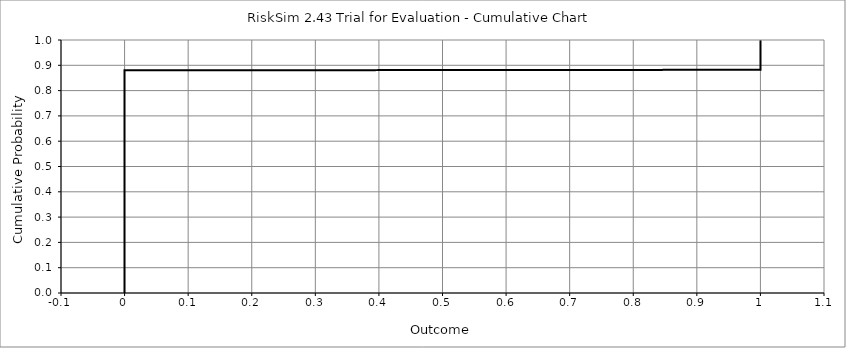
| Category | Series 0 |
|---|---|
| 0.0 | 0 |
| 0.0 | 0 |
| 0.0 | 0 |
| 0.0 | 0 |
| 0.0 | 0 |
| 0.0 | 0.001 |
| 0.0 | 0.001 |
| 0.0 | 0.001 |
| 0.0 | 0.001 |
| 0.0 | 0.001 |
| 0.0 | 0.001 |
| 0.0 | 0.001 |
| 0.0 | 0.001 |
| 0.0 | 0.001 |
| 0.0 | 0.001 |
| 0.0 | 0.002 |
| 0.0 | 0.002 |
| 0.0 | 0.002 |
| 0.0 | 0.002 |
| 0.0 | 0.002 |
| 0.0 | 0.002 |
| 0.0 | 0.002 |
| 0.0 | 0.002 |
| 0.0 | 0.002 |
| 0.0 | 0.002 |
| 0.0 | 0.003 |
| 0.0 | 0.003 |
| 0.0 | 0.003 |
| 0.0 | 0.003 |
| 0.0 | 0.003 |
| 0.0 | 0.003 |
| 0.0 | 0.003 |
| 0.0 | 0.003 |
| 0.0 | 0.003 |
| 0.0 | 0.003 |
| 0.0 | 0.004 |
| 0.0 | 0.004 |
| 0.0 | 0.004 |
| 0.0 | 0.004 |
| 0.0 | 0.004 |
| 0.0 | 0.004 |
| 0.0 | 0.004 |
| 0.0 | 0.004 |
| 0.0 | 0.004 |
| 0.0 | 0.004 |
| 0.0 | 0.005 |
| 0.0 | 0.005 |
| 0.0 | 0.005 |
| 0.0 | 0.005 |
| 0.0 | 0.005 |
| 0.0 | 0.005 |
| 0.0 | 0.005 |
| 0.0 | 0.005 |
| 0.0 | 0.005 |
| 0.0 | 0.005 |
| 0.0 | 0.006 |
| 0.0 | 0.006 |
| 0.0 | 0.006 |
| 0.0 | 0.006 |
| 0.0 | 0.006 |
| 0.0 | 0.006 |
| 0.0 | 0.006 |
| 0.0 | 0.006 |
| 0.0 | 0.006 |
| 0.0 | 0.006 |
| 0.0 | 0.007 |
| 0.0 | 0.007 |
| 0.0 | 0.007 |
| 0.0 | 0.007 |
| 0.0 | 0.007 |
| 0.0 | 0.007 |
| 0.0 | 0.007 |
| 0.0 | 0.007 |
| 0.0 | 0.007 |
| 0.0 | 0.007 |
| 0.0 | 0.008 |
| 0.0 | 0.008 |
| 0.0 | 0.008 |
| 0.0 | 0.008 |
| 0.0 | 0.008 |
| 0.0 | 0.008 |
| 0.0 | 0.008 |
| 0.0 | 0.008 |
| 0.0 | 0.008 |
| 0.0 | 0.008 |
| 0.0 | 0.009 |
| 0.0 | 0.009 |
| 0.0 | 0.009 |
| 0.0 | 0.009 |
| 0.0 | 0.009 |
| 0.0 | 0.009 |
| 0.0 | 0.009 |
| 0.0 | 0.009 |
| 0.0 | 0.009 |
| 0.0 | 0.009 |
| 0.0 | 0.01 |
| 0.0 | 0.01 |
| 0.0 | 0.01 |
| 0.0 | 0.01 |
| 0.0 | 0.01 |
| 0.0 | 0.01 |
| 0.0 | 0.01 |
| 0.0 | 0.01 |
| 0.0 | 0.01 |
| 0.0 | 0.01 |
| 0.0 | 0.011 |
| 0.0 | 0.011 |
| 0.0 | 0.011 |
| 0.0 | 0.011 |
| 0.0 | 0.011 |
| 0.0 | 0.011 |
| 0.0 | 0.011 |
| 0.0 | 0.011 |
| 0.0 | 0.011 |
| 0.0 | 0.011 |
| 0.0 | 0.012 |
| 0.0 | 0.012 |
| 0.0 | 0.012 |
| 0.0 | 0.012 |
| 0.0 | 0.012 |
| 0.0 | 0.012 |
| 0.0 | 0.012 |
| 0.0 | 0.012 |
| 0.0 | 0.012 |
| 0.0 | 0.012 |
| 0.0 | 0.013 |
| 0.0 | 0.013 |
| 0.0 | 0.013 |
| 0.0 | 0.013 |
| 0.0 | 0.013 |
| 0.0 | 0.013 |
| 0.0 | 0.013 |
| 0.0 | 0.013 |
| 0.0 | 0.013 |
| 0.0 | 0.013 |
| 0.0 | 0.014 |
| 0.0 | 0.014 |
| 0.0 | 0.014 |
| 0.0 | 0.014 |
| 0.0 | 0.014 |
| 0.0 | 0.014 |
| 0.0 | 0.014 |
| 0.0 | 0.014 |
| 0.0 | 0.014 |
| 0.0 | 0.014 |
| 0.0 | 0.015 |
| 0.0 | 0.015 |
| 0.0 | 0.015 |
| 0.0 | 0.015 |
| 0.0 | 0.015 |
| 0.0 | 0.015 |
| 0.0 | 0.015 |
| 0.0 | 0.015 |
| 0.0 | 0.015 |
| 0.0 | 0.015 |
| 0.0 | 0.016 |
| 0.0 | 0.016 |
| 0.0 | 0.016 |
| 0.0 | 0.016 |
| 0.0 | 0.016 |
| 0.0 | 0.016 |
| 0.0 | 0.016 |
| 0.0 | 0.016 |
| 0.0 | 0.016 |
| 0.0 | 0.016 |
| 0.0 | 0.017 |
| 0.0 | 0.017 |
| 0.0 | 0.017 |
| 0.0 | 0.017 |
| 0.0 | 0.017 |
| 0.0 | 0.017 |
| 0.0 | 0.017 |
| 0.0 | 0.017 |
| 0.0 | 0.017 |
| 0.0 | 0.017 |
| 0.0 | 0.018 |
| 0.0 | 0.018 |
| 0.0 | 0.018 |
| 0.0 | 0.018 |
| 0.0 | 0.018 |
| 0.0 | 0.018 |
| 0.0 | 0.018 |
| 0.0 | 0.018 |
| 0.0 | 0.018 |
| 0.0 | 0.018 |
| 0.0 | 0.019 |
| 0.0 | 0.019 |
| 0.0 | 0.019 |
| 0.0 | 0.019 |
| 0.0 | 0.019 |
| 0.0 | 0.019 |
| 0.0 | 0.019 |
| 0.0 | 0.019 |
| 0.0 | 0.019 |
| 0.0 | 0.019 |
| 0.0 | 0.02 |
| 0.0 | 0.02 |
| 0.0 | 0.02 |
| 0.0 | 0.02 |
| 0.0 | 0.02 |
| 0.0 | 0.02 |
| 0.0 | 0.02 |
| 0.0 | 0.02 |
| 0.0 | 0.02 |
| 0.0 | 0.02 |
| 0.0 | 0.021 |
| 0.0 | 0.021 |
| 0.0 | 0.021 |
| 0.0 | 0.021 |
| 0.0 | 0.021 |
| 0.0 | 0.021 |
| 0.0 | 0.021 |
| 0.0 | 0.021 |
| 0.0 | 0.021 |
| 0.0 | 0.021 |
| 0.0 | 0.022 |
| 0.0 | 0.022 |
| 0.0 | 0.022 |
| 0.0 | 0.022 |
| 0.0 | 0.022 |
| 0.0 | 0.022 |
| 0.0 | 0.022 |
| 0.0 | 0.022 |
| 0.0 | 0.022 |
| 0.0 | 0.022 |
| 0.0 | 0.023 |
| 0.0 | 0.023 |
| 0.0 | 0.023 |
| 0.0 | 0.023 |
| 0.0 | 0.023 |
| 0.0 | 0.023 |
| 0.0 | 0.023 |
| 0.0 | 0.023 |
| 0.0 | 0.023 |
| 0.0 | 0.023 |
| 0.0 | 0.024 |
| 0.0 | 0.024 |
| 0.0 | 0.024 |
| 0.0 | 0.024 |
| 0.0 | 0.024 |
| 0.0 | 0.024 |
| 0.0 | 0.024 |
| 0.0 | 0.024 |
| 0.0 | 0.024 |
| 0.0 | 0.024 |
| 0.0 | 0.025 |
| 0.0 | 0.025 |
| 0.0 | 0.025 |
| 0.0 | 0.025 |
| 0.0 | 0.025 |
| 0.0 | 0.025 |
| 0.0 | 0.025 |
| 0.0 | 0.025 |
| 0.0 | 0.025 |
| 0.0 | 0.025 |
| 0.0 | 0.026 |
| 0.0 | 0.026 |
| 0.0 | 0.026 |
| 0.0 | 0.026 |
| 0.0 | 0.026 |
| 0.0 | 0.026 |
| 0.0 | 0.026 |
| 0.0 | 0.026 |
| 0.0 | 0.026 |
| 0.0 | 0.026 |
| 0.0 | 0.027 |
| 0.0 | 0.027 |
| 0.0 | 0.027 |
| 0.0 | 0.027 |
| 0.0 | 0.027 |
| 0.0 | 0.027 |
| 0.0 | 0.027 |
| 0.0 | 0.027 |
| 0.0 | 0.027 |
| 0.0 | 0.027 |
| 0.0 | 0.028 |
| 0.0 | 0.028 |
| 0.0 | 0.028 |
| 0.0 | 0.028 |
| 0.0 | 0.028 |
| 0.0 | 0.028 |
| 0.0 | 0.028 |
| 0.0 | 0.028 |
| 0.0 | 0.028 |
| 0.0 | 0.028 |
| 0.0 | 0.029 |
| 0.0 | 0.029 |
| 0.0 | 0.029 |
| 0.0 | 0.029 |
| 0.0 | 0.029 |
| 0.0 | 0.029 |
| 0.0 | 0.029 |
| 0.0 | 0.029 |
| 0.0 | 0.029 |
| 0.0 | 0.029 |
| 0.0 | 0.03 |
| 0.0 | 0.03 |
| 0.0 | 0.03 |
| 0.0 | 0.03 |
| 0.0 | 0.03 |
| 0.0 | 0.03 |
| 0.0 | 0.03 |
| 0.0 | 0.03 |
| 0.0 | 0.03 |
| 0.0 | 0.03 |
| 0.0 | 0.031 |
| 0.0 | 0.031 |
| 0.0 | 0.031 |
| 0.0 | 0.031 |
| 0.0 | 0.031 |
| 0.0 | 0.031 |
| 0.0 | 0.031 |
| 0.0 | 0.031 |
| 0.0 | 0.031 |
| 0.0 | 0.031 |
| 0.0 | 0.032 |
| 0.0 | 0.032 |
| 0.0 | 0.032 |
| 0.0 | 0.032 |
| 0.0 | 0.032 |
| 0.0 | 0.032 |
| 0.0 | 0.032 |
| 0.0 | 0.032 |
| 0.0 | 0.032 |
| 0.0 | 0.032 |
| 0.0 | 0.033 |
| 0.0 | 0.033 |
| 0.0 | 0.033 |
| 0.0 | 0.033 |
| 0.0 | 0.033 |
| 0.0 | 0.033 |
| 0.0 | 0.033 |
| 0.0 | 0.033 |
| 0.0 | 0.033 |
| 0.0 | 0.033 |
| 0.0 | 0.034 |
| 0.0 | 0.034 |
| 0.0 | 0.034 |
| 0.0 | 0.034 |
| 0.0 | 0.034 |
| 0.0 | 0.034 |
| 0.0 | 0.034 |
| 0.0 | 0.034 |
| 0.0 | 0.034 |
| 0.0 | 0.034 |
| 0.0 | 0.035 |
| 0.0 | 0.035 |
| 0.0 | 0.035 |
| 0.0 | 0.035 |
| 0.0 | 0.035 |
| 0.0 | 0.035 |
| 0.0 | 0.035 |
| 0.0 | 0.035 |
| 0.0 | 0.035 |
| 0.0 | 0.035 |
| 0.0 | 0.036 |
| 0.0 | 0.036 |
| 0.0 | 0.036 |
| 0.0 | 0.036 |
| 0.0 | 0.036 |
| 0.0 | 0.036 |
| 0.0 | 0.036 |
| 0.0 | 0.036 |
| 0.0 | 0.036 |
| 0.0 | 0.036 |
| 0.0 | 0.037 |
| 0.0 | 0.037 |
| 0.0 | 0.037 |
| 0.0 | 0.037 |
| 0.0 | 0.037 |
| 0.0 | 0.037 |
| 0.0 | 0.037 |
| 0.0 | 0.037 |
| 0.0 | 0.037 |
| 0.0 | 0.037 |
| 0.0 | 0.038 |
| 0.0 | 0.038 |
| 0.0 | 0.038 |
| 0.0 | 0.038 |
| 0.0 | 0.038 |
| 0.0 | 0.038 |
| 0.0 | 0.038 |
| 0.0 | 0.038 |
| 0.0 | 0.038 |
| 0.0 | 0.038 |
| 0.0 | 0.039 |
| 0.0 | 0.039 |
| 0.0 | 0.039 |
| 0.0 | 0.039 |
| 0.0 | 0.039 |
| 0.0 | 0.039 |
| 0.0 | 0.039 |
| 0.0 | 0.039 |
| 0.0 | 0.039 |
| 0.0 | 0.039 |
| 0.0 | 0.04 |
| 0.0 | 0.04 |
| 0.0 | 0.04 |
| 0.0 | 0.04 |
| 0.0 | 0.04 |
| 0.0 | 0.04 |
| 0.0 | 0.04 |
| 0.0 | 0.04 |
| 0.0 | 0.04 |
| 0.0 | 0.04 |
| 0.0 | 0.041 |
| 0.0 | 0.041 |
| 0.0 | 0.041 |
| 0.0 | 0.041 |
| 0.0 | 0.041 |
| 0.0 | 0.041 |
| 0.0 | 0.041 |
| 0.0 | 0.041 |
| 0.0 | 0.041 |
| 0.0 | 0.041 |
| 0.0 | 0.042 |
| 0.0 | 0.042 |
| 0.0 | 0.042 |
| 0.0 | 0.042 |
| 0.0 | 0.042 |
| 0.0 | 0.042 |
| 0.0 | 0.042 |
| 0.0 | 0.042 |
| 0.0 | 0.042 |
| 0.0 | 0.042 |
| 0.0 | 0.043 |
| 0.0 | 0.043 |
| 0.0 | 0.043 |
| 0.0 | 0.043 |
| 0.0 | 0.043 |
| 0.0 | 0.043 |
| 0.0 | 0.043 |
| 0.0 | 0.043 |
| 0.0 | 0.043 |
| 0.0 | 0.043 |
| 0.0 | 0.044 |
| 0.0 | 0.044 |
| 0.0 | 0.044 |
| 0.0 | 0.044 |
| 0.0 | 0.044 |
| 0.0 | 0.044 |
| 0.0 | 0.044 |
| 0.0 | 0.044 |
| 0.0 | 0.044 |
| 0.0 | 0.044 |
| 0.0 | 0.045 |
| 0.0 | 0.045 |
| 0.0 | 0.045 |
| 0.0 | 0.045 |
| 0.0 | 0.045 |
| 0.0 | 0.045 |
| 0.0 | 0.045 |
| 0.0 | 0.045 |
| 0.0 | 0.045 |
| 0.0 | 0.045 |
| 0.0 | 0.046 |
| 0.0 | 0.046 |
| 0.0 | 0.046 |
| 0.0 | 0.046 |
| 0.0 | 0.046 |
| 0.0 | 0.046 |
| 0.0 | 0.046 |
| 0.0 | 0.046 |
| 0.0 | 0.046 |
| 0.0 | 0.046 |
| 0.0 | 0.047 |
| 0.0 | 0.047 |
| 0.0 | 0.047 |
| 0.0 | 0.047 |
| 0.0 | 0.047 |
| 0.0 | 0.047 |
| 0.0 | 0.047 |
| 0.0 | 0.047 |
| 0.0 | 0.047 |
| 0.0 | 0.047 |
| 0.0 | 0.048 |
| 0.0 | 0.048 |
| 0.0 | 0.048 |
| 0.0 | 0.048 |
| 0.0 | 0.048 |
| 0.0 | 0.048 |
| 0.0 | 0.048 |
| 0.0 | 0.048 |
| 0.0 | 0.048 |
| 0.0 | 0.048 |
| 0.0 | 0.049 |
| 0.0 | 0.049 |
| 0.0 | 0.049 |
| 0.0 | 0.049 |
| 0.0 | 0.049 |
| 0.0 | 0.049 |
| 0.0 | 0.049 |
| 0.0 | 0.049 |
| 0.0 | 0.049 |
| 0.0 | 0.049 |
| 0.0 | 0.05 |
| 0.0 | 0.05 |
| 0.0 | 0.05 |
| 0.0 | 0.05 |
| 0.0 | 0.05 |
| 0.0 | 0.05 |
| 0.0 | 0.05 |
| 0.0 | 0.05 |
| 0.0 | 0.05 |
| 0.0 | 0.05 |
| 0.0 | 0.051 |
| 0.0 | 0.051 |
| 0.0 | 0.051 |
| 0.0 | 0.051 |
| 0.0 | 0.051 |
| 0.0 | 0.051 |
| 0.0 | 0.051 |
| 0.0 | 0.051 |
| 0.0 | 0.051 |
| 0.0 | 0.051 |
| 0.0 | 0.052 |
| 0.0 | 0.052 |
| 0.0 | 0.052 |
| 0.0 | 0.052 |
| 0.0 | 0.052 |
| 0.0 | 0.052 |
| 0.0 | 0.052 |
| 0.0 | 0.052 |
| 0.0 | 0.052 |
| 0.0 | 0.052 |
| 0.0 | 0.053 |
| 0.0 | 0.053 |
| 0.0 | 0.053 |
| 0.0 | 0.053 |
| 0.0 | 0.053 |
| 0.0 | 0.053 |
| 0.0 | 0.053 |
| 0.0 | 0.053 |
| 0.0 | 0.053 |
| 0.0 | 0.053 |
| 0.0 | 0.054 |
| 0.0 | 0.054 |
| 0.0 | 0.054 |
| 0.0 | 0.054 |
| 0.0 | 0.054 |
| 0.0 | 0.054 |
| 0.0 | 0.054 |
| 0.0 | 0.054 |
| 0.0 | 0.054 |
| 0.0 | 0.054 |
| 0.0 | 0.055 |
| 0.0 | 0.055 |
| 0.0 | 0.055 |
| 0.0 | 0.055 |
| 0.0 | 0.055 |
| 0.0 | 0.055 |
| 0.0 | 0.055 |
| 0.0 | 0.055 |
| 0.0 | 0.055 |
| 0.0 | 0.055 |
| 0.0 | 0.056 |
| 0.0 | 0.056 |
| 0.0 | 0.056 |
| 0.0 | 0.056 |
| 0.0 | 0.056 |
| 0.0 | 0.056 |
| 0.0 | 0.056 |
| 0.0 | 0.056 |
| 0.0 | 0.056 |
| 0.0 | 0.056 |
| 0.0 | 0.057 |
| 0.0 | 0.057 |
| 0.0 | 0.057 |
| 0.0 | 0.057 |
| 0.0 | 0.057 |
| 0.0 | 0.057 |
| 0.0 | 0.057 |
| 0.0 | 0.057 |
| 0.0 | 0.057 |
| 0.0 | 0.057 |
| 0.0 | 0.058 |
| 0.0 | 0.058 |
| 0.0 | 0.058 |
| 0.0 | 0.058 |
| 0.0 | 0.058 |
| 0.0 | 0.058 |
| 0.0 | 0.058 |
| 0.0 | 0.058 |
| 0.0 | 0.058 |
| 0.0 | 0.058 |
| 0.0 | 0.059 |
| 0.0 | 0.059 |
| 0.0 | 0.059 |
| 0.0 | 0.059 |
| 0.0 | 0.059 |
| 0.0 | 0.059 |
| 0.0 | 0.059 |
| 0.0 | 0.059 |
| 0.0 | 0.059 |
| 0.0 | 0.059 |
| 0.0 | 0.06 |
| 0.0 | 0.06 |
| 0.0 | 0.06 |
| 0.0 | 0.06 |
| 0.0 | 0.06 |
| 0.0 | 0.06 |
| 0.0 | 0.06 |
| 0.0 | 0.06 |
| 0.0 | 0.06 |
| 0.0 | 0.06 |
| 0.0 | 0.061 |
| 0.0 | 0.061 |
| 0.0 | 0.061 |
| 0.0 | 0.061 |
| 0.0 | 0.061 |
| 0.0 | 0.061 |
| 0.0 | 0.061 |
| 0.0 | 0.061 |
| 0.0 | 0.061 |
| 0.0 | 0.061 |
| 0.0 | 0.062 |
| 0.0 | 0.062 |
| 0.0 | 0.062 |
| 0.0 | 0.062 |
| 0.0 | 0.062 |
| 0.0 | 0.062 |
| 0.0 | 0.062 |
| 0.0 | 0.062 |
| 0.0 | 0.062 |
| 0.0 | 0.062 |
| 0.0 | 0.063 |
| 0.0 | 0.063 |
| 0.0 | 0.063 |
| 0.0 | 0.063 |
| 0.0 | 0.063 |
| 0.0 | 0.063 |
| 0.0 | 0.063 |
| 0.0 | 0.063 |
| 0.0 | 0.063 |
| 0.0 | 0.063 |
| 0.0 | 0.064 |
| 0.0 | 0.064 |
| 0.0 | 0.064 |
| 0.0 | 0.064 |
| 0.0 | 0.064 |
| 0.0 | 0.064 |
| 0.0 | 0.064 |
| 0.0 | 0.064 |
| 0.0 | 0.064 |
| 0.0 | 0.064 |
| 0.0 | 0.065 |
| 0.0 | 0.065 |
| 0.0 | 0.065 |
| 0.0 | 0.065 |
| 0.0 | 0.065 |
| 0.0 | 0.065 |
| 0.0 | 0.065 |
| 0.0 | 0.065 |
| 0.0 | 0.065 |
| 0.0 | 0.065 |
| 0.0 | 0.066 |
| 0.0 | 0.066 |
| 0.0 | 0.066 |
| 0.0 | 0.066 |
| 0.0 | 0.066 |
| 0.0 | 0.066 |
| 0.0 | 0.066 |
| 0.0 | 0.066 |
| 0.0 | 0.066 |
| 0.0 | 0.066 |
| 0.0 | 0.067 |
| 0.0 | 0.067 |
| 0.0 | 0.067 |
| 0.0 | 0.067 |
| 0.0 | 0.067 |
| 0.0 | 0.067 |
| 0.0 | 0.067 |
| 0.0 | 0.067 |
| 0.0 | 0.067 |
| 0.0 | 0.067 |
| 0.0 | 0.068 |
| 0.0 | 0.068 |
| 0.0 | 0.068 |
| 0.0 | 0.068 |
| 0.0 | 0.068 |
| 0.0 | 0.068 |
| 0.0 | 0.068 |
| 0.0 | 0.068 |
| 0.0 | 0.068 |
| 0.0 | 0.068 |
| 0.0 | 0.069 |
| 0.0 | 0.069 |
| 0.0 | 0.069 |
| 0.0 | 0.069 |
| 0.0 | 0.069 |
| 0.0 | 0.069 |
| 0.0 | 0.069 |
| 0.0 | 0.069 |
| 0.0 | 0.069 |
| 0.0 | 0.069 |
| 0.0 | 0.07 |
| 0.0 | 0.07 |
| 0.0 | 0.07 |
| 0.0 | 0.07 |
| 0.0 | 0.07 |
| 0.0 | 0.07 |
| 0.0 | 0.07 |
| 0.0 | 0.07 |
| 0.0 | 0.07 |
| 0.0 | 0.07 |
| 0.0 | 0.071 |
| 0.0 | 0.071 |
| 0.0 | 0.071 |
| 0.0 | 0.071 |
| 0.0 | 0.071 |
| 0.0 | 0.071 |
| 0.0 | 0.071 |
| 0.0 | 0.071 |
| 0.0 | 0.071 |
| 0.0 | 0.071 |
| 0.0 | 0.072 |
| 0.0 | 0.072 |
| 0.0 | 0.072 |
| 0.0 | 0.072 |
| 0.0 | 0.072 |
| 0.0 | 0.072 |
| 0.0 | 0.072 |
| 0.0 | 0.072 |
| 0.0 | 0.072 |
| 0.0 | 0.072 |
| 0.0 | 0.073 |
| 0.0 | 0.073 |
| 0.0 | 0.073 |
| 0.0 | 0.073 |
| 0.0 | 0.073 |
| 0.0 | 0.073 |
| 0.0 | 0.073 |
| 0.0 | 0.073 |
| 0.0 | 0.073 |
| 0.0 | 0.073 |
| 0.0 | 0.074 |
| 0.0 | 0.074 |
| 0.0 | 0.074 |
| 0.0 | 0.074 |
| 0.0 | 0.074 |
| 0.0 | 0.074 |
| 0.0 | 0.074 |
| 0.0 | 0.074 |
| 0.0 | 0.074 |
| 0.0 | 0.074 |
| 0.0 | 0.075 |
| 0.0 | 0.075 |
| 0.0 | 0.075 |
| 0.0 | 0.075 |
| 0.0 | 0.075 |
| 0.0 | 0.075 |
| 0.0 | 0.075 |
| 0.0 | 0.075 |
| 0.0 | 0.075 |
| 0.0 | 0.075 |
| 0.0 | 0.076 |
| 0.0 | 0.076 |
| 0.0 | 0.076 |
| 0.0 | 0.076 |
| 0.0 | 0.076 |
| 0.0 | 0.076 |
| 0.0 | 0.076 |
| 0.0 | 0.076 |
| 0.0 | 0.076 |
| 0.0 | 0.076 |
| 0.0 | 0.077 |
| 0.0 | 0.077 |
| 0.0 | 0.077 |
| 0.0 | 0.077 |
| 0.0 | 0.077 |
| 0.0 | 0.077 |
| 0.0 | 0.077 |
| 0.0 | 0.077 |
| 0.0 | 0.077 |
| 0.0 | 0.077 |
| 0.0 | 0.078 |
| 0.0 | 0.078 |
| 0.0 | 0.078 |
| 0.0 | 0.078 |
| 0.0 | 0.078 |
| 0.0 | 0.078 |
| 0.0 | 0.078 |
| 0.0 | 0.078 |
| 0.0 | 0.078 |
| 0.0 | 0.078 |
| 0.0 | 0.079 |
| 0.0 | 0.079 |
| 0.0 | 0.079 |
| 0.0 | 0.079 |
| 0.0 | 0.079 |
| 0.0 | 0.079 |
| 0.0 | 0.079 |
| 0.0 | 0.079 |
| 0.0 | 0.079 |
| 0.0 | 0.079 |
| 0.0 | 0.08 |
| 0.0 | 0.08 |
| 0.0 | 0.08 |
| 0.0 | 0.08 |
| 0.0 | 0.08 |
| 0.0 | 0.08 |
| 0.0 | 0.08 |
| 0.0 | 0.08 |
| 0.0 | 0.08 |
| 0.0 | 0.08 |
| 0.0 | 0.081 |
| 0.0 | 0.081 |
| 0.0 | 0.081 |
| 0.0 | 0.081 |
| 0.0 | 0.081 |
| 0.0 | 0.081 |
| 0.0 | 0.081 |
| 0.0 | 0.081 |
| 0.0 | 0.081 |
| 0.0 | 0.081 |
| 0.0 | 0.082 |
| 0.0 | 0.082 |
| 0.0 | 0.082 |
| 0.0 | 0.082 |
| 0.0 | 0.082 |
| 0.0 | 0.082 |
| 0.0 | 0.082 |
| 0.0 | 0.082 |
| 0.0 | 0.082 |
| 0.0 | 0.082 |
| 0.0 | 0.083 |
| 0.0 | 0.083 |
| 0.0 | 0.083 |
| 0.0 | 0.083 |
| 0.0 | 0.083 |
| 0.0 | 0.083 |
| 0.0 | 0.083 |
| 0.0 | 0.083 |
| 0.0 | 0.083 |
| 0.0 | 0.083 |
| 0.0 | 0.084 |
| 0.0 | 0.084 |
| 0.0 | 0.084 |
| 0.0 | 0.084 |
| 0.0 | 0.084 |
| 0.0 | 0.084 |
| 0.0 | 0.084 |
| 0.0 | 0.084 |
| 0.0 | 0.084 |
| 0.0 | 0.084 |
| 0.0 | 0.085 |
| 0.0 | 0.085 |
| 0.0 | 0.085 |
| 0.0 | 0.085 |
| 0.0 | 0.085 |
| 0.0 | 0.085 |
| 0.0 | 0.085 |
| 0.0 | 0.085 |
| 0.0 | 0.085 |
| 0.0 | 0.085 |
| 0.0 | 0.086 |
| 0.0 | 0.086 |
| 0.0 | 0.086 |
| 0.0 | 0.086 |
| 0.0 | 0.086 |
| 0.0 | 0.086 |
| 0.0 | 0.086 |
| 0.0 | 0.086 |
| 0.0 | 0.086 |
| 0.0 | 0.086 |
| 0.0 | 0.087 |
| 0.0 | 0.087 |
| 0.0 | 0.087 |
| 0.0 | 0.087 |
| 0.0 | 0.087 |
| 0.0 | 0.087 |
| 0.0 | 0.087 |
| 0.0 | 0.087 |
| 0.0 | 0.087 |
| 0.0 | 0.087 |
| 0.0 | 0.088 |
| 0.0 | 0.088 |
| 0.0 | 0.088 |
| 0.0 | 0.088 |
| 0.0 | 0.088 |
| 0.0 | 0.088 |
| 0.0 | 0.088 |
| 0.0 | 0.088 |
| 0.0 | 0.088 |
| 0.0 | 0.088 |
| 0.0 | 0.089 |
| 0.0 | 0.089 |
| 0.0 | 0.089 |
| 0.0 | 0.089 |
| 0.0 | 0.089 |
| 0.0 | 0.089 |
| 0.0 | 0.089 |
| 0.0 | 0.089 |
| 0.0 | 0.089 |
| 0.0 | 0.089 |
| 0.0 | 0.09 |
| 0.0 | 0.09 |
| 0.0 | 0.09 |
| 0.0 | 0.09 |
| 0.0 | 0.09 |
| 0.0 | 0.09 |
| 0.0 | 0.09 |
| 0.0 | 0.09 |
| 0.0 | 0.09 |
| 0.0 | 0.09 |
| 0.0 | 0.091 |
| 0.0 | 0.091 |
| 0.0 | 0.091 |
| 0.0 | 0.091 |
| 0.0 | 0.091 |
| 0.0 | 0.091 |
| 0.0 | 0.091 |
| 0.0 | 0.091 |
| 0.0 | 0.091 |
| 0.0 | 0.091 |
| 0.0 | 0.092 |
| 0.0 | 0.092 |
| 0.0 | 0.092 |
| 0.0 | 0.092 |
| 0.0 | 0.092 |
| 0.0 | 0.092 |
| 0.0 | 0.092 |
| 0.0 | 0.092 |
| 0.0 | 0.092 |
| 0.0 | 0.092 |
| 0.0 | 0.093 |
| 0.0 | 0.093 |
| 0.0 | 0.093 |
| 0.0 | 0.093 |
| 0.0 | 0.093 |
| 0.0 | 0.093 |
| 0.0 | 0.093 |
| 0.0 | 0.093 |
| 0.0 | 0.093 |
| 0.0 | 0.093 |
| 0.0 | 0.094 |
| 0.0 | 0.094 |
| 0.0 | 0.094 |
| 0.0 | 0.094 |
| 0.0 | 0.094 |
| 0.0 | 0.094 |
| 0.0 | 0.094 |
| 0.0 | 0.094 |
| 0.0 | 0.094 |
| 0.0 | 0.094 |
| 0.0 | 0.095 |
| 0.0 | 0.095 |
| 0.0 | 0.095 |
| 0.0 | 0.095 |
| 0.0 | 0.095 |
| 0.0 | 0.095 |
| 0.0 | 0.095 |
| 0.0 | 0.095 |
| 0.0 | 0.095 |
| 0.0 | 0.095 |
| 0.0 | 0.096 |
| 0.0 | 0.096 |
| 0.0 | 0.096 |
| 0.0 | 0.096 |
| 0.0 | 0.096 |
| 0.0 | 0.096 |
| 0.0 | 0.096 |
| 0.0 | 0.096 |
| 0.0 | 0.096 |
| 0.0 | 0.096 |
| 0.0 | 0.097 |
| 0.0 | 0.097 |
| 0.0 | 0.097 |
| 0.0 | 0.097 |
| 0.0 | 0.097 |
| 0.0 | 0.097 |
| 0.0 | 0.097 |
| 0.0 | 0.097 |
| 0.0 | 0.097 |
| 0.0 | 0.097 |
| 0.0 | 0.098 |
| 0.0 | 0.098 |
| 0.0 | 0.098 |
| 0.0 | 0.098 |
| 0.0 | 0.098 |
| 0.0 | 0.098 |
| 0.0 | 0.098 |
| 0.0 | 0.098 |
| 0.0 | 0.098 |
| 0.0 | 0.098 |
| 0.0 | 0.099 |
| 0.0 | 0.099 |
| 0.0 | 0.099 |
| 0.0 | 0.099 |
| 0.0 | 0.099 |
| 0.0 | 0.099 |
| 0.0 | 0.099 |
| 0.0 | 0.099 |
| 0.0 | 0.099 |
| 0.0 | 0.099 |
| 0.0 | 0.1 |
| 0.0 | 0.1 |
| 0.0 | 0.1 |
| 0.0 | 0.1 |
| 0.0 | 0.1 |
| 0.0 | 0.1 |
| 0.0 | 0.1 |
| 0.0 | 0.1 |
| 0.0 | 0.1 |
| 0.0 | 0.1 |
| 0.0 | 0.101 |
| 0.0 | 0.101 |
| 0.0 | 0.101 |
| 0.0 | 0.101 |
| 0.0 | 0.101 |
| 0.0 | 0.101 |
| 0.0 | 0.101 |
| 0.0 | 0.101 |
| 0.0 | 0.101 |
| 0.0 | 0.101 |
| 0.0 | 0.102 |
| 0.0 | 0.102 |
| 0.0 | 0.102 |
| 0.0 | 0.102 |
| 0.0 | 0.102 |
| 0.0 | 0.102 |
| 0.0 | 0.102 |
| 0.0 | 0.102 |
| 0.0 | 0.102 |
| 0.0 | 0.102 |
| 0.0 | 0.103 |
| 0.0 | 0.103 |
| 0.0 | 0.103 |
| 0.0 | 0.103 |
| 0.0 | 0.103 |
| 0.0 | 0.103 |
| 0.0 | 0.103 |
| 0.0 | 0.103 |
| 0.0 | 0.103 |
| 0.0 | 0.103 |
| 0.0 | 0.104 |
| 0.0 | 0.104 |
| 0.0 | 0.104 |
| 0.0 | 0.104 |
| 0.0 | 0.104 |
| 0.0 | 0.104 |
| 0.0 | 0.104 |
| 0.0 | 0.104 |
| 0.0 | 0.104 |
| 0.0 | 0.104 |
| 0.0 | 0.105 |
| 0.0 | 0.105 |
| 0.0 | 0.105 |
| 0.0 | 0.105 |
| 0.0 | 0.105 |
| 0.0 | 0.105 |
| 0.0 | 0.105 |
| 0.0 | 0.105 |
| 0.0 | 0.105 |
| 0.0 | 0.105 |
| 0.0 | 0.106 |
| 0.0 | 0.106 |
| 0.0 | 0.106 |
| 0.0 | 0.106 |
| 0.0 | 0.106 |
| 0.0 | 0.106 |
| 0.0 | 0.106 |
| 0.0 | 0.106 |
| 0.0 | 0.106 |
| 0.0 | 0.106 |
| 0.0 | 0.107 |
| 0.0 | 0.107 |
| 0.0 | 0.107 |
| 0.0 | 0.107 |
| 0.0 | 0.107 |
| 0.0 | 0.107 |
| 0.0 | 0.107 |
| 0.0 | 0.107 |
| 0.0 | 0.107 |
| 0.0 | 0.107 |
| 0.0 | 0.108 |
| 0.0 | 0.108 |
| 0.0 | 0.108 |
| 0.0 | 0.108 |
| 0.0 | 0.108 |
| 0.0 | 0.108 |
| 0.0 | 0.108 |
| 0.0 | 0.108 |
| 0.0 | 0.108 |
| 0.0 | 0.108 |
| 0.0 | 0.109 |
| 0.0 | 0.109 |
| 0.0 | 0.109 |
| 0.0 | 0.109 |
| 0.0 | 0.109 |
| 0.0 | 0.109 |
| 0.0 | 0.109 |
| 0.0 | 0.109 |
| 0.0 | 0.109 |
| 0.0 | 0.109 |
| 0.0 | 0.11 |
| 0.0 | 0.11 |
| 0.0 | 0.11 |
| 0.0 | 0.11 |
| 0.0 | 0.11 |
| 0.0 | 0.11 |
| 0.0 | 0.11 |
| 0.0 | 0.11 |
| 0.0 | 0.11 |
| 0.0 | 0.11 |
| 0.0 | 0.111 |
| 0.0 | 0.111 |
| 0.0 | 0.111 |
| 0.0 | 0.111 |
| 0.0 | 0.111 |
| 0.0 | 0.111 |
| 0.0 | 0.111 |
| 0.0 | 0.111 |
| 0.0 | 0.111 |
| 0.0 | 0.111 |
| 0.0 | 0.112 |
| 0.0 | 0.112 |
| 0.0 | 0.112 |
| 0.0 | 0.112 |
| 0.0 | 0.112 |
| 0.0 | 0.112 |
| 0.0 | 0.112 |
| 0.0 | 0.112 |
| 0.0 | 0.112 |
| 0.0 | 0.112 |
| 0.0 | 0.113 |
| 0.0 | 0.113 |
| 0.0 | 0.113 |
| 0.0 | 0.113 |
| 0.0 | 0.113 |
| 0.0 | 0.113 |
| 0.0 | 0.113 |
| 0.0 | 0.113 |
| 0.0 | 0.113 |
| 0.0 | 0.113 |
| 0.0 | 0.114 |
| 0.0 | 0.114 |
| 0.0 | 0.114 |
| 0.0 | 0.114 |
| 0.0 | 0.114 |
| 0.0 | 0.114 |
| 0.0 | 0.114 |
| 0.0 | 0.114 |
| 0.0 | 0.114 |
| 0.0 | 0.114 |
| 0.0 | 0.115 |
| 0.0 | 0.115 |
| 0.0 | 0.115 |
| 0.0 | 0.115 |
| 0.0 | 0.115 |
| 0.0 | 0.115 |
| 0.0 | 0.115 |
| 0.0 | 0.115 |
| 0.0 | 0.115 |
| 0.0 | 0.115 |
| 0.0 | 0.116 |
| 0.0 | 0.116 |
| 0.0 | 0.116 |
| 0.0 | 0.116 |
| 0.0 | 0.116 |
| 0.0 | 0.116 |
| 0.0 | 0.116 |
| 0.0 | 0.116 |
| 0.0 | 0.116 |
| 0.0 | 0.116 |
| 0.0 | 0.117 |
| 0.0 | 0.117 |
| 0.0 | 0.117 |
| 0.0 | 0.117 |
| 0.0 | 0.117 |
| 0.0 | 0.117 |
| 0.0 | 0.117 |
| 0.0 | 0.117 |
| 0.0 | 0.117 |
| 0.0 | 0.117 |
| 0.0 | 0.118 |
| 0.0 | 0.118 |
| 0.0 | 0.118 |
| 0.0 | 0.118 |
| 0.0 | 0.118 |
| 0.0 | 0.118 |
| 0.0 | 0.118 |
| 0.0 | 0.118 |
| 0.0 | 0.118 |
| 0.0 | 0.118 |
| 0.0 | 0.119 |
| 0.0 | 0.119 |
| 0.0 | 0.119 |
| 0.0 | 0.119 |
| 0.0 | 0.119 |
| 0.0 | 0.119 |
| 0.0 | 0.119 |
| 0.0 | 0.119 |
| 0.0 | 0.119 |
| 0.0 | 0.119 |
| 0.0 | 0.12 |
| 0.0 | 0.12 |
| 0.0 | 0.12 |
| 0.0 | 0.12 |
| 0.0 | 0.12 |
| 0.0 | 0.12 |
| 0.0 | 0.12 |
| 0.0 | 0.12 |
| 0.0 | 0.12 |
| 0.0 | 0.12 |
| 0.0 | 0.121 |
| 0.0 | 0.121 |
| 0.0 | 0.121 |
| 0.0 | 0.121 |
| 0.0 | 0.121 |
| 0.0 | 0.121 |
| 0.0 | 0.121 |
| 0.0 | 0.121 |
| 0.0 | 0.121 |
| 0.0 | 0.121 |
| 0.0 | 0.122 |
| 0.0 | 0.122 |
| 0.0 | 0.122 |
| 0.0 | 0.122 |
| 0.0 | 0.122 |
| 0.0 | 0.122 |
| 0.0 | 0.122 |
| 0.0 | 0.122 |
| 0.0 | 0.122 |
| 0.0 | 0.122 |
| 0.0 | 0.123 |
| 0.0 | 0.123 |
| 0.0 | 0.123 |
| 0.0 | 0.123 |
| 0.0 | 0.123 |
| 0.0 | 0.123 |
| 0.0 | 0.123 |
| 0.0 | 0.123 |
| 0.0 | 0.123 |
| 0.0 | 0.123 |
| 0.0 | 0.124 |
| 0.0 | 0.124 |
| 0.0 | 0.124 |
| 0.0 | 0.124 |
| 0.0 | 0.124 |
| 0.0 | 0.124 |
| 0.0 | 0.124 |
| 0.0 | 0.124 |
| 0.0 | 0.124 |
| 0.0 | 0.124 |
| 0.0 | 0.125 |
| 0.0 | 0.125 |
| 0.0 | 0.125 |
| 0.0 | 0.125 |
| 0.0 | 0.125 |
| 0.0 | 0.125 |
| 0.0 | 0.125 |
| 0.0 | 0.125 |
| 0.0 | 0.125 |
| 0.0 | 0.125 |
| 0.0 | 0.126 |
| 0.0 | 0.126 |
| 0.0 | 0.126 |
| 0.0 | 0.126 |
| 0.0 | 0.126 |
| 0.0 | 0.126 |
| 0.0 | 0.126 |
| 0.0 | 0.126 |
| 0.0 | 0.126 |
| 0.0 | 0.126 |
| 0.0 | 0.127 |
| 0.0 | 0.127 |
| 0.0 | 0.127 |
| 0.0 | 0.127 |
| 0.0 | 0.127 |
| 0.0 | 0.127 |
| 0.0 | 0.127 |
| 0.0 | 0.127 |
| 0.0 | 0.127 |
| 0.0 | 0.127 |
| 0.0 | 0.128 |
| 0.0 | 0.128 |
| 0.0 | 0.128 |
| 0.0 | 0.128 |
| 0.0 | 0.128 |
| 0.0 | 0.128 |
| 0.0 | 0.128 |
| 0.0 | 0.128 |
| 0.0 | 0.128 |
| 0.0 | 0.128 |
| 0.0 | 0.129 |
| 0.0 | 0.129 |
| 0.0 | 0.129 |
| 0.0 | 0.129 |
| 0.0 | 0.129 |
| 0.0 | 0.129 |
| 0.0 | 0.129 |
| 0.0 | 0.129 |
| 0.0 | 0.129 |
| 0.0 | 0.129 |
| 0.0 | 0.13 |
| 0.0 | 0.13 |
| 0.0 | 0.13 |
| 0.0 | 0.13 |
| 0.0 | 0.13 |
| 0.0 | 0.13 |
| 0.0 | 0.13 |
| 0.0 | 0.13 |
| 0.0 | 0.13 |
| 0.0 | 0.13 |
| 0.0 | 0.131 |
| 0.0 | 0.131 |
| 0.0 | 0.131 |
| 0.0 | 0.131 |
| 0.0 | 0.131 |
| 0.0 | 0.131 |
| 0.0 | 0.131 |
| 0.0 | 0.131 |
| 0.0 | 0.131 |
| 0.0 | 0.131 |
| 0.0 | 0.132 |
| 0.0 | 0.132 |
| 0.0 | 0.132 |
| 0.0 | 0.132 |
| 0.0 | 0.132 |
| 0.0 | 0.132 |
| 0.0 | 0.132 |
| 0.0 | 0.132 |
| 0.0 | 0.132 |
| 0.0 | 0.132 |
| 0.0 | 0.133 |
| 0.0 | 0.133 |
| 0.0 | 0.133 |
| 0.0 | 0.133 |
| 0.0 | 0.133 |
| 0.0 | 0.133 |
| 0.0 | 0.133 |
| 0.0 | 0.133 |
| 0.0 | 0.133 |
| 0.0 | 0.133 |
| 0.0 | 0.134 |
| 0.0 | 0.134 |
| 0.0 | 0.134 |
| 0.0 | 0.134 |
| 0.0 | 0.134 |
| 0.0 | 0.134 |
| 0.0 | 0.134 |
| 0.0 | 0.134 |
| 0.0 | 0.134 |
| 0.0 | 0.134 |
| 0.0 | 0.135 |
| 0.0 | 0.135 |
| 0.0 | 0.135 |
| 0.0 | 0.135 |
| 0.0 | 0.135 |
| 0.0 | 0.135 |
| 0.0 | 0.135 |
| 0.0 | 0.135 |
| 0.0 | 0.135 |
| 0.0 | 0.135 |
| 0.0 | 0.136 |
| 0.0 | 0.136 |
| 0.0 | 0.136 |
| 0.0 | 0.136 |
| 0.0 | 0.136 |
| 0.0 | 0.136 |
| 0.0 | 0.136 |
| 0.0 | 0.136 |
| 0.0 | 0.136 |
| 0.0 | 0.136 |
| 0.0 | 0.137 |
| 0.0 | 0.137 |
| 0.0 | 0.137 |
| 0.0 | 0.137 |
| 0.0 | 0.137 |
| 0.0 | 0.137 |
| 0.0 | 0.137 |
| 0.0 | 0.137 |
| 0.0 | 0.137 |
| 0.0 | 0.137 |
| 0.0 | 0.138 |
| 0.0 | 0.138 |
| 0.0 | 0.138 |
| 0.0 | 0.138 |
| 0.0 | 0.138 |
| 0.0 | 0.138 |
| 0.0 | 0.138 |
| 0.0 | 0.138 |
| 0.0 | 0.138 |
| 0.0 | 0.138 |
| 0.0 | 0.139 |
| 0.0 | 0.139 |
| 0.0 | 0.139 |
| 0.0 | 0.139 |
| 0.0 | 0.139 |
| 0.0 | 0.139 |
| 0.0 | 0.139 |
| 0.0 | 0.139 |
| 0.0 | 0.139 |
| 0.0 | 0.139 |
| 0.0 | 0.14 |
| 0.0 | 0.14 |
| 0.0 | 0.14 |
| 0.0 | 0.14 |
| 0.0 | 0.14 |
| 0.0 | 0.14 |
| 0.0 | 0.14 |
| 0.0 | 0.14 |
| 0.0 | 0.14 |
| 0.0 | 0.14 |
| 0.0 | 0.141 |
| 0.0 | 0.141 |
| 0.0 | 0.141 |
| 0.0 | 0.141 |
| 0.0 | 0.141 |
| 0.0 | 0.141 |
| 0.0 | 0.141 |
| 0.0 | 0.141 |
| 0.0 | 0.141 |
| 0.0 | 0.141 |
| 0.0 | 0.142 |
| 0.0 | 0.142 |
| 0.0 | 0.142 |
| 0.0 | 0.142 |
| 0.0 | 0.142 |
| 0.0 | 0.142 |
| 0.0 | 0.142 |
| 0.0 | 0.142 |
| 0.0 | 0.142 |
| 0.0 | 0.142 |
| 0.0 | 0.143 |
| 0.0 | 0.143 |
| 0.0 | 0.143 |
| 0.0 | 0.143 |
| 0.0 | 0.143 |
| 0.0 | 0.143 |
| 0.0 | 0.143 |
| 0.0 | 0.143 |
| 0.0 | 0.143 |
| 0.0 | 0.143 |
| 0.0 | 0.144 |
| 0.0 | 0.144 |
| 0.0 | 0.144 |
| 0.0 | 0.144 |
| 0.0 | 0.144 |
| 0.0 | 0.144 |
| 0.0 | 0.144 |
| 0.0 | 0.144 |
| 0.0 | 0.144 |
| 0.0 | 0.144 |
| 0.0 | 0.145 |
| 0.0 | 0.145 |
| 0.0 | 0.145 |
| 0.0 | 0.145 |
| 0.0 | 0.145 |
| 0.0 | 0.145 |
| 0.0 | 0.145 |
| 0.0 | 0.145 |
| 0.0 | 0.145 |
| 0.0 | 0.145 |
| 0.0 | 0.146 |
| 0.0 | 0.146 |
| 0.0 | 0.146 |
| 0.0 | 0.146 |
| 0.0 | 0.146 |
| 0.0 | 0.146 |
| 0.0 | 0.146 |
| 0.0 | 0.146 |
| 0.0 | 0.146 |
| 0.0 | 0.146 |
| 0.0 | 0.147 |
| 0.0 | 0.147 |
| 0.0 | 0.147 |
| 0.0 | 0.147 |
| 0.0 | 0.147 |
| 0.0 | 0.147 |
| 0.0 | 0.147 |
| 0.0 | 0.147 |
| 0.0 | 0.147 |
| 0.0 | 0.147 |
| 0.0 | 0.148 |
| 0.0 | 0.148 |
| 0.0 | 0.148 |
| 0.0 | 0.148 |
| 0.0 | 0.148 |
| 0.0 | 0.148 |
| 0.0 | 0.148 |
| 0.0 | 0.148 |
| 0.0 | 0.148 |
| 0.0 | 0.148 |
| 0.0 | 0.149 |
| 0.0 | 0.149 |
| 0.0 | 0.149 |
| 0.0 | 0.149 |
| 0.0 | 0.149 |
| 0.0 | 0.149 |
| 0.0 | 0.149 |
| 0.0 | 0.149 |
| 0.0 | 0.149 |
| 0.0 | 0.149 |
| 0.0 | 0.15 |
| 0.0 | 0.15 |
| 0.0 | 0.15 |
| 0.0 | 0.15 |
| 0.0 | 0.15 |
| 0.0 | 0.15 |
| 0.0 | 0.15 |
| 0.0 | 0.15 |
| 0.0 | 0.15 |
| 0.0 | 0.15 |
| 0.0 | 0.151 |
| 0.0 | 0.151 |
| 0.0 | 0.151 |
| 0.0 | 0.151 |
| 0.0 | 0.151 |
| 0.0 | 0.151 |
| 0.0 | 0.151 |
| 0.0 | 0.151 |
| 0.0 | 0.151 |
| 0.0 | 0.151 |
| 0.0 | 0.152 |
| 0.0 | 0.152 |
| 0.0 | 0.152 |
| 0.0 | 0.152 |
| 0.0 | 0.152 |
| 0.0 | 0.152 |
| 0.0 | 0.152 |
| 0.0 | 0.152 |
| 0.0 | 0.152 |
| 0.0 | 0.152 |
| 0.0 | 0.153 |
| 0.0 | 0.153 |
| 0.0 | 0.153 |
| 0.0 | 0.153 |
| 0.0 | 0.153 |
| 0.0 | 0.153 |
| 0.0 | 0.153 |
| 0.0 | 0.153 |
| 0.0 | 0.153 |
| 0.0 | 0.153 |
| 0.0 | 0.154 |
| 0.0 | 0.154 |
| 0.0 | 0.154 |
| 0.0 | 0.154 |
| 0.0 | 0.154 |
| 0.0 | 0.154 |
| 0.0 | 0.154 |
| 0.0 | 0.154 |
| 0.0 | 0.154 |
| 0.0 | 0.154 |
| 0.0 | 0.155 |
| 0.0 | 0.155 |
| 0.0 | 0.155 |
| 0.0 | 0.155 |
| 0.0 | 0.155 |
| 0.0 | 0.155 |
| 0.0 | 0.155 |
| 0.0 | 0.155 |
| 0.0 | 0.155 |
| 0.0 | 0.155 |
| 0.0 | 0.156 |
| 0.0 | 0.156 |
| 0.0 | 0.156 |
| 0.0 | 0.156 |
| 0.0 | 0.156 |
| 0.0 | 0.156 |
| 0.0 | 0.156 |
| 0.0 | 0.156 |
| 0.0 | 0.156 |
| 0.0 | 0.156 |
| 0.0 | 0.157 |
| 0.0 | 0.157 |
| 0.0 | 0.157 |
| 0.0 | 0.157 |
| 0.0 | 0.157 |
| 0.0 | 0.157 |
| 0.0 | 0.157 |
| 0.0 | 0.157 |
| 0.0 | 0.157 |
| 0.0 | 0.157 |
| 0.0 | 0.158 |
| 0.0 | 0.158 |
| 0.0 | 0.158 |
| 0.0 | 0.158 |
| 0.0 | 0.158 |
| 0.0 | 0.158 |
| 0.0 | 0.158 |
| 0.0 | 0.158 |
| 0.0 | 0.158 |
| 0.0 | 0.158 |
| 0.0 | 0.159 |
| 0.0 | 0.159 |
| 0.0 | 0.159 |
| 0.0 | 0.159 |
| 0.0 | 0.159 |
| 0.0 | 0.159 |
| 0.0 | 0.159 |
| 0.0 | 0.159 |
| 0.0 | 0.159 |
| 0.0 | 0.159 |
| 0.0 | 0.16 |
| 0.0 | 0.16 |
| 0.0 | 0.16 |
| 0.0 | 0.16 |
| 0.0 | 0.16 |
| 0.0 | 0.16 |
| 0.0 | 0.16 |
| 0.0 | 0.16 |
| 0.0 | 0.16 |
| 0.0 | 0.16 |
| 0.0 | 0.161 |
| 0.0 | 0.161 |
| 0.0 | 0.161 |
| 0.0 | 0.161 |
| 0.0 | 0.161 |
| 0.0 | 0.161 |
| 0.0 | 0.161 |
| 0.0 | 0.161 |
| 0.0 | 0.161 |
| 0.0 | 0.161 |
| 0.0 | 0.162 |
| 0.0 | 0.162 |
| 0.0 | 0.162 |
| 0.0 | 0.162 |
| 0.0 | 0.162 |
| 0.0 | 0.162 |
| 0.0 | 0.162 |
| 0.0 | 0.162 |
| 0.0 | 0.162 |
| 0.0 | 0.162 |
| 0.0 | 0.163 |
| 0.0 | 0.163 |
| 0.0 | 0.163 |
| 0.0 | 0.163 |
| 0.0 | 0.163 |
| 0.0 | 0.163 |
| 0.0 | 0.163 |
| 0.0 | 0.163 |
| 0.0 | 0.163 |
| 0.0 | 0.163 |
| 0.0 | 0.164 |
| 0.0 | 0.164 |
| 0.0 | 0.164 |
| 0.0 | 0.164 |
| 0.0 | 0.164 |
| 0.0 | 0.164 |
| 0.0 | 0.164 |
| 0.0 | 0.164 |
| 0.0 | 0.164 |
| 0.0 | 0.164 |
| 0.0 | 0.165 |
| 0.0 | 0.165 |
| 0.0 | 0.165 |
| 0.0 | 0.165 |
| 0.0 | 0.165 |
| 0.0 | 0.165 |
| 0.0 | 0.165 |
| 0.0 | 0.165 |
| 0.0 | 0.165 |
| 0.0 | 0.165 |
| 0.0 | 0.166 |
| 0.0 | 0.166 |
| 0.0 | 0.166 |
| 0.0 | 0.166 |
| 0.0 | 0.166 |
| 0.0 | 0.166 |
| 0.0 | 0.166 |
| 0.0 | 0.166 |
| 0.0 | 0.166 |
| 0.0 | 0.166 |
| 0.0 | 0.167 |
| 0.0 | 0.167 |
| 0.0 | 0.167 |
| 0.0 | 0.167 |
| 0.0 | 0.167 |
| 0.0 | 0.167 |
| 0.0 | 0.167 |
| 0.0 | 0.167 |
| 0.0 | 0.167 |
| 0.0 | 0.167 |
| 0.0 | 0.168 |
| 0.0 | 0.168 |
| 0.0 | 0.168 |
| 0.0 | 0.168 |
| 0.0 | 0.168 |
| 0.0 | 0.168 |
| 0.0 | 0.168 |
| 0.0 | 0.168 |
| 0.0 | 0.168 |
| 0.0 | 0.168 |
| 0.0 | 0.169 |
| 0.0 | 0.169 |
| 0.0 | 0.169 |
| 0.0 | 0.169 |
| 0.0 | 0.169 |
| 0.0 | 0.169 |
| 0.0 | 0.169 |
| 0.0 | 0.169 |
| 0.0 | 0.169 |
| 0.0 | 0.169 |
| 0.0 | 0.17 |
| 0.0 | 0.17 |
| 0.0 | 0.17 |
| 0.0 | 0.17 |
| 0.0 | 0.17 |
| 0.0 | 0.17 |
| 0.0 | 0.17 |
| 0.0 | 0.17 |
| 0.0 | 0.17 |
| 0.0 | 0.17 |
| 0.0 | 0.171 |
| 0.0 | 0.171 |
| 0.0 | 0.171 |
| 0.0 | 0.171 |
| 0.0 | 0.171 |
| 0.0 | 0.171 |
| 0.0 | 0.171 |
| 0.0 | 0.171 |
| 0.0 | 0.171 |
| 0.0 | 0.171 |
| 0.0 | 0.172 |
| 0.0 | 0.172 |
| 0.0 | 0.172 |
| 0.0 | 0.172 |
| 0.0 | 0.172 |
| 0.0 | 0.172 |
| 0.0 | 0.172 |
| 0.0 | 0.172 |
| 0.0 | 0.172 |
| 0.0 | 0.172 |
| 0.0 | 0.173 |
| 0.0 | 0.173 |
| 0.0 | 0.173 |
| 0.0 | 0.173 |
| 0.0 | 0.173 |
| 0.0 | 0.173 |
| 0.0 | 0.173 |
| 0.0 | 0.173 |
| 0.0 | 0.173 |
| 0.0 | 0.173 |
| 0.0 | 0.174 |
| 0.0 | 0.174 |
| 0.0 | 0.174 |
| 0.0 | 0.174 |
| 0.0 | 0.174 |
| 0.0 | 0.174 |
| 0.0 | 0.174 |
| 0.0 | 0.174 |
| 0.0 | 0.174 |
| 0.0 | 0.174 |
| 0.0 | 0.175 |
| 0.0 | 0.175 |
| 0.0 | 0.175 |
| 0.0 | 0.175 |
| 0.0 | 0.175 |
| 0.0 | 0.175 |
| 0.0 | 0.175 |
| 0.0 | 0.175 |
| 0.0 | 0.175 |
| 0.0 | 0.175 |
| 0.0 | 0.176 |
| 0.0 | 0.176 |
| 0.0 | 0.176 |
| 0.0 | 0.176 |
| 0.0 | 0.176 |
| 0.0 | 0.176 |
| 0.0 | 0.176 |
| 0.0 | 0.176 |
| 0.0 | 0.176 |
| 0.0 | 0.176 |
| 0.0 | 0.177 |
| 0.0 | 0.177 |
| 0.0 | 0.177 |
| 0.0 | 0.177 |
| 0.0 | 0.177 |
| 0.0 | 0.177 |
| 0.0 | 0.177 |
| 0.0 | 0.177 |
| 0.0 | 0.177 |
| 0.0 | 0.177 |
| 0.0 | 0.178 |
| 0.0 | 0.178 |
| 0.0 | 0.178 |
| 0.0 | 0.178 |
| 0.0 | 0.178 |
| 0.0 | 0.178 |
| 0.0 | 0.178 |
| 0.0 | 0.178 |
| 0.0 | 0.178 |
| 0.0 | 0.178 |
| 0.0 | 0.179 |
| 0.0 | 0.179 |
| 0.0 | 0.179 |
| 0.0 | 0.179 |
| 0.0 | 0.179 |
| 0.0 | 0.179 |
| 0.0 | 0.179 |
| 0.0 | 0.179 |
| 0.0 | 0.179 |
| 0.0 | 0.179 |
| 0.0 | 0.18 |
| 0.0 | 0.18 |
| 0.0 | 0.18 |
| 0.0 | 0.18 |
| 0.0 | 0.18 |
| 0.0 | 0.18 |
| 0.0 | 0.18 |
| 0.0 | 0.18 |
| 0.0 | 0.18 |
| 0.0 | 0.18 |
| 0.0 | 0.181 |
| 0.0 | 0.181 |
| 0.0 | 0.181 |
| 0.0 | 0.181 |
| 0.0 | 0.181 |
| 0.0 | 0.181 |
| 0.0 | 0.181 |
| 0.0 | 0.181 |
| 0.0 | 0.181 |
| 0.0 | 0.181 |
| 0.0 | 0.182 |
| 0.0 | 0.182 |
| 0.0 | 0.182 |
| 0.0 | 0.182 |
| 0.0 | 0.182 |
| 0.0 | 0.182 |
| 0.0 | 0.182 |
| 0.0 | 0.182 |
| 0.0 | 0.182 |
| 0.0 | 0.182 |
| 0.0 | 0.183 |
| 0.0 | 0.183 |
| 0.0 | 0.183 |
| 0.0 | 0.183 |
| 0.0 | 0.183 |
| 0.0 | 0.183 |
| 0.0 | 0.183 |
| 0.0 | 0.183 |
| 0.0 | 0.183 |
| 0.0 | 0.183 |
| 0.0 | 0.184 |
| 0.0 | 0.184 |
| 0.0 | 0.184 |
| 0.0 | 0.184 |
| 0.0 | 0.184 |
| 0.0 | 0.184 |
| 0.0 | 0.184 |
| 0.0 | 0.184 |
| 0.0 | 0.184 |
| 0.0 | 0.184 |
| 0.0 | 0.185 |
| 0.0 | 0.185 |
| 0.0 | 0.185 |
| 0.0 | 0.185 |
| 0.0 | 0.185 |
| 0.0 | 0.185 |
| 0.0 | 0.185 |
| 0.0 | 0.185 |
| 0.0 | 0.185 |
| 0.0 | 0.185 |
| 0.0 | 0.186 |
| 0.0 | 0.186 |
| 0.0 | 0.186 |
| 0.0 | 0.186 |
| 0.0 | 0.186 |
| 0.0 | 0.186 |
| 0.0 | 0.186 |
| 0.0 | 0.186 |
| 0.0 | 0.186 |
| 0.0 | 0.186 |
| 0.0 | 0.187 |
| 0.0 | 0.187 |
| 0.0 | 0.187 |
| 0.0 | 0.187 |
| 0.0 | 0.187 |
| 0.0 | 0.187 |
| 0.0 | 0.187 |
| 0.0 | 0.187 |
| 0.0 | 0.187 |
| 0.0 | 0.187 |
| 0.0 | 0.188 |
| 0.0 | 0.188 |
| 0.0 | 0.188 |
| 0.0 | 0.188 |
| 0.0 | 0.188 |
| 0.0 | 0.188 |
| 0.0 | 0.188 |
| 0.0 | 0.188 |
| 0.0 | 0.188 |
| 0.0 | 0.188 |
| 0.0 | 0.189 |
| 0.0 | 0.189 |
| 0.0 | 0.189 |
| 0.0 | 0.189 |
| 0.0 | 0.189 |
| 0.0 | 0.189 |
| 0.0 | 0.189 |
| 0.0 | 0.189 |
| 0.0 | 0.189 |
| 0.0 | 0.189 |
| 0.0 | 0.19 |
| 0.0 | 0.19 |
| 0.0 | 0.19 |
| 0.0 | 0.19 |
| 0.0 | 0.19 |
| 0.0 | 0.19 |
| 0.0 | 0.19 |
| 0.0 | 0.19 |
| 0.0 | 0.19 |
| 0.0 | 0.19 |
| 0.0 | 0.191 |
| 0.0 | 0.191 |
| 0.0 | 0.191 |
| 0.0 | 0.191 |
| 0.0 | 0.191 |
| 0.0 | 0.191 |
| 0.0 | 0.191 |
| 0.0 | 0.191 |
| 0.0 | 0.191 |
| 0.0 | 0.191 |
| 0.0 | 0.192 |
| 0.0 | 0.192 |
| 0.0 | 0.192 |
| 0.0 | 0.192 |
| 0.0 | 0.192 |
| 0.0 | 0.192 |
| 0.0 | 0.192 |
| 0.0 | 0.192 |
| 0.0 | 0.192 |
| 0.0 | 0.192 |
| 0.0 | 0.193 |
| 0.0 | 0.193 |
| 0.0 | 0.193 |
| 0.0 | 0.193 |
| 0.0 | 0.193 |
| 0.0 | 0.193 |
| 0.0 | 0.193 |
| 0.0 | 0.193 |
| 0.0 | 0.193 |
| 0.0 | 0.193 |
| 0.0 | 0.194 |
| 0.0 | 0.194 |
| 0.0 | 0.194 |
| 0.0 | 0.194 |
| 0.0 | 0.194 |
| 0.0 | 0.194 |
| 0.0 | 0.194 |
| 0.0 | 0.194 |
| 0.0 | 0.194 |
| 0.0 | 0.194 |
| 0.0 | 0.195 |
| 0.0 | 0.195 |
| 0.0 | 0.195 |
| 0.0 | 0.195 |
| 0.0 | 0.195 |
| 0.0 | 0.195 |
| 0.0 | 0.195 |
| 0.0 | 0.195 |
| 0.0 | 0.195 |
| 0.0 | 0.195 |
| 0.0 | 0.196 |
| 0.0 | 0.196 |
| 0.0 | 0.196 |
| 0.0 | 0.196 |
| 0.0 | 0.196 |
| 0.0 | 0.196 |
| 0.0 | 0.196 |
| 0.0 | 0.196 |
| 0.0 | 0.196 |
| 0.0 | 0.196 |
| 0.0 | 0.197 |
| 0.0 | 0.197 |
| 0.0 | 0.197 |
| 0.0 | 0.197 |
| 0.0 | 0.197 |
| 0.0 | 0.197 |
| 0.0 | 0.197 |
| 0.0 | 0.197 |
| 0.0 | 0.197 |
| 0.0 | 0.197 |
| 0.0 | 0.198 |
| 0.0 | 0.198 |
| 0.0 | 0.198 |
| 0.0 | 0.198 |
| 0.0 | 0.198 |
| 0.0 | 0.198 |
| 0.0 | 0.198 |
| 0.0 | 0.198 |
| 0.0 | 0.198 |
| 0.0 | 0.198 |
| 0.0 | 0.199 |
| 0.0 | 0.199 |
| 0.0 | 0.199 |
| 0.0 | 0.199 |
| 0.0 | 0.199 |
| 0.0 | 0.199 |
| 0.0 | 0.199 |
| 0.0 | 0.199 |
| 0.0 | 0.199 |
| 0.0 | 0.199 |
| 0.0 | 0.2 |
| 0.0 | 0.2 |
| 0.0 | 0.2 |
| 0.0 | 0.2 |
| 0.0 | 0.2 |
| 0.0 | 0.2 |
| 0.0 | 0.2 |
| 0.0 | 0.2 |
| 0.0 | 0.2 |
| 0.0 | 0.2 |
| 0.0 | 0.201 |
| 0.0 | 0.201 |
| 0.0 | 0.201 |
| 0.0 | 0.201 |
| 0.0 | 0.201 |
| 0.0 | 0.201 |
| 0.0 | 0.201 |
| 0.0 | 0.201 |
| 0.0 | 0.201 |
| 0.0 | 0.201 |
| 0.0 | 0.202 |
| 0.0 | 0.202 |
| 0.0 | 0.202 |
| 0.0 | 0.202 |
| 0.0 | 0.202 |
| 0.0 | 0.202 |
| 0.0 | 0.202 |
| 0.0 | 0.202 |
| 0.0 | 0.202 |
| 0.0 | 0.202 |
| 0.0 | 0.203 |
| 0.0 | 0.203 |
| 0.0 | 0.203 |
| 0.0 | 0.203 |
| 0.0 | 0.203 |
| 0.0 | 0.203 |
| 0.0 | 0.203 |
| 0.0 | 0.203 |
| 0.0 | 0.203 |
| 0.0 | 0.203 |
| 0.0 | 0.204 |
| 0.0 | 0.204 |
| 0.0 | 0.204 |
| 0.0 | 0.204 |
| 0.0 | 0.204 |
| 0.0 | 0.204 |
| 0.0 | 0.204 |
| 0.0 | 0.204 |
| 0.0 | 0.204 |
| 0.0 | 0.204 |
| 0.0 | 0.205 |
| 0.0 | 0.205 |
| 0.0 | 0.205 |
| 0.0 | 0.205 |
| 0.0 | 0.205 |
| 0.0 | 0.205 |
| 0.0 | 0.205 |
| 0.0 | 0.205 |
| 0.0 | 0.205 |
| 0.0 | 0.205 |
| 0.0 | 0.206 |
| 0.0 | 0.206 |
| 0.0 | 0.206 |
| 0.0 | 0.206 |
| 0.0 | 0.206 |
| 0.0 | 0.206 |
| 0.0 | 0.206 |
| 0.0 | 0.206 |
| 0.0 | 0.206 |
| 0.0 | 0.206 |
| 0.0 | 0.207 |
| 0.0 | 0.207 |
| 0.0 | 0.207 |
| 0.0 | 0.207 |
| 0.0 | 0.207 |
| 0.0 | 0.207 |
| 0.0 | 0.207 |
| 0.0 | 0.207 |
| 0.0 | 0.207 |
| 0.0 | 0.207 |
| 0.0 | 0.208 |
| 0.0 | 0.208 |
| 0.0 | 0.208 |
| 0.0 | 0.208 |
| 0.0 | 0.208 |
| 0.0 | 0.208 |
| 0.0 | 0.208 |
| 0.0 | 0.208 |
| 0.0 | 0.208 |
| 0.0 | 0.208 |
| 0.0 | 0.209 |
| 0.0 | 0.209 |
| 0.0 | 0.209 |
| 0.0 | 0.209 |
| 0.0 | 0.209 |
| 0.0 | 0.209 |
| 0.0 | 0.209 |
| 0.0 | 0.209 |
| 0.0 | 0.209 |
| 0.0 | 0.209 |
| 0.0 | 0.21 |
| 0.0 | 0.21 |
| 0.0 | 0.21 |
| 0.0 | 0.21 |
| 0.0 | 0.21 |
| 0.0 | 0.21 |
| 0.0 | 0.21 |
| 0.0 | 0.21 |
| 0.0 | 0.21 |
| 0.0 | 0.21 |
| 0.0 | 0.211 |
| 0.0 | 0.211 |
| 0.0 | 0.211 |
| 0.0 | 0.211 |
| 0.0 | 0.211 |
| 0.0 | 0.211 |
| 0.0 | 0.211 |
| 0.0 | 0.211 |
| 0.0 | 0.211 |
| 0.0 | 0.211 |
| 0.0 | 0.212 |
| 0.0 | 0.212 |
| 0.0 | 0.212 |
| 0.0 | 0.212 |
| 0.0 | 0.212 |
| 0.0 | 0.212 |
| 0.0 | 0.212 |
| 0.0 | 0.212 |
| 0.0 | 0.212 |
| 0.0 | 0.212 |
| 0.0 | 0.213 |
| 0.0 | 0.213 |
| 0.0 | 0.213 |
| 0.0 | 0.213 |
| 0.0 | 0.213 |
| 0.0 | 0.213 |
| 0.0 | 0.213 |
| 0.0 | 0.213 |
| 0.0 | 0.213 |
| 0.0 | 0.213 |
| 0.0 | 0.214 |
| 0.0 | 0.214 |
| 0.0 | 0.214 |
| 0.0 | 0.214 |
| 0.0 | 0.214 |
| 0.0 | 0.214 |
| 0.0 | 0.214 |
| 0.0 | 0.214 |
| 0.0 | 0.214 |
| 0.0 | 0.214 |
| 0.0 | 0.215 |
| 0.0 | 0.215 |
| 0.0 | 0.215 |
| 0.0 | 0.215 |
| 0.0 | 0.215 |
| 0.0 | 0.215 |
| 0.0 | 0.215 |
| 0.0 | 0.215 |
| 0.0 | 0.215 |
| 0.0 | 0.215 |
| 0.0 | 0.216 |
| 0.0 | 0.216 |
| 0.0 | 0.216 |
| 0.0 | 0.216 |
| 0.0 | 0.216 |
| 0.0 | 0.216 |
| 0.0 | 0.216 |
| 0.0 | 0.216 |
| 0.0 | 0.216 |
| 0.0 | 0.216 |
| 0.0 | 0.217 |
| 0.0 | 0.217 |
| 0.0 | 0.217 |
| 0.0 | 0.217 |
| 0.0 | 0.217 |
| 0.0 | 0.217 |
| 0.0 | 0.217 |
| 0.0 | 0.217 |
| 0.0 | 0.217 |
| 0.0 | 0.217 |
| 0.0 | 0.218 |
| 0.0 | 0.218 |
| 0.0 | 0.218 |
| 0.0 | 0.218 |
| 0.0 | 0.218 |
| 0.0 | 0.218 |
| 0.0 | 0.218 |
| 0.0 | 0.218 |
| 0.0 | 0.218 |
| 0.0 | 0.218 |
| 0.0 | 0.219 |
| 0.0 | 0.219 |
| 0.0 | 0.219 |
| 0.0 | 0.219 |
| 0.0 | 0.219 |
| 0.0 | 0.219 |
| 0.0 | 0.219 |
| 0.0 | 0.219 |
| 0.0 | 0.219 |
| 0.0 | 0.219 |
| 0.0 | 0.22 |
| 0.0 | 0.22 |
| 0.0 | 0.22 |
| 0.0 | 0.22 |
| 0.0 | 0.22 |
| 0.0 | 0.22 |
| 0.0 | 0.22 |
| 0.0 | 0.22 |
| 0.0 | 0.22 |
| 0.0 | 0.22 |
| 0.0 | 0.221 |
| 0.0 | 0.221 |
| 0.0 | 0.221 |
| 0.0 | 0.221 |
| 0.0 | 0.221 |
| 0.0 | 0.221 |
| 0.0 | 0.221 |
| 0.0 | 0.221 |
| 0.0 | 0.221 |
| 0.0 | 0.221 |
| 0.0 | 0.222 |
| 0.0 | 0.222 |
| 0.0 | 0.222 |
| 0.0 | 0.222 |
| 0.0 | 0.222 |
| 0.0 | 0.222 |
| 0.0 | 0.222 |
| 0.0 | 0.222 |
| 0.0 | 0.222 |
| 0.0 | 0.222 |
| 0.0 | 0.223 |
| 0.0 | 0.223 |
| 0.0 | 0.223 |
| 0.0 | 0.223 |
| 0.0 | 0.223 |
| 0.0 | 0.223 |
| 0.0 | 0.223 |
| 0.0 | 0.223 |
| 0.0 | 0.223 |
| 0.0 | 0.223 |
| 0.0 | 0.224 |
| 0.0 | 0.224 |
| 0.0 | 0.224 |
| 0.0 | 0.224 |
| 0.0 | 0.224 |
| 0.0 | 0.224 |
| 0.0 | 0.224 |
| 0.0 | 0.224 |
| 0.0 | 0.224 |
| 0.0 | 0.224 |
| 0.0 | 0.225 |
| 0.0 | 0.225 |
| 0.0 | 0.225 |
| 0.0 | 0.225 |
| 0.0 | 0.225 |
| 0.0 | 0.225 |
| 0.0 | 0.225 |
| 0.0 | 0.225 |
| 0.0 | 0.225 |
| 0.0 | 0.225 |
| 0.0 | 0.226 |
| 0.0 | 0.226 |
| 0.0 | 0.226 |
| 0.0 | 0.226 |
| 0.0 | 0.226 |
| 0.0 | 0.226 |
| 0.0 | 0.226 |
| 0.0 | 0.226 |
| 0.0 | 0.226 |
| 0.0 | 0.226 |
| 0.0 | 0.227 |
| 0.0 | 0.227 |
| 0.0 | 0.227 |
| 0.0 | 0.227 |
| 0.0 | 0.227 |
| 0.0 | 0.227 |
| 0.0 | 0.227 |
| 0.0 | 0.227 |
| 0.0 | 0.227 |
| 0.0 | 0.227 |
| 0.0 | 0.228 |
| 0.0 | 0.228 |
| 0.0 | 0.228 |
| 0.0 | 0.228 |
| 0.0 | 0.228 |
| 0.0 | 0.228 |
| 0.0 | 0.228 |
| 0.0 | 0.228 |
| 0.0 | 0.228 |
| 0.0 | 0.228 |
| 0.0 | 0.229 |
| 0.0 | 0.229 |
| 0.0 | 0.229 |
| 0.0 | 0.229 |
| 0.0 | 0.229 |
| 0.0 | 0.229 |
| 0.0 | 0.229 |
| 0.0 | 0.229 |
| 0.0 | 0.229 |
| 0.0 | 0.229 |
| 0.0 | 0.23 |
| 0.0 | 0.23 |
| 0.0 | 0.23 |
| 0.0 | 0.23 |
| 0.0 | 0.23 |
| 0.0 | 0.23 |
| 0.0 | 0.23 |
| 0.0 | 0.23 |
| 0.0 | 0.23 |
| 0.0 | 0.23 |
| 0.0 | 0.231 |
| 0.0 | 0.231 |
| 0.0 | 0.231 |
| 0.0 | 0.231 |
| 0.0 | 0.231 |
| 0.0 | 0.231 |
| 0.0 | 0.231 |
| 0.0 | 0.231 |
| 0.0 | 0.231 |
| 0.0 | 0.231 |
| 0.0 | 0.232 |
| 0.0 | 0.232 |
| 0.0 | 0.232 |
| 0.0 | 0.232 |
| 0.0 | 0.232 |
| 0.0 | 0.232 |
| 0.0 | 0.232 |
| 0.0 | 0.232 |
| 0.0 | 0.232 |
| 0.0 | 0.232 |
| 0.0 | 0.233 |
| 0.0 | 0.233 |
| 0.0 | 0.233 |
| 0.0 | 0.233 |
| 0.0 | 0.233 |
| 0.0 | 0.233 |
| 0.0 | 0.233 |
| 0.0 | 0.233 |
| 0.0 | 0.233 |
| 0.0 | 0.233 |
| 0.0 | 0.234 |
| 0.0 | 0.234 |
| 0.0 | 0.234 |
| 0.0 | 0.234 |
| 0.0 | 0.234 |
| 0.0 | 0.234 |
| 0.0 | 0.234 |
| 0.0 | 0.234 |
| 0.0 | 0.234 |
| 0.0 | 0.234 |
| 0.0 | 0.235 |
| 0.0 | 0.235 |
| 0.0 | 0.235 |
| 0.0 | 0.235 |
| 0.0 | 0.235 |
| 0.0 | 0.235 |
| 0.0 | 0.235 |
| 0.0 | 0.235 |
| 0.0 | 0.235 |
| 0.0 | 0.235 |
| 0.0 | 0.236 |
| 0.0 | 0.236 |
| 0.0 | 0.236 |
| 0.0 | 0.236 |
| 0.0 | 0.236 |
| 0.0 | 0.236 |
| 0.0 | 0.236 |
| 0.0 | 0.236 |
| 0.0 | 0.236 |
| 0.0 | 0.236 |
| 0.0 | 0.237 |
| 0.0 | 0.237 |
| 0.0 | 0.237 |
| 0.0 | 0.237 |
| 0.0 | 0.237 |
| 0.0 | 0.237 |
| 0.0 | 0.237 |
| 0.0 | 0.237 |
| 0.0 | 0.237 |
| 0.0 | 0.237 |
| 0.0 | 0.238 |
| 0.0 | 0.238 |
| 0.0 | 0.238 |
| 0.0 | 0.238 |
| 0.0 | 0.238 |
| 0.0 | 0.238 |
| 0.0 | 0.238 |
| 0.0 | 0.238 |
| 0.0 | 0.238 |
| 0.0 | 0.238 |
| 0.0 | 0.239 |
| 0.0 | 0.239 |
| 0.0 | 0.239 |
| 0.0 | 0.239 |
| 0.0 | 0.239 |
| 0.0 | 0.239 |
| 0.0 | 0.239 |
| 0.0 | 0.239 |
| 0.0 | 0.239 |
| 0.0 | 0.239 |
| 0.0 | 0.24 |
| 0.0 | 0.24 |
| 0.0 | 0.24 |
| 0.0 | 0.24 |
| 0.0 | 0.24 |
| 0.0 | 0.24 |
| 0.0 | 0.24 |
| 0.0 | 0.24 |
| 0.0 | 0.24 |
| 0.0 | 0.24 |
| 0.0 | 0.241 |
| 0.0 | 0.241 |
| 0.0 | 0.241 |
| 0.0 | 0.241 |
| 0.0 | 0.241 |
| 0.0 | 0.241 |
| 0.0 | 0.241 |
| 0.0 | 0.241 |
| 0.0 | 0.241 |
| 0.0 | 0.241 |
| 0.0 | 0.242 |
| 0.0 | 0.242 |
| 0.0 | 0.242 |
| 0.0 | 0.242 |
| 0.0 | 0.242 |
| 0.0 | 0.242 |
| 0.0 | 0.242 |
| 0.0 | 0.242 |
| 0.0 | 0.242 |
| 0.0 | 0.242 |
| 0.0 | 0.243 |
| 0.0 | 0.243 |
| 0.0 | 0.243 |
| 0.0 | 0.243 |
| 0.0 | 0.243 |
| 0.0 | 0.243 |
| 0.0 | 0.243 |
| 0.0 | 0.243 |
| 0.0 | 0.243 |
| 0.0 | 0.243 |
| 0.0 | 0.244 |
| 0.0 | 0.244 |
| 0.0 | 0.244 |
| 0.0 | 0.244 |
| 0.0 | 0.244 |
| 0.0 | 0.244 |
| 0.0 | 0.244 |
| 0.0 | 0.244 |
| 0.0 | 0.244 |
| 0.0 | 0.244 |
| 0.0 | 0.245 |
| 0.0 | 0.245 |
| 0.0 | 0.245 |
| 0.0 | 0.245 |
| 0.0 | 0.245 |
| 0.0 | 0.245 |
| 0.0 | 0.245 |
| 0.0 | 0.245 |
| 0.0 | 0.245 |
| 0.0 | 0.245 |
| 0.0 | 0.246 |
| 0.0 | 0.246 |
| 0.0 | 0.246 |
| 0.0 | 0.246 |
| 0.0 | 0.246 |
| 0.0 | 0.246 |
| 0.0 | 0.246 |
| 0.0 | 0.246 |
| 0.0 | 0.246 |
| 0.0 | 0.246 |
| 0.0 | 0.247 |
| 0.0 | 0.247 |
| 0.0 | 0.247 |
| 0.0 | 0.247 |
| 0.0 | 0.247 |
| 0.0 | 0.247 |
| 0.0 | 0.247 |
| 0.0 | 0.247 |
| 0.0 | 0.247 |
| 0.0 | 0.247 |
| 0.0 | 0.248 |
| 0.0 | 0.248 |
| 0.0 | 0.248 |
| 0.0 | 0.248 |
| 0.0 | 0.248 |
| 0.0 | 0.248 |
| 0.0 | 0.248 |
| 0.0 | 0.248 |
| 0.0 | 0.248 |
| 0.0 | 0.248 |
| 0.0 | 0.249 |
| 0.0 | 0.249 |
| 0.0 | 0.249 |
| 0.0 | 0.249 |
| 0.0 | 0.249 |
| 0.0 | 0.249 |
| 0.0 | 0.249 |
| 0.0 | 0.249 |
| 0.0 | 0.249 |
| 0.0 | 0.249 |
| 0.0 | 0.25 |
| 0.0 | 0.25 |
| 0.0 | 0.25 |
| 0.0 | 0.25 |
| 0.0 | 0.25 |
| 0.0 | 0.25 |
| 0.0 | 0.25 |
| 0.0 | 0.25 |
| 0.0 | 0.25 |
| 0.0 | 0.25 |
| 0.0 | 0.251 |
| 0.0 | 0.251 |
| 0.0 | 0.251 |
| 0.0 | 0.251 |
| 0.0 | 0.251 |
| 0.0 | 0.251 |
| 0.0 | 0.251 |
| 0.0 | 0.251 |
| 0.0 | 0.251 |
| 0.0 | 0.251 |
| 0.0 | 0.252 |
| 0.0 | 0.252 |
| 0.0 | 0.252 |
| 0.0 | 0.252 |
| 0.0 | 0.252 |
| 0.0 | 0.252 |
| 0.0 | 0.252 |
| 0.0 | 0.252 |
| 0.0 | 0.252 |
| 0.0 | 0.252 |
| 0.0 | 0.253 |
| 0.0 | 0.253 |
| 0.0 | 0.253 |
| 0.0 | 0.253 |
| 0.0 | 0.253 |
| 0.0 | 0.253 |
| 0.0 | 0.253 |
| 0.0 | 0.253 |
| 0.0 | 0.253 |
| 0.0 | 0.253 |
| 0.0 | 0.254 |
| 0.0 | 0.254 |
| 0.0 | 0.254 |
| 0.0 | 0.254 |
| 0.0 | 0.254 |
| 0.0 | 0.254 |
| 0.0 | 0.254 |
| 0.0 | 0.254 |
| 0.0 | 0.254 |
| 0.0 | 0.254 |
| 0.0 | 0.255 |
| 0.0 | 0.255 |
| 0.0 | 0.255 |
| 0.0 | 0.255 |
| 0.0 | 0.255 |
| 0.0 | 0.255 |
| 0.0 | 0.255 |
| 0.0 | 0.255 |
| 0.0 | 0.255 |
| 0.0 | 0.255 |
| 0.0 | 0.256 |
| 0.0 | 0.256 |
| 0.0 | 0.256 |
| 0.0 | 0.256 |
| 0.0 | 0.256 |
| 0.0 | 0.256 |
| 0.0 | 0.256 |
| 0.0 | 0.256 |
| 0.0 | 0.256 |
| 0.0 | 0.256 |
| 0.0 | 0.257 |
| 0.0 | 0.257 |
| 0.0 | 0.257 |
| 0.0 | 0.257 |
| 0.0 | 0.257 |
| 0.0 | 0.257 |
| 0.0 | 0.257 |
| 0.0 | 0.257 |
| 0.0 | 0.257 |
| 0.0 | 0.257 |
| 0.0 | 0.258 |
| 0.0 | 0.258 |
| 0.0 | 0.258 |
| 0.0 | 0.258 |
| 0.0 | 0.258 |
| 0.0 | 0.258 |
| 0.0 | 0.258 |
| 0.0 | 0.258 |
| 0.0 | 0.258 |
| 0.0 | 0.258 |
| 0.0 | 0.259 |
| 0.0 | 0.259 |
| 0.0 | 0.259 |
| 0.0 | 0.259 |
| 0.0 | 0.259 |
| 0.0 | 0.259 |
| 0.0 | 0.259 |
| 0.0 | 0.259 |
| 0.0 | 0.259 |
| 0.0 | 0.259 |
| 0.0 | 0.26 |
| 0.0 | 0.26 |
| 0.0 | 0.26 |
| 0.0 | 0.26 |
| 0.0 | 0.26 |
| 0.0 | 0.26 |
| 0.0 | 0.26 |
| 0.0 | 0.26 |
| 0.0 | 0.26 |
| 0.0 | 0.26 |
| 0.0 | 0.261 |
| 0.0 | 0.261 |
| 0.0 | 0.261 |
| 0.0 | 0.261 |
| 0.0 | 0.261 |
| 0.0 | 0.261 |
| 0.0 | 0.261 |
| 0.0 | 0.261 |
| 0.0 | 0.261 |
| 0.0 | 0.261 |
| 0.0 | 0.262 |
| 0.0 | 0.262 |
| 0.0 | 0.262 |
| 0.0 | 0.262 |
| 0.0 | 0.262 |
| 0.0 | 0.262 |
| 0.0 | 0.262 |
| 0.0 | 0.262 |
| 0.0 | 0.262 |
| 0.0 | 0.262 |
| 0.0 | 0.263 |
| 0.0 | 0.263 |
| 0.0 | 0.263 |
| 0.0 | 0.263 |
| 0.0 | 0.263 |
| 0.0 | 0.263 |
| 0.0 | 0.263 |
| 0.0 | 0.263 |
| 0.0 | 0.263 |
| 0.0 | 0.263 |
| 0.0 | 0.264 |
| 0.0 | 0.264 |
| 0.0 | 0.264 |
| 0.0 | 0.264 |
| 0.0 | 0.264 |
| 0.0 | 0.264 |
| 0.0 | 0.264 |
| 0.0 | 0.264 |
| 0.0 | 0.264 |
| 0.0 | 0.264 |
| 0.0 | 0.265 |
| 0.0 | 0.265 |
| 0.0 | 0.265 |
| 0.0 | 0.265 |
| 0.0 | 0.265 |
| 0.0 | 0.265 |
| 0.0 | 0.265 |
| 0.0 | 0.265 |
| 0.0 | 0.265 |
| 0.0 | 0.265 |
| 0.0 | 0.266 |
| 0.0 | 0.266 |
| 0.0 | 0.266 |
| 0.0 | 0.266 |
| 0.0 | 0.266 |
| 0.0 | 0.266 |
| 0.0 | 0.266 |
| 0.0 | 0.266 |
| 0.0 | 0.266 |
| 0.0 | 0.266 |
| 0.0 | 0.267 |
| 0.0 | 0.267 |
| 0.0 | 0.267 |
| 0.0 | 0.267 |
| 0.0 | 0.267 |
| 0.0 | 0.267 |
| 0.0 | 0.267 |
| 0.0 | 0.267 |
| 0.0 | 0.267 |
| 0.0 | 0.267 |
| 0.0 | 0.268 |
| 0.0 | 0.268 |
| 0.0 | 0.268 |
| 0.0 | 0.268 |
| 0.0 | 0.268 |
| 0.0 | 0.268 |
| 0.0 | 0.268 |
| 0.0 | 0.268 |
| 0.0 | 0.268 |
| 0.0 | 0.268 |
| 0.0 | 0.269 |
| 0.0 | 0.269 |
| 0.0 | 0.269 |
| 0.0 | 0.269 |
| 0.0 | 0.269 |
| 0.0 | 0.269 |
| 0.0 | 0.269 |
| 0.0 | 0.269 |
| 0.0 | 0.269 |
| 0.0 | 0.269 |
| 0.0 | 0.27 |
| 0.0 | 0.27 |
| 0.0 | 0.27 |
| 0.0 | 0.27 |
| 0.0 | 0.27 |
| 0.0 | 0.27 |
| 0.0 | 0.27 |
| 0.0 | 0.27 |
| 0.0 | 0.27 |
| 0.0 | 0.27 |
| 0.0 | 0.271 |
| 0.0 | 0.271 |
| 0.0 | 0.271 |
| 0.0 | 0.271 |
| 0.0 | 0.271 |
| 0.0 | 0.271 |
| 0.0 | 0.271 |
| 0.0 | 0.271 |
| 0.0 | 0.271 |
| 0.0 | 0.271 |
| 0.0 | 0.272 |
| 0.0 | 0.272 |
| 0.0 | 0.272 |
| 0.0 | 0.272 |
| 0.0 | 0.272 |
| 0.0 | 0.272 |
| 0.0 | 0.272 |
| 0.0 | 0.272 |
| 0.0 | 0.272 |
| 0.0 | 0.272 |
| 0.0 | 0.273 |
| 0.0 | 0.273 |
| 0.0 | 0.273 |
| 0.0 | 0.273 |
| 0.0 | 0.273 |
| 0.0 | 0.273 |
| 0.0 | 0.273 |
| 0.0 | 0.273 |
| 0.0 | 0.273 |
| 0.0 | 0.273 |
| 0.0 | 0.274 |
| 0.0 | 0.274 |
| 0.0 | 0.274 |
| 0.0 | 0.274 |
| 0.0 | 0.274 |
| 0.0 | 0.274 |
| 0.0 | 0.274 |
| 0.0 | 0.274 |
| 0.0 | 0.274 |
| 0.0 | 0.274 |
| 0.0 | 0.275 |
| 0.0 | 0.275 |
| 0.0 | 0.275 |
| 0.0 | 0.275 |
| 0.0 | 0.275 |
| 0.0 | 0.275 |
| 0.0 | 0.275 |
| 0.0 | 0.275 |
| 0.0 | 0.275 |
| 0.0 | 0.275 |
| 0.0 | 0.276 |
| 0.0 | 0.276 |
| 0.0 | 0.276 |
| 0.0 | 0.276 |
| 0.0 | 0.276 |
| 0.0 | 0.276 |
| 0.0 | 0.276 |
| 0.0 | 0.276 |
| 0.0 | 0.276 |
| 0.0 | 0.276 |
| 0.0 | 0.277 |
| 0.0 | 0.277 |
| 0.0 | 0.277 |
| 0.0 | 0.277 |
| 0.0 | 0.277 |
| 0.0 | 0.277 |
| 0.0 | 0.277 |
| 0.0 | 0.277 |
| 0.0 | 0.277 |
| 0.0 | 0.277 |
| 0.0 | 0.278 |
| 0.0 | 0.278 |
| 0.0 | 0.278 |
| 0.0 | 0.278 |
| 0.0 | 0.278 |
| 0.0 | 0.278 |
| 0.0 | 0.278 |
| 0.0 | 0.278 |
| 0.0 | 0.278 |
| 0.0 | 0.278 |
| 0.0 | 0.279 |
| 0.0 | 0.279 |
| 0.0 | 0.279 |
| 0.0 | 0.279 |
| 0.0 | 0.279 |
| 0.0 | 0.279 |
| 0.0 | 0.279 |
| 0.0 | 0.279 |
| 0.0 | 0.279 |
| 0.0 | 0.279 |
| 0.0 | 0.28 |
| 0.0 | 0.28 |
| 0.0 | 0.28 |
| 0.0 | 0.28 |
| 0.0 | 0.28 |
| 0.0 | 0.28 |
| 0.0 | 0.28 |
| 0.0 | 0.28 |
| 0.0 | 0.28 |
| 0.0 | 0.28 |
| 0.0 | 0.281 |
| 0.0 | 0.281 |
| 0.0 | 0.281 |
| 0.0 | 0.281 |
| 0.0 | 0.281 |
| 0.0 | 0.281 |
| 0.0 | 0.281 |
| 0.0 | 0.281 |
| 0.0 | 0.281 |
| 0.0 | 0.281 |
| 0.0 | 0.282 |
| 0.0 | 0.282 |
| 0.0 | 0.282 |
| 0.0 | 0.282 |
| 0.0 | 0.282 |
| 0.0 | 0.282 |
| 0.0 | 0.282 |
| 0.0 | 0.282 |
| 0.0 | 0.282 |
| 0.0 | 0.282 |
| 0.0 | 0.283 |
| 0.0 | 0.283 |
| 0.0 | 0.283 |
| 0.0 | 0.283 |
| 0.0 | 0.283 |
| 0.0 | 0.283 |
| 0.0 | 0.283 |
| 0.0 | 0.283 |
| 0.0 | 0.283 |
| 0.0 | 0.283 |
| 0.0 | 0.284 |
| 0.0 | 0.284 |
| 0.0 | 0.284 |
| 0.0 | 0.284 |
| 0.0 | 0.284 |
| 0.0 | 0.284 |
| 0.0 | 0.284 |
| 0.0 | 0.284 |
| 0.0 | 0.284 |
| 0.0 | 0.284 |
| 0.0 | 0.285 |
| 0.0 | 0.285 |
| 0.0 | 0.285 |
| 0.0 | 0.285 |
| 0.0 | 0.285 |
| 0.0 | 0.285 |
| 0.0 | 0.285 |
| 0.0 | 0.285 |
| 0.0 | 0.285 |
| 0.0 | 0.285 |
| 0.0 | 0.286 |
| 0.0 | 0.286 |
| 0.0 | 0.286 |
| 0.0 | 0.286 |
| 0.0 | 0.286 |
| 0.0 | 0.286 |
| 0.0 | 0.286 |
| 0.0 | 0.286 |
| 0.0 | 0.286 |
| 0.0 | 0.286 |
| 0.0 | 0.287 |
| 0.0 | 0.287 |
| 0.0 | 0.287 |
| 0.0 | 0.287 |
| 0.0 | 0.287 |
| 0.0 | 0.287 |
| 0.0 | 0.287 |
| 0.0 | 0.287 |
| 0.0 | 0.287 |
| 0.0 | 0.287 |
| 0.0 | 0.288 |
| 0.0 | 0.288 |
| 0.0 | 0.288 |
| 0.0 | 0.288 |
| 0.0 | 0.288 |
| 0.0 | 0.288 |
| 0.0 | 0.288 |
| 0.0 | 0.288 |
| 0.0 | 0.288 |
| 0.0 | 0.288 |
| 0.0 | 0.289 |
| 0.0 | 0.289 |
| 0.0 | 0.289 |
| 0.0 | 0.289 |
| 0.0 | 0.289 |
| 0.0 | 0.289 |
| 0.0 | 0.289 |
| 0.0 | 0.289 |
| 0.0 | 0.289 |
| 0.0 | 0.289 |
| 0.0 | 0.29 |
| 0.0 | 0.29 |
| 0.0 | 0.29 |
| 0.0 | 0.29 |
| 0.0 | 0.29 |
| 0.0 | 0.29 |
| 0.0 | 0.29 |
| 0.0 | 0.29 |
| 0.0 | 0.29 |
| 0.0 | 0.29 |
| 0.0 | 0.291 |
| 0.0 | 0.291 |
| 0.0 | 0.291 |
| 0.0 | 0.291 |
| 0.0 | 0.291 |
| 0.0 | 0.291 |
| 0.0 | 0.291 |
| 0.0 | 0.291 |
| 0.0 | 0.291 |
| 0.0 | 0.291 |
| 0.0 | 0.292 |
| 0.0 | 0.292 |
| 0.0 | 0.292 |
| 0.0 | 0.292 |
| 0.0 | 0.292 |
| 0.0 | 0.292 |
| 0.0 | 0.292 |
| 0.0 | 0.292 |
| 0.0 | 0.292 |
| 0.0 | 0.292 |
| 0.0 | 0.293 |
| 0.0 | 0.293 |
| 0.0 | 0.293 |
| 0.0 | 0.293 |
| 0.0 | 0.293 |
| 0.0 | 0.293 |
| 0.0 | 0.293 |
| 0.0 | 0.293 |
| 0.0 | 0.293 |
| 0.0 | 0.293 |
| 0.0 | 0.294 |
| 0.0 | 0.294 |
| 0.0 | 0.294 |
| 0.0 | 0.294 |
| 0.0 | 0.294 |
| 0.0 | 0.294 |
| 0.0 | 0.294 |
| 0.0 | 0.294 |
| 0.0 | 0.294 |
| 0.0 | 0.294 |
| 0.0 | 0.295 |
| 0.0 | 0.295 |
| 0.0 | 0.295 |
| 0.0 | 0.295 |
| 0.0 | 0.295 |
| 0.0 | 0.295 |
| 0.0 | 0.295 |
| 0.0 | 0.295 |
| 0.0 | 0.295 |
| 0.0 | 0.295 |
| 0.0 | 0.296 |
| 0.0 | 0.296 |
| 0.0 | 0.296 |
| 0.0 | 0.296 |
| 0.0 | 0.296 |
| 0.0 | 0.296 |
| 0.0 | 0.296 |
| 0.0 | 0.296 |
| 0.0 | 0.296 |
| 0.0 | 0.296 |
| 0.0 | 0.297 |
| 0.0 | 0.297 |
| 0.0 | 0.297 |
| 0.0 | 0.297 |
| 0.0 | 0.297 |
| 0.0 | 0.297 |
| 0.0 | 0.297 |
| 0.0 | 0.297 |
| 0.0 | 0.297 |
| 0.0 | 0.297 |
| 0.0 | 0.298 |
| 0.0 | 0.298 |
| 0.0 | 0.298 |
| 0.0 | 0.298 |
| 0.0 | 0.298 |
| 0.0 | 0.298 |
| 0.0 | 0.298 |
| 0.0 | 0.298 |
| 0.0 | 0.298 |
| 0.0 | 0.298 |
| 0.0 | 0.299 |
| 0.0 | 0.299 |
| 0.0 | 0.299 |
| 0.0 | 0.299 |
| 0.0 | 0.299 |
| 0.0 | 0.299 |
| 0.0 | 0.299 |
| 0.0 | 0.299 |
| 0.0 | 0.299 |
| 0.0 | 0.299 |
| 0.0 | 0.3 |
| 0.0 | 0.3 |
| 0.0 | 0.3 |
| 0.0 | 0.3 |
| 0.0 | 0.3 |
| 0.0 | 0.3 |
| 0.0 | 0.3 |
| 0.0 | 0.3 |
| 0.0 | 0.3 |
| 0.0 | 0.3 |
| 0.0 | 0.301 |
| 0.0 | 0.301 |
| 0.0 | 0.301 |
| 0.0 | 0.301 |
| 0.0 | 0.301 |
| 0.0 | 0.301 |
| 0.0 | 0.301 |
| 0.0 | 0.301 |
| 0.0 | 0.301 |
| 0.0 | 0.301 |
| 0.0 | 0.302 |
| 0.0 | 0.302 |
| 0.0 | 0.302 |
| 0.0 | 0.302 |
| 0.0 | 0.302 |
| 0.0 | 0.302 |
| 0.0 | 0.302 |
| 0.0 | 0.302 |
| 0.0 | 0.302 |
| 0.0 | 0.302 |
| 0.0 | 0.303 |
| 0.0 | 0.303 |
| 0.0 | 0.303 |
| 0.0 | 0.303 |
| 0.0 | 0.303 |
| 0.0 | 0.303 |
| 0.0 | 0.303 |
| 0.0 | 0.303 |
| 0.0 | 0.303 |
| 0.0 | 0.303 |
| 0.0 | 0.304 |
| 0.0 | 0.304 |
| 0.0 | 0.304 |
| 0.0 | 0.304 |
| 0.0 | 0.304 |
| 0.0 | 0.304 |
| 0.0 | 0.304 |
| 0.0 | 0.304 |
| 0.0 | 0.304 |
| 0.0 | 0.304 |
| 0.0 | 0.305 |
| 0.0 | 0.305 |
| 0.0 | 0.305 |
| 0.0 | 0.305 |
| 0.0 | 0.305 |
| 0.0 | 0.305 |
| 0.0 | 0.305 |
| 0.0 | 0.305 |
| 0.0 | 0.305 |
| 0.0 | 0.305 |
| 0.0 | 0.306 |
| 0.0 | 0.306 |
| 0.0 | 0.306 |
| 0.0 | 0.306 |
| 0.0 | 0.306 |
| 0.0 | 0.306 |
| 0.0 | 0.306 |
| 0.0 | 0.306 |
| 0.0 | 0.306 |
| 0.0 | 0.306 |
| 0.0 | 0.307 |
| 0.0 | 0.307 |
| 0.0 | 0.307 |
| 0.0 | 0.307 |
| 0.0 | 0.307 |
| 0.0 | 0.307 |
| 0.0 | 0.307 |
| 0.0 | 0.307 |
| 0.0 | 0.307 |
| 0.0 | 0.307 |
| 0.0 | 0.308 |
| 0.0 | 0.308 |
| 0.0 | 0.308 |
| 0.0 | 0.308 |
| 0.0 | 0.308 |
| 0.0 | 0.308 |
| 0.0 | 0.308 |
| 0.0 | 0.308 |
| 0.0 | 0.308 |
| 0.0 | 0.308 |
| 0.0 | 0.309 |
| 0.0 | 0.309 |
| 0.0 | 0.309 |
| 0.0 | 0.309 |
| 0.0 | 0.309 |
| 0.0 | 0.309 |
| 0.0 | 0.309 |
| 0.0 | 0.309 |
| 0.0 | 0.309 |
| 0.0 | 0.309 |
| 0.0 | 0.31 |
| 0.0 | 0.31 |
| 0.0 | 0.31 |
| 0.0 | 0.31 |
| 0.0 | 0.31 |
| 0.0 | 0.31 |
| 0.0 | 0.31 |
| 0.0 | 0.31 |
| 0.0 | 0.31 |
| 0.0 | 0.31 |
| 0.0 | 0.311 |
| 0.0 | 0.311 |
| 0.0 | 0.311 |
| 0.0 | 0.311 |
| 0.0 | 0.311 |
| 0.0 | 0.311 |
| 0.0 | 0.311 |
| 0.0 | 0.311 |
| 0.0 | 0.311 |
| 0.0 | 0.311 |
| 0.0 | 0.312 |
| 0.0 | 0.312 |
| 0.0 | 0.312 |
| 0.0 | 0.312 |
| 0.0 | 0.312 |
| 0.0 | 0.312 |
| 0.0 | 0.312 |
| 0.0 | 0.312 |
| 0.0 | 0.312 |
| 0.0 | 0.312 |
| 0.0 | 0.313 |
| 0.0 | 0.313 |
| 0.0 | 0.313 |
| 0.0 | 0.313 |
| 0.0 | 0.313 |
| 0.0 | 0.313 |
| 0.0 | 0.313 |
| 0.0 | 0.313 |
| 0.0 | 0.313 |
| 0.0 | 0.313 |
| 0.0 | 0.314 |
| 0.0 | 0.314 |
| 0.0 | 0.314 |
| 0.0 | 0.314 |
| 0.0 | 0.314 |
| 0.0 | 0.314 |
| 0.0 | 0.314 |
| 0.0 | 0.314 |
| 0.0 | 0.314 |
| 0.0 | 0.314 |
| 0.0 | 0.315 |
| 0.0 | 0.315 |
| 0.0 | 0.315 |
| 0.0 | 0.315 |
| 0.0 | 0.315 |
| 0.0 | 0.315 |
| 0.0 | 0.315 |
| 0.0 | 0.315 |
| 0.0 | 0.315 |
| 0.0 | 0.315 |
| 0.0 | 0.316 |
| 0.0 | 0.316 |
| 0.0 | 0.316 |
| 0.0 | 0.316 |
| 0.0 | 0.316 |
| 0.0 | 0.316 |
| 0.0 | 0.316 |
| 0.0 | 0.316 |
| 0.0 | 0.316 |
| 0.0 | 0.316 |
| 0.0 | 0.317 |
| 0.0 | 0.317 |
| 0.0 | 0.317 |
| 0.0 | 0.317 |
| 0.0 | 0.317 |
| 0.0 | 0.317 |
| 0.0 | 0.317 |
| 0.0 | 0.317 |
| 0.0 | 0.317 |
| 0.0 | 0.317 |
| 0.0 | 0.318 |
| 0.0 | 0.318 |
| 0.0 | 0.318 |
| 0.0 | 0.318 |
| 0.0 | 0.318 |
| 0.0 | 0.318 |
| 0.0 | 0.318 |
| 0.0 | 0.318 |
| 0.0 | 0.318 |
| 0.0 | 0.318 |
| 0.0 | 0.319 |
| 0.0 | 0.319 |
| 0.0 | 0.319 |
| 0.0 | 0.319 |
| 0.0 | 0.319 |
| 0.0 | 0.319 |
| 0.0 | 0.319 |
| 0.0 | 0.319 |
| 0.0 | 0.319 |
| 0.0 | 0.319 |
| 0.0 | 0.32 |
| 0.0 | 0.32 |
| 0.0 | 0.32 |
| 0.0 | 0.32 |
| 0.0 | 0.32 |
| 0.0 | 0.32 |
| 0.0 | 0.32 |
| 0.0 | 0.32 |
| 0.0 | 0.32 |
| 0.0 | 0.32 |
| 0.0 | 0.321 |
| 0.0 | 0.321 |
| 0.0 | 0.321 |
| 0.0 | 0.321 |
| 0.0 | 0.321 |
| 0.0 | 0.321 |
| 0.0 | 0.321 |
| 0.0 | 0.321 |
| 0.0 | 0.321 |
| 0.0 | 0.321 |
| 0.0 | 0.322 |
| 0.0 | 0.322 |
| 0.0 | 0.322 |
| 0.0 | 0.322 |
| 0.0 | 0.322 |
| 0.0 | 0.322 |
| 0.0 | 0.322 |
| 0.0 | 0.322 |
| 0.0 | 0.322 |
| 0.0 | 0.322 |
| 0.0 | 0.323 |
| 0.0 | 0.323 |
| 0.0 | 0.323 |
| 0.0 | 0.323 |
| 0.0 | 0.323 |
| 0.0 | 0.323 |
| 0.0 | 0.323 |
| 0.0 | 0.323 |
| 0.0 | 0.323 |
| 0.0 | 0.323 |
| 0.0 | 0.324 |
| 0.0 | 0.324 |
| 0.0 | 0.324 |
| 0.0 | 0.324 |
| 0.0 | 0.324 |
| 0.0 | 0.324 |
| 0.0 | 0.324 |
| 0.0 | 0.324 |
| 0.0 | 0.324 |
| 0.0 | 0.324 |
| 0.0 | 0.325 |
| 0.0 | 0.325 |
| 0.0 | 0.325 |
| 0.0 | 0.325 |
| 0.0 | 0.325 |
| 0.0 | 0.325 |
| 0.0 | 0.325 |
| 0.0 | 0.325 |
| 0.0 | 0.325 |
| 0.0 | 0.325 |
| 0.0 | 0.326 |
| 0.0 | 0.326 |
| 0.0 | 0.326 |
| 0.0 | 0.326 |
| 0.0 | 0.326 |
| 0.0 | 0.326 |
| 0.0 | 0.326 |
| 0.0 | 0.326 |
| 0.0 | 0.326 |
| 0.0 | 0.326 |
| 0.0 | 0.327 |
| 0.0 | 0.327 |
| 0.0 | 0.327 |
| 0.0 | 0.327 |
| 0.0 | 0.327 |
| 0.0 | 0.327 |
| 0.0 | 0.327 |
| 0.0 | 0.327 |
| 0.0 | 0.327 |
| 0.0 | 0.327 |
| 0.0 | 0.328 |
| 0.0 | 0.328 |
| 0.0 | 0.328 |
| 0.0 | 0.328 |
| 0.0 | 0.328 |
| 0.0 | 0.328 |
| 0.0 | 0.328 |
| 0.0 | 0.328 |
| 0.0 | 0.328 |
| 0.0 | 0.328 |
| 0.0 | 0.329 |
| 0.0 | 0.329 |
| 0.0 | 0.329 |
| 0.0 | 0.329 |
| 0.0 | 0.329 |
| 0.0 | 0.329 |
| 0.0 | 0.329 |
| 0.0 | 0.329 |
| 0.0 | 0.329 |
| 0.0 | 0.329 |
| 0.0 | 0.33 |
| 0.0 | 0.33 |
| 0.0 | 0.33 |
| 0.0 | 0.33 |
| 0.0 | 0.33 |
| 0.0 | 0.33 |
| 0.0 | 0.33 |
| 0.0 | 0.33 |
| 0.0 | 0.33 |
| 0.0 | 0.33 |
| 0.0 | 0.331 |
| 0.0 | 0.331 |
| 0.0 | 0.331 |
| 0.0 | 0.331 |
| 0.0 | 0.331 |
| 0.0 | 0.331 |
| 0.0 | 0.331 |
| 0.0 | 0.331 |
| 0.0 | 0.331 |
| 0.0 | 0.331 |
| 0.0 | 0.332 |
| 0.0 | 0.332 |
| 0.0 | 0.332 |
| 0.0 | 0.332 |
| 0.0 | 0.332 |
| 0.0 | 0.332 |
| 0.0 | 0.332 |
| 0.0 | 0.332 |
| 0.0 | 0.332 |
| 0.0 | 0.332 |
| 0.0 | 0.333 |
| 0.0 | 0.333 |
| 0.0 | 0.333 |
| 0.0 | 0.333 |
| 0.0 | 0.333 |
| 0.0 | 0.333 |
| 0.0 | 0.333 |
| 0.0 | 0.333 |
| 0.0 | 0.333 |
| 0.0 | 0.333 |
| 0.0 | 0.334 |
| 0.0 | 0.334 |
| 0.0 | 0.334 |
| 0.0 | 0.334 |
| 0.0 | 0.334 |
| 0.0 | 0.334 |
| 0.0 | 0.334 |
| 0.0 | 0.334 |
| 0.0 | 0.334 |
| 0.0 | 0.334 |
| 0.0 | 0.335 |
| 0.0 | 0.335 |
| 0.0 | 0.335 |
| 0.0 | 0.335 |
| 0.0 | 0.335 |
| 0.0 | 0.335 |
| 0.0 | 0.335 |
| 0.0 | 0.335 |
| 0.0 | 0.335 |
| 0.0 | 0.335 |
| 0.0 | 0.336 |
| 0.0 | 0.336 |
| 0.0 | 0.336 |
| 0.0 | 0.336 |
| 0.0 | 0.336 |
| 0.0 | 0.336 |
| 0.0 | 0.336 |
| 0.0 | 0.336 |
| 0.0 | 0.336 |
| 0.0 | 0.336 |
| 0.0 | 0.337 |
| 0.0 | 0.337 |
| 0.0 | 0.337 |
| 0.0 | 0.337 |
| 0.0 | 0.337 |
| 0.0 | 0.337 |
| 0.0 | 0.337 |
| 0.0 | 0.337 |
| 0.0 | 0.337 |
| 0.0 | 0.337 |
| 0.0 | 0.338 |
| 0.0 | 0.338 |
| 0.0 | 0.338 |
| 0.0 | 0.338 |
| 0.0 | 0.338 |
| 0.0 | 0.338 |
| 0.0 | 0.338 |
| 0.0 | 0.338 |
| 0.0 | 0.338 |
| 0.0 | 0.338 |
| 0.0 | 0.339 |
| 0.0 | 0.339 |
| 0.0 | 0.339 |
| 0.0 | 0.339 |
| 0.0 | 0.339 |
| 0.0 | 0.339 |
| 0.0 | 0.339 |
| 0.0 | 0.339 |
| 0.0 | 0.339 |
| 0.0 | 0.339 |
| 0.0 | 0.34 |
| 0.0 | 0.34 |
| 0.0 | 0.34 |
| 0.0 | 0.34 |
| 0.0 | 0.34 |
| 0.0 | 0.34 |
| 0.0 | 0.34 |
| 0.0 | 0.34 |
| 0.0 | 0.34 |
| 0.0 | 0.34 |
| 0.0 | 0.341 |
| 0.0 | 0.341 |
| 0.0 | 0.341 |
| 0.0 | 0.341 |
| 0.0 | 0.341 |
| 0.0 | 0.341 |
| 0.0 | 0.341 |
| 0.0 | 0.341 |
| 0.0 | 0.341 |
| 0.0 | 0.341 |
| 0.0 | 0.342 |
| 0.0 | 0.342 |
| 0.0 | 0.342 |
| 0.0 | 0.342 |
| 0.0 | 0.342 |
| 0.0 | 0.342 |
| 0.0 | 0.342 |
| 0.0 | 0.342 |
| 0.0 | 0.342 |
| 0.0 | 0.342 |
| 0.0 | 0.343 |
| 0.0 | 0.343 |
| 0.0 | 0.343 |
| 0.0 | 0.343 |
| 0.0 | 0.343 |
| 0.0 | 0.343 |
| 0.0 | 0.343 |
| 0.0 | 0.343 |
| 0.0 | 0.343 |
| 0.0 | 0.343 |
| 0.0 | 0.344 |
| 0.0 | 0.344 |
| 0.0 | 0.344 |
| 0.0 | 0.344 |
| 0.0 | 0.344 |
| 0.0 | 0.344 |
| 0.0 | 0.344 |
| 0.0 | 0.344 |
| 0.0 | 0.344 |
| 0.0 | 0.344 |
| 0.0 | 0.345 |
| 0.0 | 0.345 |
| 0.0 | 0.345 |
| 0.0 | 0.345 |
| 0.0 | 0.345 |
| 0.0 | 0.345 |
| 0.0 | 0.345 |
| 0.0 | 0.345 |
| 0.0 | 0.345 |
| 0.0 | 0.345 |
| 0.0 | 0.346 |
| 0.0 | 0.346 |
| 0.0 | 0.346 |
| 0.0 | 0.346 |
| 0.0 | 0.346 |
| 0.0 | 0.346 |
| 0.0 | 0.346 |
| 0.0 | 0.346 |
| 0.0 | 0.346 |
| 0.0 | 0.346 |
| 0.0 | 0.347 |
| 0.0 | 0.347 |
| 0.0 | 0.347 |
| 0.0 | 0.347 |
| 0.0 | 0.347 |
| 0.0 | 0.347 |
| 0.0 | 0.347 |
| 0.0 | 0.347 |
| 0.0 | 0.347 |
| 0.0 | 0.347 |
| 0.0 | 0.348 |
| 0.0 | 0.348 |
| 0.0 | 0.348 |
| 0.0 | 0.348 |
| 0.0 | 0.348 |
| 0.0 | 0.348 |
| 0.0 | 0.348 |
| 0.0 | 0.348 |
| 0.0 | 0.348 |
| 0.0 | 0.348 |
| 0.0 | 0.349 |
| 0.0 | 0.349 |
| 0.0 | 0.349 |
| 0.0 | 0.349 |
| 0.0 | 0.349 |
| 0.0 | 0.349 |
| 0.0 | 0.349 |
| 0.0 | 0.349 |
| 0.0 | 0.349 |
| 0.0 | 0.349 |
| 0.0 | 0.35 |
| 0.0 | 0.35 |
| 0.0 | 0.35 |
| 0.0 | 0.35 |
| 0.0 | 0.35 |
| 0.0 | 0.35 |
| 0.0 | 0.35 |
| 0.0 | 0.35 |
| 0.0 | 0.35 |
| 0.0 | 0.35 |
| 0.0 | 0.351 |
| 0.0 | 0.351 |
| 0.0 | 0.351 |
| 0.0 | 0.351 |
| 0.0 | 0.351 |
| 0.0 | 0.351 |
| 0.0 | 0.351 |
| 0.0 | 0.351 |
| 0.0 | 0.351 |
| 0.0 | 0.351 |
| 0.0 | 0.352 |
| 0.0 | 0.352 |
| 0.0 | 0.352 |
| 0.0 | 0.352 |
| 0.0 | 0.352 |
| 0.0 | 0.352 |
| 0.0 | 0.352 |
| 0.0 | 0.352 |
| 0.0 | 0.352 |
| 0.0 | 0.352 |
| 0.0 | 0.353 |
| 0.0 | 0.353 |
| 0.0 | 0.353 |
| 0.0 | 0.353 |
| 0.0 | 0.353 |
| 0.0 | 0.353 |
| 0.0 | 0.353 |
| 0.0 | 0.353 |
| 0.0 | 0.353 |
| 0.0 | 0.353 |
| 0.0 | 0.354 |
| 0.0 | 0.354 |
| 0.0 | 0.354 |
| 0.0 | 0.354 |
| 0.0 | 0.354 |
| 0.0 | 0.354 |
| 0.0 | 0.354 |
| 0.0 | 0.354 |
| 0.0 | 0.354 |
| 0.0 | 0.354 |
| 0.0 | 0.355 |
| 0.0 | 0.355 |
| 0.0 | 0.355 |
| 0.0 | 0.355 |
| 0.0 | 0.355 |
| 0.0 | 0.355 |
| 0.0 | 0.355 |
| 0.0 | 0.355 |
| 0.0 | 0.355 |
| 0.0 | 0.355 |
| 0.0 | 0.356 |
| 0.0 | 0.356 |
| 0.0 | 0.356 |
| 0.0 | 0.356 |
| 0.0 | 0.356 |
| 0.0 | 0.356 |
| 0.0 | 0.356 |
| 0.0 | 0.356 |
| 0.0 | 0.356 |
| 0.0 | 0.356 |
| 0.0 | 0.357 |
| 0.0 | 0.357 |
| 0.0 | 0.357 |
| 0.0 | 0.357 |
| 0.0 | 0.357 |
| 0.0 | 0.357 |
| 0.0 | 0.357 |
| 0.0 | 0.357 |
| 0.0 | 0.357 |
| 0.0 | 0.357 |
| 0.0 | 0.358 |
| 0.0 | 0.358 |
| 0.0 | 0.358 |
| 0.0 | 0.358 |
| 0.0 | 0.358 |
| 0.0 | 0.358 |
| 0.0 | 0.358 |
| 0.0 | 0.358 |
| 0.0 | 0.358 |
| 0.0 | 0.358 |
| 0.0 | 0.359 |
| 0.0 | 0.359 |
| 0.0 | 0.359 |
| 0.0 | 0.359 |
| 0.0 | 0.359 |
| 0.0 | 0.359 |
| 0.0 | 0.359 |
| 0.0 | 0.359 |
| 0.0 | 0.359 |
| 0.0 | 0.359 |
| 0.0 | 0.36 |
| 0.0 | 0.36 |
| 0.0 | 0.36 |
| 0.0 | 0.36 |
| 0.0 | 0.36 |
| 0.0 | 0.36 |
| 0.0 | 0.36 |
| 0.0 | 0.36 |
| 0.0 | 0.36 |
| 0.0 | 0.36 |
| 0.0 | 0.361 |
| 0.0 | 0.361 |
| 0.0 | 0.361 |
| 0.0 | 0.361 |
| 0.0 | 0.361 |
| 0.0 | 0.361 |
| 0.0 | 0.361 |
| 0.0 | 0.361 |
| 0.0 | 0.361 |
| 0.0 | 0.361 |
| 0.0 | 0.362 |
| 0.0 | 0.362 |
| 0.0 | 0.362 |
| 0.0 | 0.362 |
| 0.0 | 0.362 |
| 0.0 | 0.362 |
| 0.0 | 0.362 |
| 0.0 | 0.362 |
| 0.0 | 0.362 |
| 0.0 | 0.362 |
| 0.0 | 0.363 |
| 0.0 | 0.363 |
| 0.0 | 0.363 |
| 0.0 | 0.363 |
| 0.0 | 0.363 |
| 0.0 | 0.363 |
| 0.0 | 0.363 |
| 0.0 | 0.363 |
| 0.0 | 0.363 |
| 0.0 | 0.363 |
| 0.0 | 0.364 |
| 0.0 | 0.364 |
| 0.0 | 0.364 |
| 0.0 | 0.364 |
| 0.0 | 0.364 |
| 0.0 | 0.364 |
| 0.0 | 0.364 |
| 0.0 | 0.364 |
| 0.0 | 0.364 |
| 0.0 | 0.364 |
| 0.0 | 0.365 |
| 0.0 | 0.365 |
| 0.0 | 0.365 |
| 0.0 | 0.365 |
| 0.0 | 0.365 |
| 0.0 | 0.365 |
| 0.0 | 0.365 |
| 0.0 | 0.365 |
| 0.0 | 0.365 |
| 0.0 | 0.365 |
| 0.0 | 0.366 |
| 0.0 | 0.366 |
| 0.0 | 0.366 |
| 0.0 | 0.366 |
| 0.0 | 0.366 |
| 0.0 | 0.366 |
| 0.0 | 0.366 |
| 0.0 | 0.366 |
| 0.0 | 0.366 |
| 0.0 | 0.366 |
| 0.0 | 0.367 |
| 0.0 | 0.367 |
| 0.0 | 0.367 |
| 0.0 | 0.367 |
| 0.0 | 0.367 |
| 0.0 | 0.367 |
| 0.0 | 0.367 |
| 0.0 | 0.367 |
| 0.0 | 0.367 |
| 0.0 | 0.367 |
| 0.0 | 0.368 |
| 0.0 | 0.368 |
| 0.0 | 0.368 |
| 0.0 | 0.368 |
| 0.0 | 0.368 |
| 0.0 | 0.368 |
| 0.0 | 0.368 |
| 0.0 | 0.368 |
| 0.0 | 0.368 |
| 0.0 | 0.368 |
| 0.0 | 0.369 |
| 0.0 | 0.369 |
| 0.0 | 0.369 |
| 0.0 | 0.369 |
| 0.0 | 0.369 |
| 0.0 | 0.369 |
| 0.0 | 0.369 |
| 0.0 | 0.369 |
| 0.0 | 0.369 |
| 0.0 | 0.369 |
| 0.0 | 0.37 |
| 0.0 | 0.37 |
| 0.0 | 0.37 |
| 0.0 | 0.37 |
| 0.0 | 0.37 |
| 0.0 | 0.37 |
| 0.0 | 0.37 |
| 0.0 | 0.37 |
| 0.0 | 0.37 |
| 0.0 | 0.37 |
| 0.0 | 0.371 |
| 0.0 | 0.371 |
| 0.0 | 0.371 |
| 0.0 | 0.371 |
| 0.0 | 0.371 |
| 0.0 | 0.371 |
| 0.0 | 0.371 |
| 0.0 | 0.371 |
| 0.0 | 0.371 |
| 0.0 | 0.371 |
| 0.0 | 0.372 |
| 0.0 | 0.372 |
| 0.0 | 0.372 |
| 0.0 | 0.372 |
| 0.0 | 0.372 |
| 0.0 | 0.372 |
| 0.0 | 0.372 |
| 0.0 | 0.372 |
| 0.0 | 0.372 |
| 0.0 | 0.372 |
| 0.0 | 0.373 |
| 0.0 | 0.373 |
| 0.0 | 0.373 |
| 0.0 | 0.373 |
| 0.0 | 0.373 |
| 0.0 | 0.373 |
| 0.0 | 0.373 |
| 0.0 | 0.373 |
| 0.0 | 0.373 |
| 0.0 | 0.373 |
| 0.0 | 0.374 |
| 0.0 | 0.374 |
| 0.0 | 0.374 |
| 0.0 | 0.374 |
| 0.0 | 0.374 |
| 0.0 | 0.374 |
| 0.0 | 0.374 |
| 0.0 | 0.374 |
| 0.0 | 0.374 |
| 0.0 | 0.374 |
| 0.0 | 0.375 |
| 0.0 | 0.375 |
| 0.0 | 0.375 |
| 0.0 | 0.375 |
| 0.0 | 0.375 |
| 0.0 | 0.375 |
| 0.0 | 0.375 |
| 0.0 | 0.375 |
| 0.0 | 0.375 |
| 0.0 | 0.375 |
| 0.0 | 0.376 |
| 0.0 | 0.376 |
| 0.0 | 0.376 |
| 0.0 | 0.376 |
| 0.0 | 0.376 |
| 0.0 | 0.376 |
| 0.0 | 0.376 |
| 0.0 | 0.376 |
| 0.0 | 0.376 |
| 0.0 | 0.376 |
| 0.0 | 0.377 |
| 0.0 | 0.377 |
| 0.0 | 0.377 |
| 0.0 | 0.377 |
| 0.0 | 0.377 |
| 0.0 | 0.377 |
| 0.0 | 0.377 |
| 0.0 | 0.377 |
| 0.0 | 0.377 |
| 0.0 | 0.377 |
| 0.0 | 0.378 |
| 0.0 | 0.378 |
| 0.0 | 0.378 |
| 0.0 | 0.378 |
| 0.0 | 0.378 |
| 0.0 | 0.378 |
| 0.0 | 0.378 |
| 0.0 | 0.378 |
| 0.0 | 0.378 |
| 0.0 | 0.378 |
| 0.0 | 0.379 |
| 0.0 | 0.379 |
| 0.0 | 0.379 |
| 0.0 | 0.379 |
| 0.0 | 0.379 |
| 0.0 | 0.379 |
| 0.0 | 0.379 |
| 0.0 | 0.379 |
| 0.0 | 0.379 |
| 0.0 | 0.379 |
| 0.0 | 0.38 |
| 0.0 | 0.38 |
| 0.0 | 0.38 |
| 0.0 | 0.38 |
| 0.0 | 0.38 |
| 0.0 | 0.38 |
| 0.0 | 0.38 |
| 0.0 | 0.38 |
| 0.0 | 0.38 |
| 0.0 | 0.38 |
| 0.0 | 0.381 |
| 0.0 | 0.381 |
| 0.0 | 0.381 |
| 0.0 | 0.381 |
| 0.0 | 0.381 |
| 0.0 | 0.381 |
| 0.0 | 0.381 |
| 0.0 | 0.381 |
| 0.0 | 0.381 |
| 0.0 | 0.381 |
| 0.0 | 0.382 |
| 0.0 | 0.382 |
| 0.0 | 0.382 |
| 0.0 | 0.382 |
| 0.0 | 0.382 |
| 0.0 | 0.382 |
| 0.0 | 0.382 |
| 0.0 | 0.382 |
| 0.0 | 0.382 |
| 0.0 | 0.382 |
| 0.0 | 0.383 |
| 0.0 | 0.383 |
| 0.0 | 0.383 |
| 0.0 | 0.383 |
| 0.0 | 0.383 |
| 0.0 | 0.383 |
| 0.0 | 0.383 |
| 0.0 | 0.383 |
| 0.0 | 0.383 |
| 0.0 | 0.383 |
| 0.0 | 0.384 |
| 0.0 | 0.384 |
| 0.0 | 0.384 |
| 0.0 | 0.384 |
| 0.0 | 0.384 |
| 0.0 | 0.384 |
| 0.0 | 0.384 |
| 0.0 | 0.384 |
| 0.0 | 0.384 |
| 0.0 | 0.384 |
| 0.0 | 0.385 |
| 0.0 | 0.385 |
| 0.0 | 0.385 |
| 0.0 | 0.385 |
| 0.0 | 0.385 |
| 0.0 | 0.385 |
| 0.0 | 0.385 |
| 0.0 | 0.385 |
| 0.0 | 0.385 |
| 0.0 | 0.385 |
| 0.0 | 0.386 |
| 0.0 | 0.386 |
| 0.0 | 0.386 |
| 0.0 | 0.386 |
| 0.0 | 0.386 |
| 0.0 | 0.386 |
| 0.0 | 0.386 |
| 0.0 | 0.386 |
| 0.0 | 0.386 |
| 0.0 | 0.386 |
| 0.0 | 0.387 |
| 0.0 | 0.387 |
| 0.0 | 0.387 |
| 0.0 | 0.387 |
| 0.0 | 0.387 |
| 0.0 | 0.387 |
| 0.0 | 0.387 |
| 0.0 | 0.387 |
| 0.0 | 0.387 |
| 0.0 | 0.387 |
| 0.0 | 0.388 |
| 0.0 | 0.388 |
| 0.0 | 0.388 |
| 0.0 | 0.388 |
| 0.0 | 0.388 |
| 0.0 | 0.388 |
| 0.0 | 0.388 |
| 0.0 | 0.388 |
| 0.0 | 0.388 |
| 0.0 | 0.388 |
| 0.0 | 0.389 |
| 0.0 | 0.389 |
| 0.0 | 0.389 |
| 0.0 | 0.389 |
| 0.0 | 0.389 |
| 0.0 | 0.389 |
| 0.0 | 0.389 |
| 0.0 | 0.389 |
| 0.0 | 0.389 |
| 0.0 | 0.389 |
| 0.0 | 0.39 |
| 0.0 | 0.39 |
| 0.0 | 0.39 |
| 0.0 | 0.39 |
| 0.0 | 0.39 |
| 0.0 | 0.39 |
| 0.0 | 0.39 |
| 0.0 | 0.39 |
| 0.0 | 0.39 |
| 0.0 | 0.39 |
| 0.0 | 0.391 |
| 0.0 | 0.391 |
| 0.0 | 0.391 |
| 0.0 | 0.391 |
| 0.0 | 0.391 |
| 0.0 | 0.391 |
| 0.0 | 0.391 |
| 0.0 | 0.391 |
| 0.0 | 0.391 |
| 0.0 | 0.391 |
| 0.0 | 0.392 |
| 0.0 | 0.392 |
| 0.0 | 0.392 |
| 0.0 | 0.392 |
| 0.0 | 0.392 |
| 0.0 | 0.392 |
| 0.0 | 0.392 |
| 0.0 | 0.392 |
| 0.0 | 0.392 |
| 0.0 | 0.392 |
| 0.0 | 0.393 |
| 0.0 | 0.393 |
| 0.0 | 0.393 |
| 0.0 | 0.393 |
| 0.0 | 0.393 |
| 0.0 | 0.393 |
| 0.0 | 0.393 |
| 0.0 | 0.393 |
| 0.0 | 0.393 |
| 0.0 | 0.393 |
| 0.0 | 0.394 |
| 0.0 | 0.394 |
| 0.0 | 0.394 |
| 0.0 | 0.394 |
| 0.0 | 0.394 |
| 0.0 | 0.394 |
| 0.0 | 0.394 |
| 0.0 | 0.394 |
| 0.0 | 0.394 |
| 0.0 | 0.394 |
| 0.0 | 0.395 |
| 0.0 | 0.395 |
| 0.0 | 0.395 |
| 0.0 | 0.395 |
| 0.0 | 0.395 |
| 0.0 | 0.395 |
| 0.0 | 0.395 |
| 0.0 | 0.395 |
| 0.0 | 0.395 |
| 0.0 | 0.395 |
| 0.0 | 0.396 |
| 0.0 | 0.396 |
| 0.0 | 0.396 |
| 0.0 | 0.396 |
| 0.0 | 0.396 |
| 0.0 | 0.396 |
| 0.0 | 0.396 |
| 0.0 | 0.396 |
| 0.0 | 0.396 |
| 0.0 | 0.396 |
| 0.0 | 0.397 |
| 0.0 | 0.397 |
| 0.0 | 0.397 |
| 0.0 | 0.397 |
| 0.0 | 0.397 |
| 0.0 | 0.397 |
| 0.0 | 0.397 |
| 0.0 | 0.397 |
| 0.0 | 0.397 |
| 0.0 | 0.397 |
| 0.0 | 0.398 |
| 0.0 | 0.398 |
| 0.0 | 0.398 |
| 0.0 | 0.398 |
| 0.0 | 0.398 |
| 0.0 | 0.398 |
| 0.0 | 0.398 |
| 0.0 | 0.398 |
| 0.0 | 0.398 |
| 0.0 | 0.398 |
| 0.0 | 0.399 |
| 0.0 | 0.399 |
| 0.0 | 0.399 |
| 0.0 | 0.399 |
| 0.0 | 0.399 |
| 0.0 | 0.399 |
| 0.0 | 0.399 |
| 0.0 | 0.399 |
| 0.0 | 0.399 |
| 0.0 | 0.399 |
| 0.0 | 0.4 |
| 0.0 | 0.4 |
| 0.0 | 0.4 |
| 0.0 | 0.4 |
| 0.0 | 0.4 |
| 0.0 | 0.4 |
| 0.0 | 0.4 |
| 0.0 | 0.4 |
| 0.0 | 0.4 |
| 0.0 | 0.4 |
| 0.0 | 0.401 |
| 0.0 | 0.401 |
| 0.0 | 0.401 |
| 0.0 | 0.401 |
| 0.0 | 0.401 |
| 0.0 | 0.401 |
| 0.0 | 0.401 |
| 0.0 | 0.401 |
| 0.0 | 0.401 |
| 0.0 | 0.401 |
| 0.0 | 0.402 |
| 0.0 | 0.402 |
| 0.0 | 0.402 |
| 0.0 | 0.402 |
| 0.0 | 0.402 |
| 0.0 | 0.402 |
| 0.0 | 0.402 |
| 0.0 | 0.402 |
| 0.0 | 0.402 |
| 0.0 | 0.402 |
| 0.0 | 0.403 |
| 0.0 | 0.403 |
| 0.0 | 0.403 |
| 0.0 | 0.403 |
| 0.0 | 0.403 |
| 0.0 | 0.403 |
| 0.0 | 0.403 |
| 0.0 | 0.403 |
| 0.0 | 0.403 |
| 0.0 | 0.403 |
| 0.0 | 0.404 |
| 0.0 | 0.404 |
| 0.0 | 0.404 |
| 0.0 | 0.404 |
| 0.0 | 0.404 |
| 0.0 | 0.404 |
| 0.0 | 0.404 |
| 0.0 | 0.404 |
| 0.0 | 0.404 |
| 0.0 | 0.404 |
| 0.0 | 0.405 |
| 0.0 | 0.405 |
| 0.0 | 0.405 |
| 0.0 | 0.405 |
| 0.0 | 0.405 |
| 0.0 | 0.405 |
| 0.0 | 0.405 |
| 0.0 | 0.405 |
| 0.0 | 0.405 |
| 0.0 | 0.405 |
| 0.0 | 0.406 |
| 0.0 | 0.406 |
| 0.0 | 0.406 |
| 0.0 | 0.406 |
| 0.0 | 0.406 |
| 0.0 | 0.406 |
| 0.0 | 0.406 |
| 0.0 | 0.406 |
| 0.0 | 0.406 |
| 0.0 | 0.406 |
| 0.0 | 0.407 |
| 0.0 | 0.407 |
| 0.0 | 0.407 |
| 0.0 | 0.407 |
| 0.0 | 0.407 |
| 0.0 | 0.407 |
| 0.0 | 0.407 |
| 0.0 | 0.407 |
| 0.0 | 0.407 |
| 0.0 | 0.407 |
| 0.0 | 0.408 |
| 0.0 | 0.408 |
| 0.0 | 0.408 |
| 0.0 | 0.408 |
| 0.0 | 0.408 |
| 0.0 | 0.408 |
| 0.0 | 0.408 |
| 0.0 | 0.408 |
| 0.0 | 0.408 |
| 0.0 | 0.408 |
| 0.0 | 0.409 |
| 0.0 | 0.409 |
| 0.0 | 0.409 |
| 0.0 | 0.409 |
| 0.0 | 0.409 |
| 0.0 | 0.409 |
| 0.0 | 0.409 |
| 0.0 | 0.409 |
| 0.0 | 0.409 |
| 0.0 | 0.409 |
| 0.0 | 0.41 |
| 0.0 | 0.41 |
| 0.0 | 0.41 |
| 0.0 | 0.41 |
| 0.0 | 0.41 |
| 0.0 | 0.41 |
| 0.0 | 0.41 |
| 0.0 | 0.41 |
| 0.0 | 0.41 |
| 0.0 | 0.41 |
| 0.0 | 0.411 |
| 0.0 | 0.411 |
| 0.0 | 0.411 |
| 0.0 | 0.411 |
| 0.0 | 0.411 |
| 0.0 | 0.411 |
| 0.0 | 0.411 |
| 0.0 | 0.411 |
| 0.0 | 0.411 |
| 0.0 | 0.411 |
| 0.0 | 0.412 |
| 0.0 | 0.412 |
| 0.0 | 0.412 |
| 0.0 | 0.412 |
| 0.0 | 0.412 |
| 0.0 | 0.412 |
| 0.0 | 0.412 |
| 0.0 | 0.412 |
| 0.0 | 0.412 |
| 0.0 | 0.412 |
| 0.0 | 0.413 |
| 0.0 | 0.413 |
| 0.0 | 0.413 |
| 0.0 | 0.413 |
| 0.0 | 0.413 |
| 0.0 | 0.413 |
| 0.0 | 0.413 |
| 0.0 | 0.413 |
| 0.0 | 0.413 |
| 0.0 | 0.413 |
| 0.0 | 0.414 |
| 0.0 | 0.414 |
| 0.0 | 0.414 |
| 0.0 | 0.414 |
| 0.0 | 0.414 |
| 0.0 | 0.414 |
| 0.0 | 0.414 |
| 0.0 | 0.414 |
| 0.0 | 0.414 |
| 0.0 | 0.414 |
| 0.0 | 0.415 |
| 0.0 | 0.415 |
| 0.0 | 0.415 |
| 0.0 | 0.415 |
| 0.0 | 0.415 |
| 0.0 | 0.415 |
| 0.0 | 0.415 |
| 0.0 | 0.415 |
| 0.0 | 0.415 |
| 0.0 | 0.415 |
| 0.0 | 0.416 |
| 0.0 | 0.416 |
| 0.0 | 0.416 |
| 0.0 | 0.416 |
| 0.0 | 0.416 |
| 0.0 | 0.416 |
| 0.0 | 0.416 |
| 0.0 | 0.416 |
| 0.0 | 0.416 |
| 0.0 | 0.416 |
| 0.0 | 0.417 |
| 0.0 | 0.417 |
| 0.0 | 0.417 |
| 0.0 | 0.417 |
| 0.0 | 0.417 |
| 0.0 | 0.417 |
| 0.0 | 0.417 |
| 0.0 | 0.417 |
| 0.0 | 0.417 |
| 0.0 | 0.417 |
| 0.0 | 0.418 |
| 0.0 | 0.418 |
| 0.0 | 0.418 |
| 0.0 | 0.418 |
| 0.0 | 0.418 |
| 0.0 | 0.418 |
| 0.0 | 0.418 |
| 0.0 | 0.418 |
| 0.0 | 0.418 |
| 0.0 | 0.418 |
| 0.0 | 0.419 |
| 0.0 | 0.419 |
| 0.0 | 0.419 |
| 0.0 | 0.419 |
| 0.0 | 0.419 |
| 0.0 | 0.419 |
| 0.0 | 0.419 |
| 0.0 | 0.419 |
| 0.0 | 0.419 |
| 0.0 | 0.419 |
| 0.0 | 0.42 |
| 0.0 | 0.42 |
| 0.0 | 0.42 |
| 0.0 | 0.42 |
| 0.0 | 0.42 |
| 0.0 | 0.42 |
| 0.0 | 0.42 |
| 0.0 | 0.42 |
| 0.0 | 0.42 |
| 0.0 | 0.42 |
| 0.0 | 0.421 |
| 0.0 | 0.421 |
| 0.0 | 0.421 |
| 0.0 | 0.421 |
| 0.0 | 0.421 |
| 0.0 | 0.421 |
| 0.0 | 0.421 |
| 0.0 | 0.421 |
| 0.0 | 0.421 |
| 0.0 | 0.421 |
| 0.0 | 0.422 |
| 0.0 | 0.422 |
| 0.0 | 0.422 |
| 0.0 | 0.422 |
| 0.0 | 0.422 |
| 0.0 | 0.422 |
| 0.0 | 0.422 |
| 0.0 | 0.422 |
| 0.0 | 0.422 |
| 0.0 | 0.422 |
| 0.0 | 0.423 |
| 0.0 | 0.423 |
| 0.0 | 0.423 |
| 0.0 | 0.423 |
| 0.0 | 0.423 |
| 0.0 | 0.423 |
| 0.0 | 0.423 |
| 0.0 | 0.423 |
| 0.0 | 0.423 |
| 0.0 | 0.423 |
| 0.0 | 0.424 |
| 0.0 | 0.424 |
| 0.0 | 0.424 |
| 0.0 | 0.424 |
| 0.0 | 0.424 |
| 0.0 | 0.424 |
| 0.0 | 0.424 |
| 0.0 | 0.424 |
| 0.0 | 0.424 |
| 0.0 | 0.424 |
| 0.0 | 0.425 |
| 0.0 | 0.425 |
| 0.0 | 0.425 |
| 0.0 | 0.425 |
| 0.0 | 0.425 |
| 0.0 | 0.425 |
| 0.0 | 0.425 |
| 0.0 | 0.425 |
| 0.0 | 0.425 |
| 0.0 | 0.425 |
| 0.0 | 0.426 |
| 0.0 | 0.426 |
| 0.0 | 0.426 |
| 0.0 | 0.426 |
| 0.0 | 0.426 |
| 0.0 | 0.426 |
| 0.0 | 0.426 |
| 0.0 | 0.426 |
| 0.0 | 0.426 |
| 0.0 | 0.426 |
| 0.0 | 0.427 |
| 0.0 | 0.427 |
| 0.0 | 0.427 |
| 0.0 | 0.427 |
| 0.0 | 0.427 |
| 0.0 | 0.427 |
| 0.0 | 0.427 |
| 0.0 | 0.427 |
| 0.0 | 0.427 |
| 0.0 | 0.427 |
| 0.0 | 0.428 |
| 0.0 | 0.428 |
| 0.0 | 0.428 |
| 0.0 | 0.428 |
| 0.0 | 0.428 |
| 0.0 | 0.428 |
| 0.0 | 0.428 |
| 0.0 | 0.428 |
| 0.0 | 0.428 |
| 0.0 | 0.428 |
| 0.0 | 0.429 |
| 0.0 | 0.429 |
| 0.0 | 0.429 |
| 0.0 | 0.429 |
| 0.0 | 0.429 |
| 0.0 | 0.429 |
| 0.0 | 0.429 |
| 0.0 | 0.429 |
| 0.0 | 0.429 |
| 0.0 | 0.429 |
| 0.0 | 0.43 |
| 0.0 | 0.43 |
| 0.0 | 0.43 |
| 0.0 | 0.43 |
| 0.0 | 0.43 |
| 0.0 | 0.43 |
| 0.0 | 0.43 |
| 0.0 | 0.43 |
| 0.0 | 0.43 |
| 0.0 | 0.43 |
| 0.0 | 0.431 |
| 0.0 | 0.431 |
| 0.0 | 0.431 |
| 0.0 | 0.431 |
| 0.0 | 0.431 |
| 0.0 | 0.431 |
| 0.0 | 0.431 |
| 0.0 | 0.431 |
| 0.0 | 0.431 |
| 0.0 | 0.431 |
| 0.0 | 0.432 |
| 0.0 | 0.432 |
| 0.0 | 0.432 |
| 0.0 | 0.432 |
| 0.0 | 0.432 |
| 0.0 | 0.432 |
| 0.0 | 0.432 |
| 0.0 | 0.432 |
| 0.0 | 0.432 |
| 0.0 | 0.432 |
| 0.0 | 0.433 |
| 0.0 | 0.433 |
| 0.0 | 0.433 |
| 0.0 | 0.433 |
| 0.0 | 0.433 |
| 0.0 | 0.433 |
| 0.0 | 0.433 |
| 0.0 | 0.433 |
| 0.0 | 0.433 |
| 0.0 | 0.433 |
| 0.0 | 0.434 |
| 0.0 | 0.434 |
| 0.0 | 0.434 |
| 0.0 | 0.434 |
| 0.0 | 0.434 |
| 0.0 | 0.434 |
| 0.0 | 0.434 |
| 0.0 | 0.434 |
| 0.0 | 0.434 |
| 0.0 | 0.434 |
| 0.0 | 0.435 |
| 0.0 | 0.435 |
| 0.0 | 0.435 |
| 0.0 | 0.435 |
| 0.0 | 0.435 |
| 0.0 | 0.435 |
| 0.0 | 0.435 |
| 0.0 | 0.435 |
| 0.0 | 0.435 |
| 0.0 | 0.435 |
| 0.0 | 0.436 |
| 0.0 | 0.436 |
| 0.0 | 0.436 |
| 0.0 | 0.436 |
| 0.0 | 0.436 |
| 0.0 | 0.436 |
| 0.0 | 0.436 |
| 0.0 | 0.436 |
| 0.0 | 0.436 |
| 0.0 | 0.436 |
| 0.0 | 0.437 |
| 0.0 | 0.437 |
| 0.0 | 0.437 |
| 0.0 | 0.437 |
| 0.0 | 0.437 |
| 0.0 | 0.437 |
| 0.0 | 0.437 |
| 0.0 | 0.437 |
| 0.0 | 0.437 |
| 0.0 | 0.437 |
| 0.0 | 0.438 |
| 0.0 | 0.438 |
| 0.0 | 0.438 |
| 0.0 | 0.438 |
| 0.0 | 0.438 |
| 0.0 | 0.438 |
| 0.0 | 0.438 |
| 0.0 | 0.438 |
| 0.0 | 0.438 |
| 0.0 | 0.438 |
| 0.0 | 0.439 |
| 0.0 | 0.439 |
| 0.0 | 0.439 |
| 0.0 | 0.439 |
| 0.0 | 0.439 |
| 0.0 | 0.439 |
| 0.0 | 0.439 |
| 0.0 | 0.439 |
| 0.0 | 0.439 |
| 0.0 | 0.439 |
| 0.0 | 0.44 |
| 0.0 | 0.44 |
| 0.0 | 0.44 |
| 0.0 | 0.44 |
| 0.0 | 0.44 |
| 0.0 | 0.44 |
| 0.0 | 0.44 |
| 0.0 | 0.44 |
| 0.0 | 0.44 |
| 0.0 | 0.44 |
| 0.0 | 0.441 |
| 0.0 | 0.441 |
| 0.0 | 0.441 |
| 0.0 | 0.441 |
| 0.0 | 0.441 |
| 0.0 | 0.441 |
| 0.0 | 0.441 |
| 0.0 | 0.441 |
| 0.0 | 0.441 |
| 0.0 | 0.441 |
| 0.0 | 0.442 |
| 0.0 | 0.442 |
| 0.0 | 0.442 |
| 0.0 | 0.442 |
| 0.0 | 0.442 |
| 0.0 | 0.442 |
| 0.0 | 0.442 |
| 0.0 | 0.442 |
| 0.0 | 0.442 |
| 0.0 | 0.442 |
| 0.0 | 0.443 |
| 0.0 | 0.443 |
| 0.0 | 0.443 |
| 0.0 | 0.443 |
| 0.0 | 0.443 |
| 0.0 | 0.443 |
| 0.0 | 0.443 |
| 0.0 | 0.443 |
| 0.0 | 0.443 |
| 0.0 | 0.443 |
| 0.0 | 0.444 |
| 0.0 | 0.444 |
| 0.0 | 0.444 |
| 0.0 | 0.444 |
| 0.0 | 0.444 |
| 0.0 | 0.444 |
| 0.0 | 0.444 |
| 0.0 | 0.444 |
| 0.0 | 0.444 |
| 0.0 | 0.444 |
| 0.0 | 0.445 |
| 0.0 | 0.445 |
| 0.0 | 0.445 |
| 0.0 | 0.445 |
| 0.0 | 0.445 |
| 0.0 | 0.445 |
| 0.0 | 0.445 |
| 0.0 | 0.445 |
| 0.0 | 0.445 |
| 0.0 | 0.445 |
| 0.0 | 0.446 |
| 0.0 | 0.446 |
| 0.0 | 0.446 |
| 0.0 | 0.446 |
| 0.0 | 0.446 |
| 0.0 | 0.446 |
| 0.0 | 0.446 |
| 0.0 | 0.446 |
| 0.0 | 0.446 |
| 0.0 | 0.446 |
| 0.0 | 0.447 |
| 0.0 | 0.447 |
| 0.0 | 0.447 |
| 0.0 | 0.447 |
| 0.0 | 0.447 |
| 0.0 | 0.447 |
| 0.0 | 0.447 |
| 0.0 | 0.447 |
| 0.0 | 0.447 |
| 0.0 | 0.447 |
| 0.0 | 0.448 |
| 0.0 | 0.448 |
| 0.0 | 0.448 |
| 0.0 | 0.448 |
| 0.0 | 0.448 |
| 0.0 | 0.448 |
| 0.0 | 0.448 |
| 0.0 | 0.448 |
| 0.0 | 0.448 |
| 0.0 | 0.448 |
| 0.0 | 0.449 |
| 0.0 | 0.449 |
| 0.0 | 0.449 |
| 0.0 | 0.449 |
| 0.0 | 0.449 |
| 0.0 | 0.449 |
| 0.0 | 0.449 |
| 0.0 | 0.449 |
| 0.0 | 0.449 |
| 0.0 | 0.449 |
| 0.0 | 0.45 |
| 0.0 | 0.45 |
| 0.0 | 0.45 |
| 0.0 | 0.45 |
| 0.0 | 0.45 |
| 0.0 | 0.45 |
| 0.0 | 0.45 |
| 0.0 | 0.45 |
| 0.0 | 0.45 |
| 0.0 | 0.45 |
| 0.0 | 0.451 |
| 0.0 | 0.451 |
| 0.0 | 0.451 |
| 0.0 | 0.451 |
| 0.0 | 0.451 |
| 0.0 | 0.451 |
| 0.0 | 0.451 |
| 0.0 | 0.451 |
| 0.0 | 0.451 |
| 0.0 | 0.451 |
| 0.0 | 0.452 |
| 0.0 | 0.452 |
| 0.0 | 0.452 |
| 0.0 | 0.452 |
| 0.0 | 0.452 |
| 0.0 | 0.452 |
| 0.0 | 0.452 |
| 0.0 | 0.452 |
| 0.0 | 0.452 |
| 0.0 | 0.452 |
| 0.0 | 0.453 |
| 0.0 | 0.453 |
| 0.0 | 0.453 |
| 0.0 | 0.453 |
| 0.0 | 0.453 |
| 0.0 | 0.453 |
| 0.0 | 0.453 |
| 0.0 | 0.453 |
| 0.0 | 0.453 |
| 0.0 | 0.453 |
| 0.0 | 0.454 |
| 0.0 | 0.454 |
| 0.0 | 0.454 |
| 0.0 | 0.454 |
| 0.0 | 0.454 |
| 0.0 | 0.454 |
| 0.0 | 0.454 |
| 0.0 | 0.454 |
| 0.0 | 0.454 |
| 0.0 | 0.454 |
| 0.0 | 0.455 |
| 0.0 | 0.455 |
| 0.0 | 0.455 |
| 0.0 | 0.455 |
| 0.0 | 0.455 |
| 0.0 | 0.455 |
| 0.0 | 0.455 |
| 0.0 | 0.455 |
| 0.0 | 0.455 |
| 0.0 | 0.455 |
| 0.0 | 0.456 |
| 0.0 | 0.456 |
| 0.0 | 0.456 |
| 0.0 | 0.456 |
| 0.0 | 0.456 |
| 0.0 | 0.456 |
| 0.0 | 0.456 |
| 0.0 | 0.456 |
| 0.0 | 0.456 |
| 0.0 | 0.456 |
| 0.0 | 0.457 |
| 0.0 | 0.457 |
| 0.0 | 0.457 |
| 0.0 | 0.457 |
| 0.0 | 0.457 |
| 0.0 | 0.457 |
| 0.0 | 0.457 |
| 0.0 | 0.457 |
| 0.0 | 0.457 |
| 0.0 | 0.457 |
| 0.0 | 0.458 |
| 0.0 | 0.458 |
| 0.0 | 0.458 |
| 0.0 | 0.458 |
| 0.0 | 0.458 |
| 0.0 | 0.458 |
| 0.0 | 0.458 |
| 0.0 | 0.458 |
| 0.0 | 0.458 |
| 0.0 | 0.458 |
| 0.0 | 0.459 |
| 0.0 | 0.459 |
| 0.0 | 0.459 |
| 0.0 | 0.459 |
| 0.0 | 0.459 |
| 0.0 | 0.459 |
| 0.0 | 0.459 |
| 0.0 | 0.459 |
| 0.0 | 0.459 |
| 0.0 | 0.459 |
| 0.0 | 0.46 |
| 0.0 | 0.46 |
| 0.0 | 0.46 |
| 0.0 | 0.46 |
| 0.0 | 0.46 |
| 0.0 | 0.46 |
| 0.0 | 0.46 |
| 0.0 | 0.46 |
| 0.0 | 0.46 |
| 0.0 | 0.46 |
| 0.0 | 0.461 |
| 0.0 | 0.461 |
| 0.0 | 0.461 |
| 0.0 | 0.461 |
| 0.0 | 0.461 |
| 0.0 | 0.461 |
| 0.0 | 0.461 |
| 0.0 | 0.461 |
| 0.0 | 0.461 |
| 0.0 | 0.461 |
| 0.0 | 0.462 |
| 0.0 | 0.462 |
| 0.0 | 0.462 |
| 0.0 | 0.462 |
| 0.0 | 0.462 |
| 0.0 | 0.462 |
| 0.0 | 0.462 |
| 0.0 | 0.462 |
| 0.0 | 0.462 |
| 0.0 | 0.462 |
| 0.0 | 0.463 |
| 0.0 | 0.463 |
| 0.0 | 0.463 |
| 0.0 | 0.463 |
| 0.0 | 0.463 |
| 0.0 | 0.463 |
| 0.0 | 0.463 |
| 0.0 | 0.463 |
| 0.0 | 0.463 |
| 0.0 | 0.463 |
| 0.0 | 0.464 |
| 0.0 | 0.464 |
| 0.0 | 0.464 |
| 0.0 | 0.464 |
| 0.0 | 0.464 |
| 0.0 | 0.464 |
| 0.0 | 0.464 |
| 0.0 | 0.464 |
| 0.0 | 0.464 |
| 0.0 | 0.464 |
| 0.0 | 0.465 |
| 0.0 | 0.465 |
| 0.0 | 0.465 |
| 0.0 | 0.465 |
| 0.0 | 0.465 |
| 0.0 | 0.465 |
| 0.0 | 0.465 |
| 0.0 | 0.465 |
| 0.0 | 0.465 |
| 0.0 | 0.465 |
| 0.0 | 0.466 |
| 0.0 | 0.466 |
| 0.0 | 0.466 |
| 0.0 | 0.466 |
| 0.0 | 0.466 |
| 0.0 | 0.466 |
| 0.0 | 0.466 |
| 0.0 | 0.466 |
| 0.0 | 0.466 |
| 0.0 | 0.466 |
| 0.0 | 0.467 |
| 0.0 | 0.467 |
| 0.0 | 0.467 |
| 0.0 | 0.467 |
| 0.0 | 0.467 |
| 0.0 | 0.467 |
| 0.0 | 0.467 |
| 0.0 | 0.467 |
| 0.0 | 0.467 |
| 0.0 | 0.467 |
| 0.0 | 0.468 |
| 0.0 | 0.468 |
| 0.0 | 0.468 |
| 0.0 | 0.468 |
| 0.0 | 0.468 |
| 0.0 | 0.468 |
| 0.0 | 0.468 |
| 0.0 | 0.468 |
| 0.0 | 0.468 |
| 0.0 | 0.468 |
| 0.0 | 0.469 |
| 0.0 | 0.469 |
| 0.0 | 0.469 |
| 0.0 | 0.469 |
| 0.0 | 0.469 |
| 0.0 | 0.469 |
| 0.0 | 0.469 |
| 0.0 | 0.469 |
| 0.0 | 0.469 |
| 0.0 | 0.469 |
| 0.0 | 0.47 |
| 0.0 | 0.47 |
| 0.0 | 0.47 |
| 0.0 | 0.47 |
| 0.0 | 0.47 |
| 0.0 | 0.47 |
| 0.0 | 0.47 |
| 0.0 | 0.47 |
| 0.0 | 0.47 |
| 0.0 | 0.47 |
| 0.0 | 0.471 |
| 0.0 | 0.471 |
| 0.0 | 0.471 |
| 0.0 | 0.471 |
| 0.0 | 0.471 |
| 0.0 | 0.471 |
| 0.0 | 0.471 |
| 0.0 | 0.471 |
| 0.0 | 0.471 |
| 0.0 | 0.471 |
| 0.0 | 0.472 |
| 0.0 | 0.472 |
| 0.0 | 0.472 |
| 0.0 | 0.472 |
| 0.0 | 0.472 |
| 0.0 | 0.472 |
| 0.0 | 0.472 |
| 0.0 | 0.472 |
| 0.0 | 0.472 |
| 0.0 | 0.472 |
| 0.0 | 0.473 |
| 0.0 | 0.473 |
| 0.0 | 0.473 |
| 0.0 | 0.473 |
| 0.0 | 0.473 |
| 0.0 | 0.473 |
| 0.0 | 0.473 |
| 0.0 | 0.473 |
| 0.0 | 0.473 |
| 0.0 | 0.473 |
| 0.0 | 0.474 |
| 0.0 | 0.474 |
| 0.0 | 0.474 |
| 0.0 | 0.474 |
| 0.0 | 0.474 |
| 0.0 | 0.474 |
| 0.0 | 0.474 |
| 0.0 | 0.474 |
| 0.0 | 0.474 |
| 0.0 | 0.474 |
| 0.0 | 0.475 |
| 0.0 | 0.475 |
| 0.0 | 0.475 |
| 0.0 | 0.475 |
| 0.0 | 0.475 |
| 0.0 | 0.475 |
| 0.0 | 0.475 |
| 0.0 | 0.475 |
| 0.0 | 0.475 |
| 0.0 | 0.475 |
| 0.0 | 0.476 |
| 0.0 | 0.476 |
| 0.0 | 0.476 |
| 0.0 | 0.476 |
| 0.0 | 0.476 |
| 0.0 | 0.476 |
| 0.0 | 0.476 |
| 0.0 | 0.476 |
| 0.0 | 0.476 |
| 0.0 | 0.476 |
| 0.0 | 0.477 |
| 0.0 | 0.477 |
| 0.0 | 0.477 |
| 0.0 | 0.477 |
| 0.0 | 0.477 |
| 0.0 | 0.477 |
| 0.0 | 0.477 |
| 0.0 | 0.477 |
| 0.0 | 0.477 |
| 0.0 | 0.477 |
| 0.0 | 0.478 |
| 0.0 | 0.478 |
| 0.0 | 0.478 |
| 0.0 | 0.478 |
| 0.0 | 0.478 |
| 0.0 | 0.478 |
| 0.0 | 0.478 |
| 0.0 | 0.478 |
| 0.0 | 0.478 |
| 0.0 | 0.478 |
| 0.0 | 0.479 |
| 0.0 | 0.479 |
| 0.0 | 0.479 |
| 0.0 | 0.479 |
| 0.0 | 0.479 |
| 0.0 | 0.479 |
| 0.0 | 0.479 |
| 0.0 | 0.479 |
| 0.0 | 0.479 |
| 0.0 | 0.479 |
| 0.0 | 0.48 |
| 0.0 | 0.48 |
| 0.0 | 0.48 |
| 0.0 | 0.48 |
| 0.0 | 0.48 |
| 0.0 | 0.48 |
| 0.0 | 0.48 |
| 0.0 | 0.48 |
| 0.0 | 0.48 |
| 0.0 | 0.48 |
| 0.0 | 0.481 |
| 0.0 | 0.481 |
| 0.0 | 0.481 |
| 0.0 | 0.481 |
| 0.0 | 0.481 |
| 0.0 | 0.481 |
| 0.0 | 0.481 |
| 0.0 | 0.481 |
| 0.0 | 0.481 |
| 0.0 | 0.481 |
| 0.0 | 0.482 |
| 0.0 | 0.482 |
| 0.0 | 0.482 |
| 0.0 | 0.482 |
| 0.0 | 0.482 |
| 0.0 | 0.482 |
| 0.0 | 0.482 |
| 0.0 | 0.482 |
| 0.0 | 0.482 |
| 0.0 | 0.482 |
| 0.0 | 0.483 |
| 0.0 | 0.483 |
| 0.0 | 0.483 |
| 0.0 | 0.483 |
| 0.0 | 0.483 |
| 0.0 | 0.483 |
| 0.0 | 0.483 |
| 0.0 | 0.483 |
| 0.0 | 0.483 |
| 0.0 | 0.483 |
| 0.0 | 0.484 |
| 0.0 | 0.484 |
| 0.0 | 0.484 |
| 0.0 | 0.484 |
| 0.0 | 0.484 |
| 0.0 | 0.484 |
| 0.0 | 0.484 |
| 0.0 | 0.484 |
| 0.0 | 0.484 |
| 0.0 | 0.484 |
| 0.0 | 0.485 |
| 0.0 | 0.485 |
| 0.0 | 0.485 |
| 0.0 | 0.485 |
| 0.0 | 0.485 |
| 0.0 | 0.485 |
| 0.0 | 0.485 |
| 0.0 | 0.485 |
| 0.0 | 0.485 |
| 0.0 | 0.485 |
| 0.0 | 0.486 |
| 0.0 | 0.486 |
| 0.0 | 0.486 |
| 0.0 | 0.486 |
| 0.0 | 0.486 |
| 0.0 | 0.486 |
| 0.0 | 0.486 |
| 0.0 | 0.486 |
| 0.0 | 0.486 |
| 0.0 | 0.486 |
| 0.0 | 0.487 |
| 0.0 | 0.487 |
| 0.0 | 0.487 |
| 0.0 | 0.487 |
| 0.0 | 0.487 |
| 0.0 | 0.487 |
| 0.0 | 0.487 |
| 0.0 | 0.487 |
| 0.0 | 0.487 |
| 0.0 | 0.487 |
| 0.0 | 0.488 |
| 0.0 | 0.488 |
| 0.0 | 0.488 |
| 0.0 | 0.488 |
| 0.0 | 0.488 |
| 0.0 | 0.488 |
| 0.0 | 0.488 |
| 0.0 | 0.488 |
| 0.0 | 0.488 |
| 0.0 | 0.488 |
| 0.0 | 0.489 |
| 0.0 | 0.489 |
| 0.0 | 0.489 |
| 0.0 | 0.489 |
| 0.0 | 0.489 |
| 0.0 | 0.489 |
| 0.0 | 0.489 |
| 0.0 | 0.489 |
| 0.0 | 0.489 |
| 0.0 | 0.489 |
| 0.0 | 0.49 |
| 0.0 | 0.49 |
| 0.0 | 0.49 |
| 0.0 | 0.49 |
| 0.0 | 0.49 |
| 0.0 | 0.49 |
| 0.0 | 0.49 |
| 0.0 | 0.49 |
| 0.0 | 0.49 |
| 0.0 | 0.49 |
| 0.0 | 0.491 |
| 0.0 | 0.491 |
| 0.0 | 0.491 |
| 0.0 | 0.491 |
| 0.0 | 0.491 |
| 0.0 | 0.491 |
| 0.0 | 0.491 |
| 0.0 | 0.491 |
| 0.0 | 0.491 |
| 0.0 | 0.491 |
| 0.0 | 0.492 |
| 0.0 | 0.492 |
| 0.0 | 0.492 |
| 0.0 | 0.492 |
| 0.0 | 0.492 |
| 0.0 | 0.492 |
| 0.0 | 0.492 |
| 0.0 | 0.492 |
| 0.0 | 0.492 |
| 0.0 | 0.492 |
| 0.0 | 0.493 |
| 0.0 | 0.493 |
| 0.0 | 0.493 |
| 0.0 | 0.493 |
| 0.0 | 0.493 |
| 0.0 | 0.493 |
| 0.0 | 0.493 |
| 0.0 | 0.493 |
| 0.0 | 0.493 |
| 0.0 | 0.493 |
| 0.0 | 0.494 |
| 0.0 | 0.494 |
| 0.0 | 0.494 |
| 0.0 | 0.494 |
| 0.0 | 0.494 |
| 0.0 | 0.494 |
| 0.0 | 0.494 |
| 0.0 | 0.494 |
| 0.0 | 0.494 |
| 0.0 | 0.494 |
| 0.0 | 0.495 |
| 0.0 | 0.495 |
| 0.0 | 0.495 |
| 0.0 | 0.495 |
| 0.0 | 0.495 |
| 0.0 | 0.495 |
| 0.0 | 0.495 |
| 0.0 | 0.495 |
| 0.0 | 0.495 |
| 0.0 | 0.495 |
| 0.0 | 0.496 |
| 0.0 | 0.496 |
| 0.0 | 0.496 |
| 0.0 | 0.496 |
| 0.0 | 0.496 |
| 0.0 | 0.496 |
| 0.0 | 0.496 |
| 0.0 | 0.496 |
| 0.0 | 0.496 |
| 0.0 | 0.496 |
| 0.0 | 0.497 |
| 0.0 | 0.497 |
| 0.0 | 0.497 |
| 0.0 | 0.497 |
| 0.0 | 0.497 |
| 0.0 | 0.497 |
| 0.0 | 0.497 |
| 0.0 | 0.497 |
| 0.0 | 0.497 |
| 0.0 | 0.497 |
| 0.0 | 0.498 |
| 0.0 | 0.498 |
| 0.0 | 0.498 |
| 0.0 | 0.498 |
| 0.0 | 0.498 |
| 0.0 | 0.498 |
| 0.0 | 0.498 |
| 0.0 | 0.498 |
| 0.0 | 0.498 |
| 0.0 | 0.498 |
| 0.0 | 0.499 |
| 0.0 | 0.499 |
| 0.0 | 0.499 |
| 0.0 | 0.499 |
| 0.0 | 0.499 |
| 0.0 | 0.499 |
| 0.0 | 0.499 |
| 0.0 | 0.499 |
| 0.0 | 0.499 |
| 0.0 | 0.499 |
| 0.0 | 0.5 |
| 0.0 | 0.5 |
| 0.0 | 0.5 |
| 0.0 | 0.5 |
| 0.0 | 0.5 |
| 0.0 | 0.5 |
| 0.0 | 0.5 |
| 0.0 | 0.5 |
| 0.0 | 0.5 |
| 0.0 | 0.5 |
| 0.0 | 0.501 |
| 0.0 | 0.501 |
| 0.0 | 0.501 |
| 0.0 | 0.501 |
| 0.0 | 0.501 |
| 0.0 | 0.501 |
| 0.0 | 0.501 |
| 0.0 | 0.501 |
| 0.0 | 0.501 |
| 0.0 | 0.501 |
| 0.0 | 0.502 |
| 0.0 | 0.502 |
| 0.0 | 0.502 |
| 0.0 | 0.502 |
| 0.0 | 0.502 |
| 0.0 | 0.502 |
| 0.0 | 0.502 |
| 0.0 | 0.502 |
| 0.0 | 0.502 |
| 0.0 | 0.502 |
| 0.0 | 0.503 |
| 0.0 | 0.503 |
| 0.0 | 0.503 |
| 0.0 | 0.503 |
| 0.0 | 0.503 |
| 0.0 | 0.503 |
| 0.0 | 0.503 |
| 0.0 | 0.503 |
| 0.0 | 0.503 |
| 0.0 | 0.503 |
| 0.0 | 0.504 |
| 0.0 | 0.504 |
| 0.0 | 0.504 |
| 0.0 | 0.504 |
| 0.0 | 0.504 |
| 0.0 | 0.504 |
| 0.0 | 0.504 |
| 0.0 | 0.504 |
| 0.0 | 0.504 |
| 0.0 | 0.504 |
| 0.0 | 0.505 |
| 0.0 | 0.505 |
| 0.0 | 0.505 |
| 0.0 | 0.505 |
| 0.0 | 0.505 |
| 0.0 | 0.505 |
| 0.0 | 0.505 |
| 0.0 | 0.505 |
| 0.0 | 0.505 |
| 0.0 | 0.505 |
| 0.0 | 0.506 |
| 0.0 | 0.506 |
| 0.0 | 0.506 |
| 0.0 | 0.506 |
| 0.0 | 0.506 |
| 0.0 | 0.506 |
| 0.0 | 0.506 |
| 0.0 | 0.506 |
| 0.0 | 0.506 |
| 0.0 | 0.506 |
| 0.0 | 0.507 |
| 0.0 | 0.507 |
| 0.0 | 0.507 |
| 0.0 | 0.507 |
| 0.0 | 0.507 |
| 0.0 | 0.507 |
| 0.0 | 0.507 |
| 0.0 | 0.507 |
| 0.0 | 0.507 |
| 0.0 | 0.507 |
| 0.0 | 0.508 |
| 0.0 | 0.508 |
| 0.0 | 0.508 |
| 0.0 | 0.508 |
| 0.0 | 0.508 |
| 0.0 | 0.508 |
| 0.0 | 0.508 |
| 0.0 | 0.508 |
| 0.0 | 0.508 |
| 0.0 | 0.508 |
| 0.0 | 0.509 |
| 0.0 | 0.509 |
| 0.0 | 0.509 |
| 0.0 | 0.509 |
| 0.0 | 0.509 |
| 0.0 | 0.509 |
| 0.0 | 0.509 |
| 0.0 | 0.509 |
| 0.0 | 0.509 |
| 0.0 | 0.509 |
| 0.0 | 0.51 |
| 0.0 | 0.51 |
| 0.0 | 0.51 |
| 0.0 | 0.51 |
| 0.0 | 0.51 |
| 0.0 | 0.51 |
| 0.0 | 0.51 |
| 0.0 | 0.51 |
| 0.0 | 0.51 |
| 0.0 | 0.51 |
| 0.0 | 0.511 |
| 0.0 | 0.511 |
| 0.0 | 0.511 |
| 0.0 | 0.511 |
| 0.0 | 0.511 |
| 0.0 | 0.511 |
| 0.0 | 0.511 |
| 0.0 | 0.511 |
| 0.0 | 0.511 |
| 0.0 | 0.511 |
| 0.0 | 0.512 |
| 0.0 | 0.512 |
| 0.0 | 0.512 |
| 0.0 | 0.512 |
| 0.0 | 0.512 |
| 0.0 | 0.512 |
| 0.0 | 0.512 |
| 0.0 | 0.512 |
| 0.0 | 0.512 |
| 0.0 | 0.512 |
| 0.0 | 0.513 |
| 0.0 | 0.513 |
| 0.0 | 0.513 |
| 0.0 | 0.513 |
| 0.0 | 0.513 |
| 0.0 | 0.513 |
| 0.0 | 0.513 |
| 0.0 | 0.513 |
| 0.0 | 0.513 |
| 0.0 | 0.513 |
| 0.0 | 0.514 |
| 0.0 | 0.514 |
| 0.0 | 0.514 |
| 0.0 | 0.514 |
| 0.0 | 0.514 |
| 0.0 | 0.514 |
| 0.0 | 0.514 |
| 0.0 | 0.514 |
| 0.0 | 0.514 |
| 0.0 | 0.514 |
| 0.0 | 0.515 |
| 0.0 | 0.515 |
| 0.0 | 0.515 |
| 0.0 | 0.515 |
| 0.0 | 0.515 |
| 0.0 | 0.515 |
| 0.0 | 0.515 |
| 0.0 | 0.515 |
| 0.0 | 0.515 |
| 0.0 | 0.515 |
| 0.0 | 0.516 |
| 0.0 | 0.516 |
| 0.0 | 0.516 |
| 0.0 | 0.516 |
| 0.0 | 0.516 |
| 0.0 | 0.516 |
| 0.0 | 0.516 |
| 0.0 | 0.516 |
| 0.0 | 0.516 |
| 0.0 | 0.516 |
| 0.0 | 0.517 |
| 0.0 | 0.517 |
| 0.0 | 0.517 |
| 0.0 | 0.517 |
| 0.0 | 0.517 |
| 0.0 | 0.517 |
| 0.0 | 0.517 |
| 0.0 | 0.517 |
| 0.0 | 0.517 |
| 0.0 | 0.517 |
| 0.0 | 0.518 |
| 0.0 | 0.518 |
| 0.0 | 0.518 |
| 0.0 | 0.518 |
| 0.0 | 0.518 |
| 0.0 | 0.518 |
| 0.0 | 0.518 |
| 0.0 | 0.518 |
| 0.0 | 0.518 |
| 0.0 | 0.518 |
| 0.0 | 0.519 |
| 0.0 | 0.519 |
| 0.0 | 0.519 |
| 0.0 | 0.519 |
| 0.0 | 0.519 |
| 0.0 | 0.519 |
| 0.0 | 0.519 |
| 0.0 | 0.519 |
| 0.0 | 0.519 |
| 0.0 | 0.519 |
| 0.0 | 0.52 |
| 0.0 | 0.52 |
| 0.0 | 0.52 |
| 0.0 | 0.52 |
| 0.0 | 0.52 |
| 0.0 | 0.52 |
| 0.0 | 0.52 |
| 0.0 | 0.52 |
| 0.0 | 0.52 |
| 0.0 | 0.52 |
| 0.0 | 0.521 |
| 0.0 | 0.521 |
| 0.0 | 0.521 |
| 0.0 | 0.521 |
| 0.0 | 0.521 |
| 0.0 | 0.521 |
| 0.0 | 0.521 |
| 0.0 | 0.521 |
| 0.0 | 0.521 |
| 0.0 | 0.521 |
| 0.0 | 0.522 |
| 0.0 | 0.522 |
| 0.0 | 0.522 |
| 0.0 | 0.522 |
| 0.0 | 0.522 |
| 0.0 | 0.522 |
| 0.0 | 0.522 |
| 0.0 | 0.522 |
| 0.0 | 0.522 |
| 0.0 | 0.522 |
| 0.0 | 0.523 |
| 0.0 | 0.523 |
| 0.0 | 0.523 |
| 0.0 | 0.523 |
| 0.0 | 0.523 |
| 0.0 | 0.523 |
| 0.0 | 0.523 |
| 0.0 | 0.523 |
| 0.0 | 0.523 |
| 0.0 | 0.523 |
| 0.0 | 0.524 |
| 0.0 | 0.524 |
| 0.0 | 0.524 |
| 0.0 | 0.524 |
| 0.0 | 0.524 |
| 0.0 | 0.524 |
| 0.0 | 0.524 |
| 0.0 | 0.524 |
| 0.0 | 0.524 |
| 0.0 | 0.524 |
| 0.0 | 0.525 |
| 0.0 | 0.525 |
| 0.0 | 0.525 |
| 0.0 | 0.525 |
| 0.0 | 0.525 |
| 0.0 | 0.525 |
| 0.0 | 0.525 |
| 0.0 | 0.525 |
| 0.0 | 0.525 |
| 0.0 | 0.525 |
| 0.0 | 0.526 |
| 0.0 | 0.526 |
| 0.0 | 0.526 |
| 0.0 | 0.526 |
| 0.0 | 0.526 |
| 0.0 | 0.526 |
| 0.0 | 0.526 |
| 0.0 | 0.526 |
| 0.0 | 0.526 |
| 0.0 | 0.526 |
| 0.0 | 0.527 |
| 0.0 | 0.527 |
| 0.0 | 0.527 |
| 0.0 | 0.527 |
| 0.0 | 0.527 |
| 0.0 | 0.527 |
| 0.0 | 0.527 |
| 0.0 | 0.527 |
| 0.0 | 0.527 |
| 0.0 | 0.527 |
| 0.0 | 0.528 |
| 0.0 | 0.528 |
| 0.0 | 0.528 |
| 0.0 | 0.528 |
| 0.0 | 0.528 |
| 0.0 | 0.528 |
| 0.0 | 0.528 |
| 0.0 | 0.528 |
| 0.0 | 0.528 |
| 0.0 | 0.528 |
| 0.0 | 0.529 |
| 0.0 | 0.529 |
| 0.0 | 0.529 |
| 0.0 | 0.529 |
| 0.0 | 0.529 |
| 0.0 | 0.529 |
| 0.0 | 0.529 |
| 0.0 | 0.529 |
| 0.0 | 0.529 |
| 0.0 | 0.529 |
| 0.0 | 0.53 |
| 0.0 | 0.53 |
| 0.0 | 0.53 |
| 0.0 | 0.53 |
| 0.0 | 0.53 |
| 0.0 | 0.53 |
| 0.0 | 0.53 |
| 0.0 | 0.53 |
| 0.0 | 0.53 |
| 0.0 | 0.53 |
| 0.0 | 0.531 |
| 0.0 | 0.531 |
| 0.0 | 0.531 |
| 0.0 | 0.531 |
| 0.0 | 0.531 |
| 0.0 | 0.531 |
| 0.0 | 0.531 |
| 0.0 | 0.531 |
| 0.0 | 0.531 |
| 0.0 | 0.531 |
| 0.0 | 0.532 |
| 0.0 | 0.532 |
| 0.0 | 0.532 |
| 0.0 | 0.532 |
| 0.0 | 0.532 |
| 0.0 | 0.532 |
| 0.0 | 0.532 |
| 0.0 | 0.532 |
| 0.0 | 0.532 |
| 0.0 | 0.532 |
| 0.0 | 0.533 |
| 0.0 | 0.533 |
| 0.0 | 0.533 |
| 0.0 | 0.533 |
| 0.0 | 0.533 |
| 0.0 | 0.533 |
| 0.0 | 0.533 |
| 0.0 | 0.533 |
| 0.0 | 0.533 |
| 0.0 | 0.533 |
| 0.0 | 0.534 |
| 0.0 | 0.534 |
| 0.0 | 0.534 |
| 0.0 | 0.534 |
| 0.0 | 0.534 |
| 0.0 | 0.534 |
| 0.0 | 0.534 |
| 0.0 | 0.534 |
| 0.0 | 0.534 |
| 0.0 | 0.534 |
| 0.0 | 0.535 |
| 0.0 | 0.535 |
| 0.0 | 0.535 |
| 0.0 | 0.535 |
| 0.0 | 0.535 |
| 0.0 | 0.535 |
| 0.0 | 0.535 |
| 0.0 | 0.535 |
| 0.0 | 0.535 |
| 0.0 | 0.535 |
| 0.0 | 0.536 |
| 0.0 | 0.536 |
| 0.0 | 0.536 |
| 0.0 | 0.536 |
| 0.0 | 0.536 |
| 0.0 | 0.536 |
| 0.0 | 0.536 |
| 0.0 | 0.536 |
| 0.0 | 0.536 |
| 0.0 | 0.536 |
| 0.0 | 0.537 |
| 0.0 | 0.537 |
| 0.0 | 0.537 |
| 0.0 | 0.537 |
| 0.0 | 0.537 |
| 0.0 | 0.537 |
| 0.0 | 0.537 |
| 0.0 | 0.537 |
| 0.0 | 0.537 |
| 0.0 | 0.537 |
| 0.0 | 0.538 |
| 0.0 | 0.538 |
| 0.0 | 0.538 |
| 0.0 | 0.538 |
| 0.0 | 0.538 |
| 0.0 | 0.538 |
| 0.0 | 0.538 |
| 0.0 | 0.538 |
| 0.0 | 0.538 |
| 0.0 | 0.538 |
| 0.0 | 0.539 |
| 0.0 | 0.539 |
| 0.0 | 0.539 |
| 0.0 | 0.539 |
| 0.0 | 0.539 |
| 0.0 | 0.539 |
| 0.0 | 0.539 |
| 0.0 | 0.539 |
| 0.0 | 0.539 |
| 0.0 | 0.539 |
| 0.0 | 0.54 |
| 0.0 | 0.54 |
| 0.0 | 0.54 |
| 0.0 | 0.54 |
| 0.0 | 0.54 |
| 0.0 | 0.54 |
| 0.0 | 0.54 |
| 0.0 | 0.54 |
| 0.0 | 0.54 |
| 0.0 | 0.54 |
| 0.0 | 0.541 |
| 0.0 | 0.541 |
| 0.0 | 0.541 |
| 0.0 | 0.541 |
| 0.0 | 0.541 |
| 0.0 | 0.541 |
| 0.0 | 0.541 |
| 0.0 | 0.541 |
| 0.0 | 0.541 |
| 0.0 | 0.541 |
| 0.0 | 0.542 |
| 0.0 | 0.542 |
| 0.0 | 0.542 |
| 0.0 | 0.542 |
| 0.0 | 0.542 |
| 0.0 | 0.542 |
| 0.0 | 0.542 |
| 0.0 | 0.542 |
| 0.0 | 0.542 |
| 0.0 | 0.542 |
| 0.0 | 0.543 |
| 0.0 | 0.543 |
| 0.0 | 0.543 |
| 0.0 | 0.543 |
| 0.0 | 0.543 |
| 0.0 | 0.543 |
| 0.0 | 0.543 |
| 0.0 | 0.543 |
| 0.0 | 0.543 |
| 0.0 | 0.543 |
| 0.0 | 0.544 |
| 0.0 | 0.544 |
| 0.0 | 0.544 |
| 0.0 | 0.544 |
| 0.0 | 0.544 |
| 0.0 | 0.544 |
| 0.0 | 0.544 |
| 0.0 | 0.544 |
| 0.0 | 0.544 |
| 0.0 | 0.544 |
| 0.0 | 0.545 |
| 0.0 | 0.545 |
| 0.0 | 0.545 |
| 0.0 | 0.545 |
| 0.0 | 0.545 |
| 0.0 | 0.545 |
| 0.0 | 0.545 |
| 0.0 | 0.545 |
| 0.0 | 0.545 |
| 0.0 | 0.545 |
| 0.0 | 0.546 |
| 0.0 | 0.546 |
| 0.0 | 0.546 |
| 0.0 | 0.546 |
| 0.0 | 0.546 |
| 0.0 | 0.546 |
| 0.0 | 0.546 |
| 0.0 | 0.546 |
| 0.0 | 0.546 |
| 0.0 | 0.546 |
| 0.0 | 0.547 |
| 0.0 | 0.547 |
| 0.0 | 0.547 |
| 0.0 | 0.547 |
| 0.0 | 0.547 |
| 0.0 | 0.547 |
| 0.0 | 0.547 |
| 0.0 | 0.547 |
| 0.0 | 0.547 |
| 0.0 | 0.547 |
| 0.0 | 0.548 |
| 0.0 | 0.548 |
| 0.0 | 0.548 |
| 0.0 | 0.548 |
| 0.0 | 0.548 |
| 0.0 | 0.548 |
| 0.0 | 0.548 |
| 0.0 | 0.548 |
| 0.0 | 0.548 |
| 0.0 | 0.548 |
| 0.0 | 0.549 |
| 0.0 | 0.549 |
| 0.0 | 0.549 |
| 0.0 | 0.549 |
| 0.0 | 0.549 |
| 0.0 | 0.549 |
| 0.0 | 0.549 |
| 0.0 | 0.549 |
| 0.0 | 0.549 |
| 0.0 | 0.549 |
| 0.0 | 0.55 |
| 0.0 | 0.55 |
| 0.0 | 0.55 |
| 0.0 | 0.55 |
| 0.0 | 0.55 |
| 0.0 | 0.55 |
| 0.0 | 0.55 |
| 0.0 | 0.55 |
| 0.0 | 0.55 |
| 0.0 | 0.55 |
| 0.0 | 0.551 |
| 0.0 | 0.551 |
| 0.0 | 0.551 |
| 0.0 | 0.551 |
| 0.0 | 0.551 |
| 0.0 | 0.551 |
| 0.0 | 0.551 |
| 0.0 | 0.551 |
| 0.0 | 0.551 |
| 0.0 | 0.551 |
| 0.0 | 0.552 |
| 0.0 | 0.552 |
| 0.0 | 0.552 |
| 0.0 | 0.552 |
| 0.0 | 0.552 |
| 0.0 | 0.552 |
| 0.0 | 0.552 |
| 0.0 | 0.552 |
| 0.0 | 0.552 |
| 0.0 | 0.552 |
| 0.0 | 0.553 |
| 0.0 | 0.553 |
| 0.0 | 0.553 |
| 0.0 | 0.553 |
| 0.0 | 0.553 |
| 0.0 | 0.553 |
| 0.0 | 0.553 |
| 0.0 | 0.553 |
| 0.0 | 0.553 |
| 0.0 | 0.553 |
| 0.0 | 0.554 |
| 0.0 | 0.554 |
| 0.0 | 0.554 |
| 0.0 | 0.554 |
| 0.0 | 0.554 |
| 0.0 | 0.554 |
| 0.0 | 0.554 |
| 0.0 | 0.554 |
| 0.0 | 0.554 |
| 0.0 | 0.554 |
| 0.0 | 0.555 |
| 0.0 | 0.555 |
| 0.0 | 0.555 |
| 0.0 | 0.555 |
| 0.0 | 0.555 |
| 0.0 | 0.555 |
| 0.0 | 0.555 |
| 0.0 | 0.555 |
| 0.0 | 0.555 |
| 0.0 | 0.555 |
| 0.0 | 0.556 |
| 0.0 | 0.556 |
| 0.0 | 0.556 |
| 0.0 | 0.556 |
| 0.0 | 0.556 |
| 0.0 | 0.556 |
| 0.0 | 0.556 |
| 0.0 | 0.556 |
| 0.0 | 0.556 |
| 0.0 | 0.556 |
| 0.0 | 0.557 |
| 0.0 | 0.557 |
| 0.0 | 0.557 |
| 0.0 | 0.557 |
| 0.0 | 0.557 |
| 0.0 | 0.557 |
| 0.0 | 0.557 |
| 0.0 | 0.557 |
| 0.0 | 0.557 |
| 0.0 | 0.557 |
| 0.0 | 0.558 |
| 0.0 | 0.558 |
| 0.0 | 0.558 |
| 0.0 | 0.558 |
| 0.0 | 0.558 |
| 0.0 | 0.558 |
| 0.0 | 0.558 |
| 0.0 | 0.558 |
| 0.0 | 0.558 |
| 0.0 | 0.558 |
| 0.0 | 0.559 |
| 0.0 | 0.559 |
| 0.0 | 0.559 |
| 0.0 | 0.559 |
| 0.0 | 0.559 |
| 0.0 | 0.559 |
| 0.0 | 0.559 |
| 0.0 | 0.559 |
| 0.0 | 0.559 |
| 0.0 | 0.559 |
| 0.0 | 0.56 |
| 0.0 | 0.56 |
| 0.0 | 0.56 |
| 0.0 | 0.56 |
| 0.0 | 0.56 |
| 0.0 | 0.56 |
| 0.0 | 0.56 |
| 0.0 | 0.56 |
| 0.0 | 0.56 |
| 0.0 | 0.56 |
| 0.0 | 0.561 |
| 0.0 | 0.561 |
| 0.0 | 0.561 |
| 0.0 | 0.561 |
| 0.0 | 0.561 |
| 0.0 | 0.561 |
| 0.0 | 0.561 |
| 0.0 | 0.561 |
| 0.0 | 0.561 |
| 0.0 | 0.561 |
| 0.0 | 0.562 |
| 0.0 | 0.562 |
| 0.0 | 0.562 |
| 0.0 | 0.562 |
| 0.0 | 0.562 |
| 0.0 | 0.562 |
| 0.0 | 0.562 |
| 0.0 | 0.562 |
| 0.0 | 0.562 |
| 0.0 | 0.562 |
| 0.0 | 0.563 |
| 0.0 | 0.563 |
| 0.0 | 0.563 |
| 0.0 | 0.563 |
| 0.0 | 0.563 |
| 0.0 | 0.563 |
| 0.0 | 0.563 |
| 0.0 | 0.563 |
| 0.0 | 0.563 |
| 0.0 | 0.563 |
| 0.0 | 0.564 |
| 0.0 | 0.564 |
| 0.0 | 0.564 |
| 0.0 | 0.564 |
| 0.0 | 0.564 |
| 0.0 | 0.564 |
| 0.0 | 0.564 |
| 0.0 | 0.564 |
| 0.0 | 0.564 |
| 0.0 | 0.564 |
| 0.0 | 0.565 |
| 0.0 | 0.565 |
| 0.0 | 0.565 |
| 0.0 | 0.565 |
| 0.0 | 0.565 |
| 0.0 | 0.565 |
| 0.0 | 0.565 |
| 0.0 | 0.565 |
| 0.0 | 0.565 |
| 0.0 | 0.565 |
| 0.0 | 0.566 |
| 0.0 | 0.566 |
| 0.0 | 0.566 |
| 0.0 | 0.566 |
| 0.0 | 0.566 |
| 0.0 | 0.566 |
| 0.0 | 0.566 |
| 0.0 | 0.566 |
| 0.0 | 0.566 |
| 0.0 | 0.566 |
| 0.0 | 0.567 |
| 0.0 | 0.567 |
| 0.0 | 0.567 |
| 0.0 | 0.567 |
| 0.0 | 0.567 |
| 0.0 | 0.567 |
| 0.0 | 0.567 |
| 0.0 | 0.567 |
| 0.0 | 0.567 |
| 0.0 | 0.567 |
| 0.0 | 0.568 |
| 0.0 | 0.568 |
| 0.0 | 0.568 |
| 0.0 | 0.568 |
| 0.0 | 0.568 |
| 0.0 | 0.568 |
| 0.0 | 0.568 |
| 0.0 | 0.568 |
| 0.0 | 0.568 |
| 0.0 | 0.568 |
| 0.0 | 0.569 |
| 0.0 | 0.569 |
| 0.0 | 0.569 |
| 0.0 | 0.569 |
| 0.0 | 0.569 |
| 0.0 | 0.569 |
| 0.0 | 0.569 |
| 0.0 | 0.569 |
| 0.0 | 0.569 |
| 0.0 | 0.569 |
| 0.0 | 0.57 |
| 0.0 | 0.57 |
| 0.0 | 0.57 |
| 0.0 | 0.57 |
| 0.0 | 0.57 |
| 0.0 | 0.57 |
| 0.0 | 0.57 |
| 0.0 | 0.57 |
| 0.0 | 0.57 |
| 0.0 | 0.57 |
| 0.0 | 0.571 |
| 0.0 | 0.571 |
| 0.0 | 0.571 |
| 0.0 | 0.571 |
| 0.0 | 0.571 |
| 0.0 | 0.571 |
| 0.0 | 0.571 |
| 0.0 | 0.571 |
| 0.0 | 0.571 |
| 0.0 | 0.571 |
| 0.0 | 0.572 |
| 0.0 | 0.572 |
| 0.0 | 0.572 |
| 0.0 | 0.572 |
| 0.0 | 0.572 |
| 0.0 | 0.572 |
| 0.0 | 0.572 |
| 0.0 | 0.572 |
| 0.0 | 0.572 |
| 0.0 | 0.572 |
| 0.0 | 0.573 |
| 0.0 | 0.573 |
| 0.0 | 0.573 |
| 0.0 | 0.573 |
| 0.0 | 0.573 |
| 0.0 | 0.573 |
| 0.0 | 0.573 |
| 0.0 | 0.573 |
| 0.0 | 0.573 |
| 0.0 | 0.573 |
| 0.0 | 0.574 |
| 0.0 | 0.574 |
| 0.0 | 0.574 |
| 0.0 | 0.574 |
| 0.0 | 0.574 |
| 0.0 | 0.574 |
| 0.0 | 0.574 |
| 0.0 | 0.574 |
| 0.0 | 0.574 |
| 0.0 | 0.574 |
| 0.0 | 0.575 |
| 0.0 | 0.575 |
| 0.0 | 0.575 |
| 0.0 | 0.575 |
| 0.0 | 0.575 |
| 0.0 | 0.575 |
| 0.0 | 0.575 |
| 0.0 | 0.575 |
| 0.0 | 0.575 |
| 0.0 | 0.575 |
| 0.0 | 0.576 |
| 0.0 | 0.576 |
| 0.0 | 0.576 |
| 0.0 | 0.576 |
| 0.0 | 0.576 |
| 0.0 | 0.576 |
| 0.0 | 0.576 |
| 0.0 | 0.576 |
| 0.0 | 0.576 |
| 0.0 | 0.576 |
| 0.0 | 0.577 |
| 0.0 | 0.577 |
| 0.0 | 0.577 |
| 0.0 | 0.577 |
| 0.0 | 0.577 |
| 0.0 | 0.577 |
| 0.0 | 0.577 |
| 0.0 | 0.577 |
| 0.0 | 0.577 |
| 0.0 | 0.577 |
| 0.0 | 0.578 |
| 0.0 | 0.578 |
| 0.0 | 0.578 |
| 0.0 | 0.578 |
| 0.0 | 0.578 |
| 0.0 | 0.578 |
| 0.0 | 0.578 |
| 0.0 | 0.578 |
| 0.0 | 0.578 |
| 0.0 | 0.578 |
| 0.0 | 0.579 |
| 0.0 | 0.579 |
| 0.0 | 0.579 |
| 0.0 | 0.579 |
| 0.0 | 0.579 |
| 0.0 | 0.579 |
| 0.0 | 0.579 |
| 0.0 | 0.579 |
| 0.0 | 0.579 |
| 0.0 | 0.579 |
| 0.0 | 0.58 |
| 0.0 | 0.58 |
| 0.0 | 0.58 |
| 0.0 | 0.58 |
| 0.0 | 0.58 |
| 0.0 | 0.58 |
| 0.0 | 0.58 |
| 0.0 | 0.58 |
| 0.0 | 0.58 |
| 0.0 | 0.58 |
| 0.0 | 0.581 |
| 0.0 | 0.581 |
| 0.0 | 0.581 |
| 0.0 | 0.581 |
| 0.0 | 0.581 |
| 0.0 | 0.581 |
| 0.0 | 0.581 |
| 0.0 | 0.581 |
| 0.0 | 0.581 |
| 0.0 | 0.581 |
| 0.0 | 0.582 |
| 0.0 | 0.582 |
| 0.0 | 0.582 |
| 0.0 | 0.582 |
| 0.0 | 0.582 |
| 0.0 | 0.582 |
| 0.0 | 0.582 |
| 0.0 | 0.582 |
| 0.0 | 0.582 |
| 0.0 | 0.582 |
| 0.0 | 0.583 |
| 0.0 | 0.583 |
| 0.0 | 0.583 |
| 0.0 | 0.583 |
| 0.0 | 0.583 |
| 0.0 | 0.583 |
| 0.0 | 0.583 |
| 0.0 | 0.583 |
| 0.0 | 0.583 |
| 0.0 | 0.583 |
| 0.0 | 0.584 |
| 0.0 | 0.584 |
| 0.0 | 0.584 |
| 0.0 | 0.584 |
| 0.0 | 0.584 |
| 0.0 | 0.584 |
| 0.0 | 0.584 |
| 0.0 | 0.584 |
| 0.0 | 0.584 |
| 0.0 | 0.584 |
| 0.0 | 0.585 |
| 0.0 | 0.585 |
| 0.0 | 0.585 |
| 0.0 | 0.585 |
| 0.0 | 0.585 |
| 0.0 | 0.585 |
| 0.0 | 0.585 |
| 0.0 | 0.585 |
| 0.0 | 0.585 |
| 0.0 | 0.585 |
| 0.0 | 0.586 |
| 0.0 | 0.586 |
| 0.0 | 0.586 |
| 0.0 | 0.586 |
| 0.0 | 0.586 |
| 0.0 | 0.586 |
| 0.0 | 0.586 |
| 0.0 | 0.586 |
| 0.0 | 0.586 |
| 0.0 | 0.586 |
| 0.0 | 0.587 |
| 0.0 | 0.587 |
| 0.0 | 0.587 |
| 0.0 | 0.587 |
| 0.0 | 0.587 |
| 0.0 | 0.587 |
| 0.0 | 0.587 |
| 0.0 | 0.587 |
| 0.0 | 0.587 |
| 0.0 | 0.587 |
| 0.0 | 0.588 |
| 0.0 | 0.588 |
| 0.0 | 0.588 |
| 0.0 | 0.588 |
| 0.0 | 0.588 |
| 0.0 | 0.588 |
| 0.0 | 0.588 |
| 0.0 | 0.588 |
| 0.0 | 0.588 |
| 0.0 | 0.588 |
| 0.0 | 0.589 |
| 0.0 | 0.589 |
| 0.0 | 0.589 |
| 0.0 | 0.589 |
| 0.0 | 0.589 |
| 0.0 | 0.589 |
| 0.0 | 0.589 |
| 0.0 | 0.589 |
| 0.0 | 0.589 |
| 0.0 | 0.589 |
| 0.0 | 0.59 |
| 0.0 | 0.59 |
| 0.0 | 0.59 |
| 0.0 | 0.59 |
| 0.0 | 0.59 |
| 0.0 | 0.59 |
| 0.0 | 0.59 |
| 0.0 | 0.59 |
| 0.0 | 0.59 |
| 0.0 | 0.59 |
| 0.0 | 0.591 |
| 0.0 | 0.591 |
| 0.0 | 0.591 |
| 0.0 | 0.591 |
| 0.0 | 0.591 |
| 0.0 | 0.591 |
| 0.0 | 0.591 |
| 0.0 | 0.591 |
| 0.0 | 0.591 |
| 0.0 | 0.591 |
| 0.0 | 0.592 |
| 0.0 | 0.592 |
| 0.0 | 0.592 |
| 0.0 | 0.592 |
| 0.0 | 0.592 |
| 0.0 | 0.592 |
| 0.0 | 0.592 |
| 0.0 | 0.592 |
| 0.0 | 0.592 |
| 0.0 | 0.592 |
| 0.0 | 0.593 |
| 0.0 | 0.593 |
| 0.0 | 0.593 |
| 0.0 | 0.593 |
| 0.0 | 0.593 |
| 0.0 | 0.593 |
| 0.0 | 0.593 |
| 0.0 | 0.593 |
| 0.0 | 0.593 |
| 0.0 | 0.593 |
| 0.0 | 0.594 |
| 0.0 | 0.594 |
| 0.0 | 0.594 |
| 0.0 | 0.594 |
| 0.0 | 0.594 |
| 0.0 | 0.594 |
| 0.0 | 0.594 |
| 0.0 | 0.594 |
| 0.0 | 0.594 |
| 0.0 | 0.594 |
| 0.0 | 0.595 |
| 0.0 | 0.595 |
| 0.0 | 0.595 |
| 0.0 | 0.595 |
| 0.0 | 0.595 |
| 0.0 | 0.595 |
| 0.0 | 0.595 |
| 0.0 | 0.595 |
| 0.0 | 0.595 |
| 0.0 | 0.595 |
| 0.0 | 0.596 |
| 0.0 | 0.596 |
| 0.0 | 0.596 |
| 0.0 | 0.596 |
| 0.0 | 0.596 |
| 0.0 | 0.596 |
| 0.0 | 0.596 |
| 0.0 | 0.596 |
| 0.0 | 0.596 |
| 0.0 | 0.596 |
| 0.0 | 0.597 |
| 0.0 | 0.597 |
| 0.0 | 0.597 |
| 0.0 | 0.597 |
| 0.0 | 0.597 |
| 0.0 | 0.597 |
| 0.0 | 0.597 |
| 0.0 | 0.597 |
| 0.0 | 0.597 |
| 0.0 | 0.597 |
| 0.0 | 0.598 |
| 0.0 | 0.598 |
| 0.0 | 0.598 |
| 0.0 | 0.598 |
| 0.0 | 0.598 |
| 0.0 | 0.598 |
| 0.0 | 0.598 |
| 0.0 | 0.598 |
| 0.0 | 0.598 |
| 0.0 | 0.598 |
| 0.0 | 0.599 |
| 0.0 | 0.599 |
| 0.0 | 0.599 |
| 0.0 | 0.599 |
| 0.0 | 0.599 |
| 0.0 | 0.599 |
| 0.0 | 0.599 |
| 0.0 | 0.599 |
| 0.0 | 0.599 |
| 0.0 | 0.599 |
| 0.0 | 0.6 |
| 0.0 | 0.6 |
| 0.0 | 0.6 |
| 0.0 | 0.6 |
| 0.0 | 0.6 |
| 0.0 | 0.6 |
| 0.0 | 0.6 |
| 0.0 | 0.6 |
| 0.0 | 0.6 |
| 0.0 | 0.6 |
| 0.0 | 0.601 |
| 0.0 | 0.601 |
| 0.0 | 0.601 |
| 0.0 | 0.601 |
| 0.0 | 0.601 |
| 0.0 | 0.601 |
| 0.0 | 0.601 |
| 0.0 | 0.601 |
| 0.0 | 0.601 |
| 0.0 | 0.601 |
| 0.0 | 0.602 |
| 0.0 | 0.602 |
| 0.0 | 0.602 |
| 0.0 | 0.602 |
| 0.0 | 0.602 |
| 0.0 | 0.602 |
| 0.0 | 0.602 |
| 0.0 | 0.602 |
| 0.0 | 0.602 |
| 0.0 | 0.602 |
| 0.0 | 0.603 |
| 0.0 | 0.603 |
| 0.0 | 0.603 |
| 0.0 | 0.603 |
| 0.0 | 0.603 |
| 0.0 | 0.603 |
| 0.0 | 0.603 |
| 0.0 | 0.603 |
| 0.0 | 0.603 |
| 0.0 | 0.603 |
| 0.0 | 0.604 |
| 0.0 | 0.604 |
| 0.0 | 0.604 |
| 0.0 | 0.604 |
| 0.0 | 0.604 |
| 0.0 | 0.604 |
| 0.0 | 0.604 |
| 0.0 | 0.604 |
| 0.0 | 0.604 |
| 0.0 | 0.604 |
| 0.0 | 0.605 |
| 0.0 | 0.605 |
| 0.0 | 0.605 |
| 0.0 | 0.605 |
| 0.0 | 0.605 |
| 0.0 | 0.605 |
| 0.0 | 0.605 |
| 0.0 | 0.605 |
| 0.0 | 0.605 |
| 0.0 | 0.605 |
| 0.0 | 0.606 |
| 0.0 | 0.606 |
| 0.0 | 0.606 |
| 0.0 | 0.606 |
| 0.0 | 0.606 |
| 0.0 | 0.606 |
| 0.0 | 0.606 |
| 0.0 | 0.606 |
| 0.0 | 0.606 |
| 0.0 | 0.606 |
| 0.0 | 0.607 |
| 0.0 | 0.607 |
| 0.0 | 0.607 |
| 0.0 | 0.607 |
| 0.0 | 0.607 |
| 0.0 | 0.607 |
| 0.0 | 0.607 |
| 0.0 | 0.607 |
| 0.0 | 0.607 |
| 0.0 | 0.607 |
| 0.0 | 0.608 |
| 0.0 | 0.608 |
| 0.0 | 0.608 |
| 0.0 | 0.608 |
| 0.0 | 0.608 |
| 0.0 | 0.608 |
| 0.0 | 0.608 |
| 0.0 | 0.608 |
| 0.0 | 0.608 |
| 0.0 | 0.608 |
| 0.0 | 0.609 |
| 0.0 | 0.609 |
| 0.0 | 0.609 |
| 0.0 | 0.609 |
| 0.0 | 0.609 |
| 0.0 | 0.609 |
| 0.0 | 0.609 |
| 0.0 | 0.609 |
| 0.0 | 0.609 |
| 0.0 | 0.609 |
| 0.0 | 0.61 |
| 0.0 | 0.61 |
| 0.0 | 0.61 |
| 0.0 | 0.61 |
| 0.0 | 0.61 |
| 0.0 | 0.61 |
| 0.0 | 0.61 |
| 0.0 | 0.61 |
| 0.0 | 0.61 |
| 0.0 | 0.61 |
| 0.0 | 0.611 |
| 0.0 | 0.611 |
| 0.0 | 0.611 |
| 0.0 | 0.611 |
| 0.0 | 0.611 |
| 0.0 | 0.611 |
| 0.0 | 0.611 |
| 0.0 | 0.611 |
| 0.0 | 0.611 |
| 0.0 | 0.611 |
| 0.0 | 0.612 |
| 0.0 | 0.612 |
| 0.0 | 0.612 |
| 0.0 | 0.612 |
| 0.0 | 0.612 |
| 0.0 | 0.612 |
| 0.0 | 0.612 |
| 0.0 | 0.612 |
| 0.0 | 0.612 |
| 0.0 | 0.612 |
| 0.0 | 0.613 |
| 0.0 | 0.613 |
| 0.0 | 0.613 |
| 0.0 | 0.613 |
| 0.0 | 0.613 |
| 0.0 | 0.613 |
| 0.0 | 0.613 |
| 0.0 | 0.613 |
| 0.0 | 0.613 |
| 0.0 | 0.613 |
| 0.0 | 0.614 |
| 0.0 | 0.614 |
| 0.0 | 0.614 |
| 0.0 | 0.614 |
| 0.0 | 0.614 |
| 0.0 | 0.614 |
| 0.0 | 0.614 |
| 0.0 | 0.614 |
| 0.0 | 0.614 |
| 0.0 | 0.614 |
| 0.0 | 0.615 |
| 0.0 | 0.615 |
| 0.0 | 0.615 |
| 0.0 | 0.615 |
| 0.0 | 0.615 |
| 0.0 | 0.615 |
| 0.0 | 0.615 |
| 0.0 | 0.615 |
| 0.0 | 0.615 |
| 0.0 | 0.615 |
| 0.0 | 0.616 |
| 0.0 | 0.616 |
| 0.0 | 0.616 |
| 0.0 | 0.616 |
| 0.0 | 0.616 |
| 0.0 | 0.616 |
| 0.0 | 0.616 |
| 0.0 | 0.616 |
| 0.0 | 0.616 |
| 0.0 | 0.616 |
| 0.0 | 0.617 |
| 0.0 | 0.617 |
| 0.0 | 0.617 |
| 0.0 | 0.617 |
| 0.0 | 0.617 |
| 0.0 | 0.617 |
| 0.0 | 0.617 |
| 0.0 | 0.617 |
| 0.0 | 0.617 |
| 0.0 | 0.617 |
| 0.0 | 0.618 |
| 0.0 | 0.618 |
| 0.0 | 0.618 |
| 0.0 | 0.618 |
| 0.0 | 0.618 |
| 0.0 | 0.618 |
| 0.0 | 0.618 |
| 0.0 | 0.618 |
| 0.0 | 0.618 |
| 0.0 | 0.618 |
| 0.0 | 0.619 |
| 0.0 | 0.619 |
| 0.0 | 0.619 |
| 0.0 | 0.619 |
| 0.0 | 0.619 |
| 0.0 | 0.619 |
| 0.0 | 0.619 |
| 0.0 | 0.619 |
| 0.0 | 0.619 |
| 0.0 | 0.619 |
| 0.0 | 0.62 |
| 0.0 | 0.62 |
| 0.0 | 0.62 |
| 0.0 | 0.62 |
| 0.0 | 0.62 |
| 0.0 | 0.62 |
| 0.0 | 0.62 |
| 0.0 | 0.62 |
| 0.0 | 0.62 |
| 0.0 | 0.62 |
| 0.0 | 0.621 |
| 0.0 | 0.621 |
| 0.0 | 0.621 |
| 0.0 | 0.621 |
| 0.0 | 0.621 |
| 0.0 | 0.621 |
| 0.0 | 0.621 |
| 0.0 | 0.621 |
| 0.0 | 0.621 |
| 0.0 | 0.621 |
| 0.0 | 0.622 |
| 0.0 | 0.622 |
| 0.0 | 0.622 |
| 0.0 | 0.622 |
| 0.0 | 0.622 |
| 0.0 | 0.622 |
| 0.0 | 0.622 |
| 0.0 | 0.622 |
| 0.0 | 0.622 |
| 0.0 | 0.622 |
| 0.0 | 0.623 |
| 0.0 | 0.623 |
| 0.0 | 0.623 |
| 0.0 | 0.623 |
| 0.0 | 0.623 |
| 0.0 | 0.623 |
| 0.0 | 0.623 |
| 0.0 | 0.623 |
| 0.0 | 0.623 |
| 0.0 | 0.623 |
| 0.0 | 0.624 |
| 0.0 | 0.624 |
| 0.0 | 0.624 |
| 0.0 | 0.624 |
| 0.0 | 0.624 |
| 0.0 | 0.624 |
| 0.0 | 0.624 |
| 0.0 | 0.624 |
| 0.0 | 0.624 |
| 0.0 | 0.624 |
| 0.0 | 0.625 |
| 0.0 | 0.625 |
| 0.0 | 0.625 |
| 0.0 | 0.625 |
| 0.0 | 0.625 |
| 0.0 | 0.625 |
| 0.0 | 0.625 |
| 0.0 | 0.625 |
| 0.0 | 0.625 |
| 0.0 | 0.625 |
| 0.0 | 0.626 |
| 0.0 | 0.626 |
| 0.0 | 0.626 |
| 0.0 | 0.626 |
| 0.0 | 0.626 |
| 0.0 | 0.626 |
| 0.0 | 0.626 |
| 0.0 | 0.626 |
| 0.0 | 0.626 |
| 0.0 | 0.626 |
| 0.0 | 0.627 |
| 0.0 | 0.627 |
| 0.0 | 0.627 |
| 0.0 | 0.627 |
| 0.0 | 0.627 |
| 0.0 | 0.627 |
| 0.0 | 0.627 |
| 0.0 | 0.627 |
| 0.0 | 0.627 |
| 0.0 | 0.627 |
| 0.0 | 0.628 |
| 0.0 | 0.628 |
| 0.0 | 0.628 |
| 0.0 | 0.628 |
| 0.0 | 0.628 |
| 0.0 | 0.628 |
| 0.0 | 0.628 |
| 0.0 | 0.628 |
| 0.0 | 0.628 |
| 0.0 | 0.628 |
| 0.0 | 0.629 |
| 0.0 | 0.629 |
| 0.0 | 0.629 |
| 0.0 | 0.629 |
| 0.0 | 0.629 |
| 0.0 | 0.629 |
| 0.0 | 0.629 |
| 0.0 | 0.629 |
| 0.0 | 0.629 |
| 0.0 | 0.629 |
| 0.0 | 0.63 |
| 0.0 | 0.63 |
| 0.0 | 0.63 |
| 0.0 | 0.63 |
| 0.0 | 0.63 |
| 0.0 | 0.63 |
| 0.0 | 0.63 |
| 0.0 | 0.63 |
| 0.0 | 0.63 |
| 0.0 | 0.63 |
| 0.0 | 0.631 |
| 0.0 | 0.631 |
| 0.0 | 0.631 |
| 0.0 | 0.631 |
| 0.0 | 0.631 |
| 0.0 | 0.631 |
| 0.0 | 0.631 |
| 0.0 | 0.631 |
| 0.0 | 0.631 |
| 0.0 | 0.631 |
| 0.0 | 0.632 |
| 0.0 | 0.632 |
| 0.0 | 0.632 |
| 0.0 | 0.632 |
| 0.0 | 0.632 |
| 0.0 | 0.632 |
| 0.0 | 0.632 |
| 0.0 | 0.632 |
| 0.0 | 0.632 |
| 0.0 | 0.632 |
| 0.0 | 0.633 |
| 0.0 | 0.633 |
| 0.0 | 0.633 |
| 0.0 | 0.633 |
| 0.0 | 0.633 |
| 0.0 | 0.633 |
| 0.0 | 0.633 |
| 0.0 | 0.633 |
| 0.0 | 0.633 |
| 0.0 | 0.633 |
| 0.0 | 0.634 |
| 0.0 | 0.634 |
| 0.0 | 0.634 |
| 0.0 | 0.634 |
| 0.0 | 0.634 |
| 0.0 | 0.634 |
| 0.0 | 0.634 |
| 0.0 | 0.634 |
| 0.0 | 0.634 |
| 0.0 | 0.634 |
| 0.0 | 0.635 |
| 0.0 | 0.635 |
| 0.0 | 0.635 |
| 0.0 | 0.635 |
| 0.0 | 0.635 |
| 0.0 | 0.635 |
| 0.0 | 0.635 |
| 0.0 | 0.635 |
| 0.0 | 0.635 |
| 0.0 | 0.635 |
| 0.0 | 0.636 |
| 0.0 | 0.636 |
| 0.0 | 0.636 |
| 0.0 | 0.636 |
| 0.0 | 0.636 |
| 0.0 | 0.636 |
| 0.0 | 0.636 |
| 0.0 | 0.636 |
| 0.0 | 0.636 |
| 0.0 | 0.636 |
| 0.0 | 0.637 |
| 0.0 | 0.637 |
| 0.0 | 0.637 |
| 0.0 | 0.637 |
| 0.0 | 0.637 |
| 0.0 | 0.637 |
| 0.0 | 0.637 |
| 0.0 | 0.637 |
| 0.0 | 0.637 |
| 0.0 | 0.637 |
| 0.0 | 0.638 |
| 0.0 | 0.638 |
| 0.0 | 0.638 |
| 0.0 | 0.638 |
| 0.0 | 0.638 |
| 0.0 | 0.638 |
| 0.0 | 0.638 |
| 0.0 | 0.638 |
| 0.0 | 0.638 |
| 0.0 | 0.638 |
| 0.0 | 0.639 |
| 0.0 | 0.639 |
| 0.0 | 0.639 |
| 0.0 | 0.639 |
| 0.0 | 0.639 |
| 0.0 | 0.639 |
| 0.0 | 0.639 |
| 0.0 | 0.639 |
| 0.0 | 0.639 |
| 0.0 | 0.639 |
| 0.0 | 0.64 |
| 0.0 | 0.64 |
| 0.0 | 0.64 |
| 0.0 | 0.64 |
| 0.0 | 0.64 |
| 0.0 | 0.64 |
| 0.0 | 0.64 |
| 0.0 | 0.64 |
| 0.0 | 0.64 |
| 0.0 | 0.64 |
| 0.0 | 0.641 |
| 0.0 | 0.641 |
| 0.0 | 0.641 |
| 0.0 | 0.641 |
| 0.0 | 0.641 |
| 0.0 | 0.641 |
| 0.0 | 0.641 |
| 0.0 | 0.641 |
| 0.0 | 0.641 |
| 0.0 | 0.641 |
| 0.0 | 0.642 |
| 0.0 | 0.642 |
| 0.0 | 0.642 |
| 0.0 | 0.642 |
| 0.0 | 0.642 |
| 0.0 | 0.642 |
| 0.0 | 0.642 |
| 0.0 | 0.642 |
| 0.0 | 0.642 |
| 0.0 | 0.642 |
| 0.0 | 0.643 |
| 0.0 | 0.643 |
| 0.0 | 0.643 |
| 0.0 | 0.643 |
| 0.0 | 0.643 |
| 0.0 | 0.643 |
| 0.0 | 0.643 |
| 0.0 | 0.643 |
| 0.0 | 0.643 |
| 0.0 | 0.643 |
| 0.0 | 0.644 |
| 0.0 | 0.644 |
| 0.0 | 0.644 |
| 0.0 | 0.644 |
| 0.0 | 0.644 |
| 0.0 | 0.644 |
| 0.0 | 0.644 |
| 0.0 | 0.644 |
| 0.0 | 0.644 |
| 0.0 | 0.644 |
| 0.0 | 0.645 |
| 0.0 | 0.645 |
| 0.0 | 0.645 |
| 0.0 | 0.645 |
| 0.0 | 0.645 |
| 0.0 | 0.645 |
| 0.0 | 0.645 |
| 0.0 | 0.645 |
| 0.0 | 0.645 |
| 0.0 | 0.645 |
| 0.0 | 0.646 |
| 0.0 | 0.646 |
| 0.0 | 0.646 |
| 0.0 | 0.646 |
| 0.0 | 0.646 |
| 0.0 | 0.646 |
| 0.0 | 0.646 |
| 0.0 | 0.646 |
| 0.0 | 0.646 |
| 0.0 | 0.646 |
| 0.0 | 0.647 |
| 0.0 | 0.647 |
| 0.0 | 0.647 |
| 0.0 | 0.647 |
| 0.0 | 0.647 |
| 0.0 | 0.647 |
| 0.0 | 0.647 |
| 0.0 | 0.647 |
| 0.0 | 0.647 |
| 0.0 | 0.647 |
| 0.0 | 0.648 |
| 0.0 | 0.648 |
| 0.0 | 0.648 |
| 0.0 | 0.648 |
| 0.0 | 0.648 |
| 0.0 | 0.648 |
| 0.0 | 0.648 |
| 0.0 | 0.648 |
| 0.0 | 0.648 |
| 0.0 | 0.648 |
| 0.0 | 0.649 |
| 0.0 | 0.649 |
| 0.0 | 0.649 |
| 0.0 | 0.649 |
| 0.0 | 0.649 |
| 0.0 | 0.649 |
| 0.0 | 0.649 |
| 0.0 | 0.649 |
| 0.0 | 0.649 |
| 0.0 | 0.649 |
| 0.0 | 0.65 |
| 0.0 | 0.65 |
| 0.0 | 0.65 |
| 0.0 | 0.65 |
| 0.0 | 0.65 |
| 0.0 | 0.65 |
| 0.0 | 0.65 |
| 0.0 | 0.65 |
| 0.0 | 0.65 |
| 0.0 | 0.65 |
| 0.0 | 0.651 |
| 0.0 | 0.651 |
| 0.0 | 0.651 |
| 0.0 | 0.651 |
| 0.0 | 0.651 |
| 0.0 | 0.651 |
| 0.0 | 0.651 |
| 0.0 | 0.651 |
| 0.0 | 0.651 |
| 0.0 | 0.651 |
| 0.0 | 0.652 |
| 0.0 | 0.652 |
| 0.0 | 0.652 |
| 0.0 | 0.652 |
| 0.0 | 0.652 |
| 0.0 | 0.652 |
| 0.0 | 0.652 |
| 0.0 | 0.652 |
| 0.0 | 0.652 |
| 0.0 | 0.652 |
| 0.0 | 0.653 |
| 0.0 | 0.653 |
| 0.0 | 0.653 |
| 0.0 | 0.653 |
| 0.0 | 0.653 |
| 0.0 | 0.653 |
| 0.0 | 0.653 |
| 0.0 | 0.653 |
| 0.0 | 0.653 |
| 0.0 | 0.653 |
| 0.0 | 0.654 |
| 0.0 | 0.654 |
| 0.0 | 0.654 |
| 0.0 | 0.654 |
| 0.0 | 0.654 |
| 0.0 | 0.654 |
| 0.0 | 0.654 |
| 0.0 | 0.654 |
| 0.0 | 0.654 |
| 0.0 | 0.654 |
| 0.0 | 0.655 |
| 0.0 | 0.655 |
| 0.0 | 0.655 |
| 0.0 | 0.655 |
| 0.0 | 0.655 |
| 0.0 | 0.655 |
| 0.0 | 0.655 |
| 0.0 | 0.655 |
| 0.0 | 0.655 |
| 0.0 | 0.655 |
| 0.0 | 0.656 |
| 0.0 | 0.656 |
| 0.0 | 0.656 |
| 0.0 | 0.656 |
| 0.0 | 0.656 |
| 0.0 | 0.656 |
| 0.0 | 0.656 |
| 0.0 | 0.656 |
| 0.0 | 0.656 |
| 0.0 | 0.656 |
| 0.0 | 0.657 |
| 0.0 | 0.657 |
| 0.0 | 0.657 |
| 0.0 | 0.657 |
| 0.0 | 0.657 |
| 0.0 | 0.657 |
| 0.0 | 0.657 |
| 0.0 | 0.657 |
| 0.0 | 0.657 |
| 0.0 | 0.657 |
| 0.0 | 0.658 |
| 0.0 | 0.658 |
| 0.0 | 0.658 |
| 0.0 | 0.658 |
| 0.0 | 0.658 |
| 0.0 | 0.658 |
| 0.0 | 0.658 |
| 0.0 | 0.658 |
| 0.0 | 0.658 |
| 0.0 | 0.658 |
| 0.0 | 0.659 |
| 0.0 | 0.659 |
| 0.0 | 0.659 |
| 0.0 | 0.659 |
| 0.0 | 0.659 |
| 0.0 | 0.659 |
| 0.0 | 0.659 |
| 0.0 | 0.659 |
| 0.0 | 0.659 |
| 0.0 | 0.659 |
| 0.0 | 0.66 |
| 0.0 | 0.66 |
| 0.0 | 0.66 |
| 0.0 | 0.66 |
| 0.0 | 0.66 |
| 0.0 | 0.66 |
| 0.0 | 0.66 |
| 0.0 | 0.66 |
| 0.0 | 0.66 |
| 0.0 | 0.66 |
| 0.0 | 0.661 |
| 0.0 | 0.661 |
| 0.0 | 0.661 |
| 0.0 | 0.661 |
| 0.0 | 0.661 |
| 0.0 | 0.661 |
| 0.0 | 0.661 |
| 0.0 | 0.661 |
| 0.0 | 0.661 |
| 0.0 | 0.661 |
| 0.0 | 0.662 |
| 0.0 | 0.662 |
| 0.0 | 0.662 |
| 0.0 | 0.662 |
| 0.0 | 0.662 |
| 0.0 | 0.662 |
| 0.0 | 0.662 |
| 0.0 | 0.662 |
| 0.0 | 0.662 |
| 0.0 | 0.662 |
| 0.0 | 0.663 |
| 0.0 | 0.663 |
| 0.0 | 0.663 |
| 0.0 | 0.663 |
| 0.0 | 0.663 |
| 0.0 | 0.663 |
| 0.0 | 0.663 |
| 0.0 | 0.663 |
| 0.0 | 0.663 |
| 0.0 | 0.663 |
| 0.0 | 0.664 |
| 0.0 | 0.664 |
| 0.0 | 0.664 |
| 0.0 | 0.664 |
| 0.0 | 0.664 |
| 0.0 | 0.664 |
| 0.0 | 0.664 |
| 0.0 | 0.664 |
| 0.0 | 0.664 |
| 0.0 | 0.664 |
| 0.0 | 0.665 |
| 0.0 | 0.665 |
| 0.0 | 0.665 |
| 0.0 | 0.665 |
| 0.0 | 0.665 |
| 0.0 | 0.665 |
| 0.0 | 0.665 |
| 0.0 | 0.665 |
| 0.0 | 0.665 |
| 0.0 | 0.665 |
| 0.0 | 0.666 |
| 0.0 | 0.666 |
| 0.0 | 0.666 |
| 0.0 | 0.666 |
| 0.0 | 0.666 |
| 0.0 | 0.666 |
| 0.0 | 0.666 |
| 0.0 | 0.666 |
| 0.0 | 0.666 |
| 0.0 | 0.666 |
| 0.0 | 0.667 |
| 0.0 | 0.667 |
| 0.0 | 0.667 |
| 0.0 | 0.667 |
| 0.0 | 0.667 |
| 0.0 | 0.667 |
| 0.0 | 0.667 |
| 0.0 | 0.667 |
| 0.0 | 0.667 |
| 0.0 | 0.667 |
| 0.0 | 0.668 |
| 0.0 | 0.668 |
| 0.0 | 0.668 |
| 0.0 | 0.668 |
| 0.0 | 0.668 |
| 0.0 | 0.668 |
| 0.0 | 0.668 |
| 0.0 | 0.668 |
| 0.0 | 0.668 |
| 0.0 | 0.668 |
| 0.0 | 0.669 |
| 0.0 | 0.669 |
| 0.0 | 0.669 |
| 0.0 | 0.669 |
| 0.0 | 0.669 |
| 0.0 | 0.669 |
| 0.0 | 0.669 |
| 0.0 | 0.669 |
| 0.0 | 0.669 |
| 0.0 | 0.669 |
| 0.0 | 0.67 |
| 0.0 | 0.67 |
| 0.0 | 0.67 |
| 0.0 | 0.67 |
| 0.0 | 0.67 |
| 0.0 | 0.67 |
| 0.0 | 0.67 |
| 0.0 | 0.67 |
| 0.0 | 0.67 |
| 0.0 | 0.67 |
| 0.0 | 0.671 |
| 0.0 | 0.671 |
| 0.0 | 0.671 |
| 0.0 | 0.671 |
| 0.0 | 0.671 |
| 0.0 | 0.671 |
| 0.0 | 0.671 |
| 0.0 | 0.671 |
| 0.0 | 0.671 |
| 0.0 | 0.671 |
| 0.0 | 0.672 |
| 0.0 | 0.672 |
| 0.0 | 0.672 |
| 0.0 | 0.672 |
| 0.0 | 0.672 |
| 0.0 | 0.672 |
| 0.0 | 0.672 |
| 0.0 | 0.672 |
| 0.0 | 0.672 |
| 0.0 | 0.672 |
| 0.0 | 0.673 |
| 0.0 | 0.673 |
| 0.0 | 0.673 |
| 0.0 | 0.673 |
| 0.0 | 0.673 |
| 0.0 | 0.673 |
| 0.0 | 0.673 |
| 0.0 | 0.673 |
| 0.0 | 0.673 |
| 0.0 | 0.673 |
| 0.0 | 0.674 |
| 0.0 | 0.674 |
| 0.0 | 0.674 |
| 0.0 | 0.674 |
| 0.0 | 0.674 |
| 0.0 | 0.674 |
| 0.0 | 0.674 |
| 0.0 | 0.674 |
| 0.0 | 0.674 |
| 0.0 | 0.674 |
| 0.0 | 0.675 |
| 0.0 | 0.675 |
| 0.0 | 0.675 |
| 0.0 | 0.675 |
| 0.0 | 0.675 |
| 0.0 | 0.675 |
| 0.0 | 0.675 |
| 0.0 | 0.675 |
| 0.0 | 0.675 |
| 0.0 | 0.675 |
| 0.0 | 0.676 |
| 0.0 | 0.676 |
| 0.0 | 0.676 |
| 0.0 | 0.676 |
| 0.0 | 0.676 |
| 0.0 | 0.676 |
| 0.0 | 0.676 |
| 0.0 | 0.676 |
| 0.0 | 0.676 |
| 0.0 | 0.676 |
| 0.0 | 0.677 |
| 0.0 | 0.677 |
| 0.0 | 0.677 |
| 0.0 | 0.677 |
| 0.0 | 0.677 |
| 0.0 | 0.677 |
| 0.0 | 0.677 |
| 0.0 | 0.677 |
| 0.0 | 0.677 |
| 0.0 | 0.677 |
| 0.0 | 0.678 |
| 0.0 | 0.678 |
| 0.0 | 0.678 |
| 0.0 | 0.678 |
| 0.0 | 0.678 |
| 0.0 | 0.678 |
| 0.0 | 0.678 |
| 0.0 | 0.678 |
| 0.0 | 0.678 |
| 0.0 | 0.678 |
| 0.0 | 0.679 |
| 0.0 | 0.679 |
| 0.0 | 0.679 |
| 0.0 | 0.679 |
| 0.0 | 0.679 |
| 0.0 | 0.679 |
| 0.0 | 0.679 |
| 0.0 | 0.679 |
| 0.0 | 0.679 |
| 0.0 | 0.679 |
| 0.0 | 0.68 |
| 0.0 | 0.68 |
| 0.0 | 0.68 |
| 0.0 | 0.68 |
| 0.0 | 0.68 |
| 0.0 | 0.68 |
| 0.0 | 0.68 |
| 0.0 | 0.68 |
| 0.0 | 0.68 |
| 0.0 | 0.68 |
| 0.0 | 0.681 |
| 0.0 | 0.681 |
| 0.0 | 0.681 |
| 0.0 | 0.681 |
| 0.0 | 0.681 |
| 0.0 | 0.681 |
| 0.0 | 0.681 |
| 0.0 | 0.681 |
| 0.0 | 0.681 |
| 0.0 | 0.681 |
| 0.0 | 0.682 |
| 0.0 | 0.682 |
| 0.0 | 0.682 |
| 0.0 | 0.682 |
| 0.0 | 0.682 |
| 0.0 | 0.682 |
| 0.0 | 0.682 |
| 0.0 | 0.682 |
| 0.0 | 0.682 |
| 0.0 | 0.682 |
| 0.0 | 0.683 |
| 0.0 | 0.683 |
| 0.0 | 0.683 |
| 0.0 | 0.683 |
| 0.0 | 0.683 |
| 0.0 | 0.683 |
| 0.0 | 0.683 |
| 0.0 | 0.683 |
| 0.0 | 0.683 |
| 0.0 | 0.683 |
| 0.0 | 0.684 |
| 0.0 | 0.684 |
| 0.0 | 0.684 |
| 0.0 | 0.684 |
| 0.0 | 0.684 |
| 0.0 | 0.684 |
| 0.0 | 0.684 |
| 0.0 | 0.684 |
| 0.0 | 0.684 |
| 0.0 | 0.684 |
| 0.0 | 0.685 |
| 0.0 | 0.685 |
| 0.0 | 0.685 |
| 0.0 | 0.685 |
| 0.0 | 0.685 |
| 0.0 | 0.685 |
| 0.0 | 0.685 |
| 0.0 | 0.685 |
| 0.0 | 0.685 |
| 0.0 | 0.685 |
| 0.0 | 0.686 |
| 0.0 | 0.686 |
| 0.0 | 0.686 |
| 0.0 | 0.686 |
| 0.0 | 0.686 |
| 0.0 | 0.686 |
| 0.0 | 0.686 |
| 0.0 | 0.686 |
| 0.0 | 0.686 |
| 0.0 | 0.686 |
| 0.0 | 0.687 |
| 0.0 | 0.687 |
| 0.0 | 0.687 |
| 0.0 | 0.687 |
| 0.0 | 0.687 |
| 0.0 | 0.687 |
| 0.0 | 0.687 |
| 0.0 | 0.687 |
| 0.0 | 0.687 |
| 0.0 | 0.687 |
| 0.0 | 0.688 |
| 0.0 | 0.688 |
| 0.0 | 0.688 |
| 0.0 | 0.688 |
| 0.0 | 0.688 |
| 0.0 | 0.688 |
| 0.0 | 0.688 |
| 0.0 | 0.688 |
| 0.0 | 0.688 |
| 0.0 | 0.688 |
| 0.0 | 0.689 |
| 0.0 | 0.689 |
| 0.0 | 0.689 |
| 0.0 | 0.689 |
| 0.0 | 0.689 |
| 0.0 | 0.689 |
| 0.0 | 0.689 |
| 0.0 | 0.689 |
| 0.0 | 0.689 |
| 0.0 | 0.689 |
| 0.0 | 0.69 |
| 0.0 | 0.69 |
| 0.0 | 0.69 |
| 0.0 | 0.69 |
| 0.0 | 0.69 |
| 0.0 | 0.69 |
| 0.0 | 0.69 |
| 0.0 | 0.69 |
| 0.0 | 0.69 |
| 0.0 | 0.69 |
| 0.0 | 0.691 |
| 0.0 | 0.691 |
| 0.0 | 0.691 |
| 0.0 | 0.691 |
| 0.0 | 0.691 |
| 0.0 | 0.691 |
| 0.0 | 0.691 |
| 0.0 | 0.691 |
| 0.0 | 0.691 |
| 0.0 | 0.691 |
| 0.0 | 0.692 |
| 0.0 | 0.692 |
| 0.0 | 0.692 |
| 0.0 | 0.692 |
| 0.0 | 0.692 |
| 0.0 | 0.692 |
| 0.0 | 0.692 |
| 0.0 | 0.692 |
| 0.0 | 0.692 |
| 0.0 | 0.692 |
| 0.0 | 0.693 |
| 0.0 | 0.693 |
| 0.0 | 0.693 |
| 0.0 | 0.693 |
| 0.0 | 0.693 |
| 0.0 | 0.693 |
| 0.0 | 0.693 |
| 0.0 | 0.693 |
| 0.0 | 0.693 |
| 0.0 | 0.693 |
| 0.0 | 0.694 |
| 0.0 | 0.694 |
| 0.0 | 0.694 |
| 0.0 | 0.694 |
| 0.0 | 0.694 |
| 0.0 | 0.694 |
| 0.0 | 0.694 |
| 0.0 | 0.694 |
| 0.0 | 0.694 |
| 0.0 | 0.694 |
| 0.0 | 0.695 |
| 0.0 | 0.695 |
| 0.0 | 0.695 |
| 0.0 | 0.695 |
| 0.0 | 0.695 |
| 0.0 | 0.695 |
| 0.0 | 0.695 |
| 0.0 | 0.695 |
| 0.0 | 0.695 |
| 0.0 | 0.695 |
| 0.0 | 0.696 |
| 0.0 | 0.696 |
| 0.0 | 0.696 |
| 0.0 | 0.696 |
| 0.0 | 0.696 |
| 0.0 | 0.696 |
| 0.0 | 0.696 |
| 0.0 | 0.696 |
| 0.0 | 0.696 |
| 0.0 | 0.696 |
| 0.0 | 0.697 |
| 0.0 | 0.697 |
| 0.0 | 0.697 |
| 0.0 | 0.697 |
| 0.0 | 0.697 |
| 0.0 | 0.697 |
| 0.0 | 0.697 |
| 0.0 | 0.697 |
| 0.0 | 0.697 |
| 0.0 | 0.697 |
| 0.0 | 0.698 |
| 0.0 | 0.698 |
| 0.0 | 0.698 |
| 0.0 | 0.698 |
| 0.0 | 0.698 |
| 0.0 | 0.698 |
| 0.0 | 0.698 |
| 0.0 | 0.698 |
| 0.0 | 0.698 |
| 0.0 | 0.698 |
| 0.0 | 0.699 |
| 0.0 | 0.699 |
| 0.0 | 0.699 |
| 0.0 | 0.699 |
| 0.0 | 0.699 |
| 0.0 | 0.699 |
| 0.0 | 0.699 |
| 0.0 | 0.699 |
| 0.0 | 0.699 |
| 0.0 | 0.699 |
| 0.0 | 0.7 |
| 0.0 | 0.7 |
| 0.0 | 0.7 |
| 0.0 | 0.7 |
| 0.0 | 0.7 |
| 0.0 | 0.7 |
| 0.0 | 0.7 |
| 0.0 | 0.7 |
| 0.0 | 0.7 |
| 0.0 | 0.7 |
| 0.0 | 0.701 |
| 0.0 | 0.701 |
| 0.0 | 0.701 |
| 0.0 | 0.701 |
| 0.0 | 0.701 |
| 0.0 | 0.701 |
| 0.0 | 0.701 |
| 0.0 | 0.701 |
| 0.0 | 0.701 |
| 0.0 | 0.701 |
| 0.0 | 0.702 |
| 0.0 | 0.702 |
| 0.0 | 0.702 |
| 0.0 | 0.702 |
| 0.0 | 0.702 |
| 0.0 | 0.702 |
| 0.0 | 0.702 |
| 0.0 | 0.702 |
| 0.0 | 0.702 |
| 0.0 | 0.702 |
| 0.0 | 0.703 |
| 0.0 | 0.703 |
| 0.0 | 0.703 |
| 0.0 | 0.703 |
| 0.0 | 0.703 |
| 0.0 | 0.703 |
| 0.0 | 0.703 |
| 0.0 | 0.703 |
| 0.0 | 0.703 |
| 0.0 | 0.703 |
| 0.0 | 0.704 |
| 0.0 | 0.704 |
| 0.0 | 0.704 |
| 0.0 | 0.704 |
| 0.0 | 0.704 |
| 0.0 | 0.704 |
| 0.0 | 0.704 |
| 0.0 | 0.704 |
| 0.0 | 0.704 |
| 0.0 | 0.704 |
| 0.0 | 0.705 |
| 0.0 | 0.705 |
| 0.0 | 0.705 |
| 0.0 | 0.705 |
| 0.0 | 0.705 |
| 0.0 | 0.705 |
| 0.0 | 0.705 |
| 0.0 | 0.705 |
| 0.0 | 0.705 |
| 0.0 | 0.705 |
| 0.0 | 0.706 |
| 0.0 | 0.706 |
| 0.0 | 0.706 |
| 0.0 | 0.706 |
| 0.0 | 0.706 |
| 0.0 | 0.706 |
| 0.0 | 0.706 |
| 0.0 | 0.706 |
| 0.0 | 0.706 |
| 0.0 | 0.706 |
| 0.0 | 0.707 |
| 0.0 | 0.707 |
| 0.0 | 0.707 |
| 0.0 | 0.707 |
| 0.0 | 0.707 |
| 0.0 | 0.707 |
| 0.0 | 0.707 |
| 0.0 | 0.707 |
| 0.0 | 0.707 |
| 0.0 | 0.707 |
| 0.0 | 0.708 |
| 0.0 | 0.708 |
| 0.0 | 0.708 |
| 0.0 | 0.708 |
| 0.0 | 0.708 |
| 0.0 | 0.708 |
| 0.0 | 0.708 |
| 0.0 | 0.708 |
| 0.0 | 0.708 |
| 0.0 | 0.708 |
| 0.0 | 0.709 |
| 0.0 | 0.709 |
| 0.0 | 0.709 |
| 0.0 | 0.709 |
| 0.0 | 0.709 |
| 0.0 | 0.709 |
| 0.0 | 0.709 |
| 0.0 | 0.709 |
| 0.0 | 0.709 |
| 0.0 | 0.709 |
| 0.0 | 0.71 |
| 0.0 | 0.71 |
| 0.0 | 0.71 |
| 0.0 | 0.71 |
| 0.0 | 0.71 |
| 0.0 | 0.71 |
| 0.0 | 0.71 |
| 0.0 | 0.71 |
| 0.0 | 0.71 |
| 0.0 | 0.71 |
| 0.0 | 0.711 |
| 0.0 | 0.711 |
| 0.0 | 0.711 |
| 0.0 | 0.711 |
| 0.0 | 0.711 |
| 0.0 | 0.711 |
| 0.0 | 0.711 |
| 0.0 | 0.711 |
| 0.0 | 0.711 |
| 0.0 | 0.711 |
| 0.0 | 0.712 |
| 0.0 | 0.712 |
| 0.0 | 0.712 |
| 0.0 | 0.712 |
| 0.0 | 0.712 |
| 0.0 | 0.712 |
| 0.0 | 0.712 |
| 0.0 | 0.712 |
| 0.0 | 0.712 |
| 0.0 | 0.712 |
| 0.0 | 0.713 |
| 0.0 | 0.713 |
| 0.0 | 0.713 |
| 0.0 | 0.713 |
| 0.0 | 0.713 |
| 0.0 | 0.713 |
| 0.0 | 0.713 |
| 0.0 | 0.713 |
| 0.0 | 0.713 |
| 0.0 | 0.713 |
| 0.0 | 0.714 |
| 0.0 | 0.714 |
| 0.0 | 0.714 |
| 0.0 | 0.714 |
| 0.0 | 0.714 |
| 0.0 | 0.714 |
| 0.0 | 0.714 |
| 0.0 | 0.714 |
| 0.0 | 0.714 |
| 0.0 | 0.714 |
| 0.0 | 0.715 |
| 0.0 | 0.715 |
| 0.0 | 0.715 |
| 0.0 | 0.715 |
| 0.0 | 0.715 |
| 0.0 | 0.715 |
| 0.0 | 0.715 |
| 0.0 | 0.715 |
| 0.0 | 0.715 |
| 0.0 | 0.715 |
| 0.0 | 0.716 |
| 0.0 | 0.716 |
| 0.0 | 0.716 |
| 0.0 | 0.716 |
| 0.0 | 0.716 |
| 0.0 | 0.716 |
| 0.0 | 0.716 |
| 0.0 | 0.716 |
| 0.0 | 0.716 |
| 0.0 | 0.716 |
| 0.0 | 0.717 |
| 0.0 | 0.717 |
| 0.0 | 0.717 |
| 0.0 | 0.717 |
| 0.0 | 0.717 |
| 0.0 | 0.717 |
| 0.0 | 0.717 |
| 0.0 | 0.717 |
| 0.0 | 0.717 |
| 0.0 | 0.717 |
| 0.0 | 0.718 |
| 0.0 | 0.718 |
| 0.0 | 0.718 |
| 0.0 | 0.718 |
| 0.0 | 0.718 |
| 0.0 | 0.718 |
| 0.0 | 0.718 |
| 0.0 | 0.718 |
| 0.0 | 0.718 |
| 0.0 | 0.718 |
| 0.0 | 0.719 |
| 0.0 | 0.719 |
| 0.0 | 0.719 |
| 0.0 | 0.719 |
| 0.0 | 0.719 |
| 0.0 | 0.719 |
| 0.0 | 0.719 |
| 0.0 | 0.719 |
| 0.0 | 0.719 |
| 0.0 | 0.719 |
| 0.0 | 0.72 |
| 0.0 | 0.72 |
| 0.0 | 0.72 |
| 0.0 | 0.72 |
| 0.0 | 0.72 |
| 0.0 | 0.72 |
| 0.0 | 0.72 |
| 0.0 | 0.72 |
| 0.0 | 0.72 |
| 0.0 | 0.72 |
| 0.0 | 0.721 |
| 0.0 | 0.721 |
| 0.0 | 0.721 |
| 0.0 | 0.721 |
| 0.0 | 0.721 |
| 0.0 | 0.721 |
| 0.0 | 0.721 |
| 0.0 | 0.721 |
| 0.0 | 0.721 |
| 0.0 | 0.721 |
| 0.0 | 0.722 |
| 0.0 | 0.722 |
| 0.0 | 0.722 |
| 0.0 | 0.722 |
| 0.0 | 0.722 |
| 0.0 | 0.722 |
| 0.0 | 0.722 |
| 0.0 | 0.722 |
| 0.0 | 0.722 |
| 0.0 | 0.722 |
| 0.0 | 0.723 |
| 0.0 | 0.723 |
| 0.0 | 0.723 |
| 0.0 | 0.723 |
| 0.0 | 0.723 |
| 0.0 | 0.723 |
| 0.0 | 0.723 |
| 0.0 | 0.723 |
| 0.0 | 0.723 |
| 0.0 | 0.723 |
| 0.0 | 0.724 |
| 0.0 | 0.724 |
| 0.0 | 0.724 |
| 0.0 | 0.724 |
| 0.0 | 0.724 |
| 0.0 | 0.724 |
| 0.0 | 0.724 |
| 0.0 | 0.724 |
| 0.0 | 0.724 |
| 0.0 | 0.724 |
| 0.0 | 0.725 |
| 0.0 | 0.725 |
| 0.0 | 0.725 |
| 0.0 | 0.725 |
| 0.0 | 0.725 |
| 0.0 | 0.725 |
| 0.0 | 0.725 |
| 0.0 | 0.725 |
| 0.0 | 0.725 |
| 0.0 | 0.725 |
| 0.0 | 0.726 |
| 0.0 | 0.726 |
| 0.0 | 0.726 |
| 0.0 | 0.726 |
| 0.0 | 0.726 |
| 0.0 | 0.726 |
| 0.0 | 0.726 |
| 0.0 | 0.726 |
| 0.0 | 0.726 |
| 0.0 | 0.726 |
| 0.0 | 0.727 |
| 0.0 | 0.727 |
| 0.0 | 0.727 |
| 0.0 | 0.727 |
| 0.0 | 0.727 |
| 0.0 | 0.727 |
| 0.0 | 0.727 |
| 0.0 | 0.727 |
| 0.0 | 0.727 |
| 0.0 | 0.727 |
| 0.0 | 0.728 |
| 0.0 | 0.728 |
| 0.0 | 0.728 |
| 0.0 | 0.728 |
| 0.0 | 0.728 |
| 0.0 | 0.728 |
| 0.0 | 0.728 |
| 0.0 | 0.728 |
| 0.0 | 0.728 |
| 0.0 | 0.728 |
| 0.0 | 0.729 |
| 0.0 | 0.729 |
| 0.0 | 0.729 |
| 0.0 | 0.729 |
| 0.0 | 0.729 |
| 0.0 | 0.729 |
| 0.0 | 0.729 |
| 0.0 | 0.729 |
| 0.0 | 0.729 |
| 0.0 | 0.729 |
| 0.0 | 0.73 |
| 0.0 | 0.73 |
| 0.0 | 0.73 |
| 0.0 | 0.73 |
| 0.0 | 0.73 |
| 0.0 | 0.73 |
| 0.0 | 0.73 |
| 0.0 | 0.73 |
| 0.0 | 0.73 |
| 0.0 | 0.73 |
| 0.0 | 0.731 |
| 0.0 | 0.731 |
| 0.0 | 0.731 |
| 0.0 | 0.731 |
| 0.0 | 0.731 |
| 0.0 | 0.731 |
| 0.0 | 0.731 |
| 0.0 | 0.731 |
| 0.0 | 0.731 |
| 0.0 | 0.731 |
| 0.0 | 0.732 |
| 0.0 | 0.732 |
| 0.0 | 0.732 |
| 0.0 | 0.732 |
| 0.0 | 0.732 |
| 0.0 | 0.732 |
| 0.0 | 0.732 |
| 0.0 | 0.732 |
| 0.0 | 0.732 |
| 0.0 | 0.732 |
| 0.0 | 0.733 |
| 0.0 | 0.733 |
| 0.0 | 0.733 |
| 0.0 | 0.733 |
| 0.0 | 0.733 |
| 0.0 | 0.733 |
| 0.0 | 0.733 |
| 0.0 | 0.733 |
| 0.0 | 0.733 |
| 0.0 | 0.733 |
| 0.0 | 0.734 |
| 0.0 | 0.734 |
| 0.0 | 0.734 |
| 0.0 | 0.734 |
| 0.0 | 0.734 |
| 0.0 | 0.734 |
| 0.0 | 0.734 |
| 0.0 | 0.734 |
| 0.0 | 0.734 |
| 0.0 | 0.734 |
| 0.0 | 0.735 |
| 0.0 | 0.735 |
| 0.0 | 0.735 |
| 0.0 | 0.735 |
| 0.0 | 0.735 |
| 0.0 | 0.735 |
| 0.0 | 0.735 |
| 0.0 | 0.735 |
| 0.0 | 0.735 |
| 0.0 | 0.735 |
| 0.0 | 0.736 |
| 0.0 | 0.736 |
| 0.0 | 0.736 |
| 0.0 | 0.736 |
| 0.0 | 0.736 |
| 0.0 | 0.736 |
| 0.0 | 0.736 |
| 0.0 | 0.736 |
| 0.0 | 0.736 |
| 0.0 | 0.736 |
| 0.0 | 0.737 |
| 0.0 | 0.737 |
| 0.0 | 0.737 |
| 0.0 | 0.737 |
| 0.0 | 0.737 |
| 0.0 | 0.737 |
| 0.0 | 0.737 |
| 0.0 | 0.737 |
| 0.0 | 0.737 |
| 0.0 | 0.737 |
| 0.0 | 0.738 |
| 0.0 | 0.738 |
| 0.0 | 0.738 |
| 0.0 | 0.738 |
| 0.0 | 0.738 |
| 0.0 | 0.738 |
| 0.0 | 0.738 |
| 0.0 | 0.738 |
| 0.0 | 0.738 |
| 0.0 | 0.738 |
| 0.0 | 0.739 |
| 0.0 | 0.739 |
| 0.0 | 0.739 |
| 0.0 | 0.739 |
| 0.0 | 0.739 |
| 0.0 | 0.739 |
| 0.0 | 0.739 |
| 0.0 | 0.739 |
| 0.0 | 0.739 |
| 0.0 | 0.739 |
| 0.0 | 0.74 |
| 0.0 | 0.74 |
| 0.0 | 0.74 |
| 0.0 | 0.74 |
| 0.0 | 0.74 |
| 0.0 | 0.74 |
| 0.0 | 0.74 |
| 0.0 | 0.74 |
| 0.0 | 0.74 |
| 0.0 | 0.74 |
| 0.0 | 0.741 |
| 0.0 | 0.741 |
| 0.0 | 0.741 |
| 0.0 | 0.741 |
| 0.0 | 0.741 |
| 0.0 | 0.741 |
| 0.0 | 0.741 |
| 0.0 | 0.741 |
| 0.0 | 0.741 |
| 0.0 | 0.741 |
| 0.0 | 0.742 |
| 0.0 | 0.742 |
| 0.0 | 0.742 |
| 0.0 | 0.742 |
| 0.0 | 0.742 |
| 0.0 | 0.742 |
| 0.0 | 0.742 |
| 0.0 | 0.742 |
| 0.0 | 0.742 |
| 0.0 | 0.742 |
| 0.0 | 0.743 |
| 0.0 | 0.743 |
| 0.0 | 0.743 |
| 0.0 | 0.743 |
| 0.0 | 0.743 |
| 0.0 | 0.743 |
| 0.0 | 0.743 |
| 0.0 | 0.743 |
| 0.0 | 0.743 |
| 0.0 | 0.743 |
| 0.0 | 0.744 |
| 0.0 | 0.744 |
| 0.0 | 0.744 |
| 0.0 | 0.744 |
| 0.0 | 0.744 |
| 0.0 | 0.744 |
| 0.0 | 0.744 |
| 0.0 | 0.744 |
| 0.0 | 0.744 |
| 0.0 | 0.744 |
| 0.0 | 0.745 |
| 0.0 | 0.745 |
| 0.0 | 0.745 |
| 0.0 | 0.745 |
| 0.0 | 0.745 |
| 0.0 | 0.745 |
| 0.0 | 0.745 |
| 0.0 | 0.745 |
| 0.0 | 0.745 |
| 0.0 | 0.745 |
| 0.0 | 0.746 |
| 0.0 | 0.746 |
| 0.0 | 0.746 |
| 0.0 | 0.746 |
| 0.0 | 0.746 |
| 0.0 | 0.746 |
| 0.0 | 0.746 |
| 0.0 | 0.746 |
| 0.0 | 0.746 |
| 0.0 | 0.746 |
| 0.0 | 0.747 |
| 0.0 | 0.747 |
| 0.0 | 0.747 |
| 0.0 | 0.747 |
| 0.0 | 0.747 |
| 0.0 | 0.747 |
| 0.0 | 0.747 |
| 0.0 | 0.747 |
| 0.0 | 0.747 |
| 0.0 | 0.747 |
| 0.0 | 0.748 |
| 0.0 | 0.748 |
| 0.0 | 0.748 |
| 0.0 | 0.748 |
| 0.0 | 0.748 |
| 0.0 | 0.748 |
| 0.0 | 0.748 |
| 0.0 | 0.748 |
| 0.0 | 0.748 |
| 0.0 | 0.748 |
| 0.0 | 0.749 |
| 0.0 | 0.749 |
| 0.0 | 0.749 |
| 0.0 | 0.749 |
| 0.0 | 0.749 |
| 0.0 | 0.749 |
| 0.0 | 0.749 |
| 0.0 | 0.749 |
| 0.0 | 0.749 |
| 0.0 | 0.749 |
| 0.0 | 0.75 |
| 0.0 | 0.75 |
| 0.0 | 0.75 |
| 0.0 | 0.75 |
| 0.0 | 0.75 |
| 0.0 | 0.75 |
| 0.0 | 0.75 |
| 0.0 | 0.75 |
| 0.0 | 0.75 |
| 0.0 | 0.75 |
| 0.0 | 0.751 |
| 0.0 | 0.751 |
| 0.0 | 0.751 |
| 0.0 | 0.751 |
| 0.0 | 0.751 |
| 0.0 | 0.751 |
| 0.0 | 0.751 |
| 0.0 | 0.751 |
| 0.0 | 0.751 |
| 0.0 | 0.751 |
| 0.0 | 0.752 |
| 0.0 | 0.752 |
| 0.0 | 0.752 |
| 0.0 | 0.752 |
| 0.0 | 0.752 |
| 0.0 | 0.752 |
| 0.0 | 0.752 |
| 0.0 | 0.752 |
| 0.0 | 0.752 |
| 0.0 | 0.752 |
| 0.0 | 0.753 |
| 0.0 | 0.753 |
| 0.0 | 0.753 |
| 0.0 | 0.753 |
| 0.0 | 0.753 |
| 0.0 | 0.753 |
| 0.0 | 0.753 |
| 0.0 | 0.753 |
| 0.0 | 0.753 |
| 0.0 | 0.753 |
| 0.0 | 0.754 |
| 0.0 | 0.754 |
| 0.0 | 0.754 |
| 0.0 | 0.754 |
| 0.0 | 0.754 |
| 0.0 | 0.754 |
| 0.0 | 0.754 |
| 0.0 | 0.754 |
| 0.0 | 0.754 |
| 0.0 | 0.754 |
| 0.0 | 0.755 |
| 0.0 | 0.755 |
| 0.0 | 0.755 |
| 0.0 | 0.755 |
| 0.0 | 0.755 |
| 0.0 | 0.755 |
| 0.0 | 0.755 |
| 0.0 | 0.755 |
| 0.0 | 0.755 |
| 0.0 | 0.755 |
| 0.0 | 0.756 |
| 0.0 | 0.756 |
| 0.0 | 0.756 |
| 0.0 | 0.756 |
| 0.0 | 0.756 |
| 0.0 | 0.756 |
| 0.0 | 0.756 |
| 0.0 | 0.756 |
| 0.0 | 0.756 |
| 0.0 | 0.756 |
| 0.0 | 0.757 |
| 0.0 | 0.757 |
| 0.0 | 0.757 |
| 0.0 | 0.757 |
| 0.0 | 0.757 |
| 0.0 | 0.757 |
| 0.0 | 0.757 |
| 0.0 | 0.757 |
| 0.0 | 0.757 |
| 0.0 | 0.757 |
| 0.0 | 0.758 |
| 0.0 | 0.758 |
| 0.0 | 0.758 |
| 0.0 | 0.758 |
| 0.0 | 0.758 |
| 0.0 | 0.758 |
| 0.0 | 0.758 |
| 0.0 | 0.758 |
| 0.0 | 0.758 |
| 0.0 | 0.758 |
| 0.0 | 0.759 |
| 0.0 | 0.759 |
| 0.0 | 0.759 |
| 0.0 | 0.759 |
| 0.0 | 0.759 |
| 0.0 | 0.759 |
| 0.0 | 0.759 |
| 0.0 | 0.759 |
| 0.0 | 0.759 |
| 0.0 | 0.759 |
| 0.0 | 0.76 |
| 0.0 | 0.76 |
| 0.0 | 0.76 |
| 0.0 | 0.76 |
| 0.0 | 0.76 |
| 0.0 | 0.76 |
| 0.0 | 0.76 |
| 0.0 | 0.76 |
| 0.0 | 0.76 |
| 0.0 | 0.76 |
| 0.0 | 0.761 |
| 0.0 | 0.761 |
| 0.0 | 0.761 |
| 0.0 | 0.761 |
| 0.0 | 0.761 |
| 0.0 | 0.761 |
| 0.0 | 0.761 |
| 0.0 | 0.761 |
| 0.0 | 0.761 |
| 0.0 | 0.761 |
| 0.0 | 0.762 |
| 0.0 | 0.762 |
| 0.0 | 0.762 |
| 0.0 | 0.762 |
| 0.0 | 0.762 |
| 0.0 | 0.762 |
| 0.0 | 0.762 |
| 0.0 | 0.762 |
| 0.0 | 0.762 |
| 0.0 | 0.762 |
| 0.0 | 0.763 |
| 0.0 | 0.763 |
| 0.0 | 0.763 |
| 0.0 | 0.763 |
| 0.0 | 0.763 |
| 0.0 | 0.763 |
| 0.0 | 0.763 |
| 0.0 | 0.763 |
| 0.0 | 0.763 |
| 0.0 | 0.763 |
| 0.0 | 0.764 |
| 0.0 | 0.764 |
| 0.0 | 0.764 |
| 0.0 | 0.764 |
| 0.0 | 0.764 |
| 0.0 | 0.764 |
| 0.0 | 0.764 |
| 0.0 | 0.764 |
| 0.0 | 0.764 |
| 0.0 | 0.764 |
| 0.0 | 0.765 |
| 0.0 | 0.765 |
| 0.0 | 0.765 |
| 0.0 | 0.765 |
| 0.0 | 0.765 |
| 0.0 | 0.765 |
| 0.0 | 0.765 |
| 0.0 | 0.765 |
| 0.0 | 0.765 |
| 0.0 | 0.765 |
| 0.0 | 0.766 |
| 0.0 | 0.766 |
| 0.0 | 0.766 |
| 0.0 | 0.766 |
| 0.0 | 0.766 |
| 0.0 | 0.766 |
| 0.0 | 0.766 |
| 0.0 | 0.766 |
| 0.0 | 0.766 |
| 0.0 | 0.766 |
| 0.0 | 0.767 |
| 0.0 | 0.767 |
| 0.0 | 0.767 |
| 0.0 | 0.767 |
| 0.0 | 0.767 |
| 0.0 | 0.767 |
| 0.0 | 0.767 |
| 0.0 | 0.767 |
| 0.0 | 0.767 |
| 0.0 | 0.767 |
| 0.0 | 0.768 |
| 0.0 | 0.768 |
| 0.0 | 0.768 |
| 0.0 | 0.768 |
| 0.0 | 0.768 |
| 0.0 | 0.768 |
| 0.0 | 0.768 |
| 0.0 | 0.768 |
| 0.0 | 0.768 |
| 0.0 | 0.768 |
| 0.0 | 0.769 |
| 0.0 | 0.769 |
| 0.0 | 0.769 |
| 0.0 | 0.769 |
| 0.0 | 0.769 |
| 0.0 | 0.769 |
| 0.0 | 0.769 |
| 0.0 | 0.769 |
| 0.0 | 0.769 |
| 0.0 | 0.769 |
| 0.0 | 0.77 |
| 0.0 | 0.77 |
| 0.0 | 0.77 |
| 0.0 | 0.77 |
| 0.0 | 0.77 |
| 0.0 | 0.77 |
| 0.0 | 0.77 |
| 0.0 | 0.77 |
| 0.0 | 0.77 |
| 0.0 | 0.77 |
| 0.0 | 0.771 |
| 0.0 | 0.771 |
| 0.0 | 0.771 |
| 0.0 | 0.771 |
| 0.0 | 0.771 |
| 0.0 | 0.771 |
| 0.0 | 0.771 |
| 0.0 | 0.771 |
| 0.0 | 0.771 |
| 0.0 | 0.771 |
| 0.0 | 0.772 |
| 0.0 | 0.772 |
| 0.0 | 0.772 |
| 0.0 | 0.772 |
| 0.0 | 0.772 |
| 0.0 | 0.772 |
| 0.0 | 0.772 |
| 0.0 | 0.772 |
| 0.0 | 0.772 |
| 0.0 | 0.772 |
| 0.0 | 0.773 |
| 0.0 | 0.773 |
| 0.0 | 0.773 |
| 0.0 | 0.773 |
| 0.0 | 0.773 |
| 0.0 | 0.773 |
| 0.0 | 0.773 |
| 0.0 | 0.773 |
| 0.0 | 0.773 |
| 0.0 | 0.773 |
| 0.0 | 0.774 |
| 0.0 | 0.774 |
| 0.0 | 0.774 |
| 0.0 | 0.774 |
| 0.0 | 0.774 |
| 0.0 | 0.774 |
| 0.0 | 0.774 |
| 0.0 | 0.774 |
| 0.0 | 0.774 |
| 0.0 | 0.774 |
| 0.0 | 0.775 |
| 0.0 | 0.775 |
| 0.0 | 0.775 |
| 0.0 | 0.775 |
| 0.0 | 0.775 |
| 0.0 | 0.775 |
| 0.0 | 0.775 |
| 0.0 | 0.775 |
| 0.0 | 0.775 |
| 0.0 | 0.775 |
| 0.0 | 0.776 |
| 0.0 | 0.776 |
| 0.0 | 0.776 |
| 0.0 | 0.776 |
| 0.0 | 0.776 |
| 0.0 | 0.776 |
| 0.0 | 0.776 |
| 0.0 | 0.776 |
| 0.0 | 0.776 |
| 0.0 | 0.776 |
| 0.0 | 0.777 |
| 0.0 | 0.777 |
| 0.0 | 0.777 |
| 0.0 | 0.777 |
| 0.0 | 0.777 |
| 0.0 | 0.777 |
| 0.0 | 0.777 |
| 0.0 | 0.777 |
| 0.0 | 0.777 |
| 0.0 | 0.777 |
| 0.0 | 0.778 |
| 0.0 | 0.778 |
| 0.0 | 0.778 |
| 0.0 | 0.778 |
| 0.0 | 0.778 |
| 0.0 | 0.778 |
| 0.0 | 0.778 |
| 0.0 | 0.778 |
| 0.0 | 0.778 |
| 0.0 | 0.778 |
| 0.0 | 0.779 |
| 0.0 | 0.779 |
| 0.0 | 0.779 |
| 0.0 | 0.779 |
| 0.0 | 0.779 |
| 0.0 | 0.779 |
| 0.0 | 0.779 |
| 0.0 | 0.779 |
| 0.0 | 0.779 |
| 0.0 | 0.779 |
| 0.0 | 0.78 |
| 0.0 | 0.78 |
| 0.0 | 0.78 |
| 0.0 | 0.78 |
| 0.0 | 0.78 |
| 0.0 | 0.78 |
| 0.0 | 0.78 |
| 0.0 | 0.78 |
| 0.0 | 0.78 |
| 0.0 | 0.78 |
| 0.0 | 0.781 |
| 0.0 | 0.781 |
| 0.0 | 0.781 |
| 0.0 | 0.781 |
| 0.0 | 0.781 |
| 0.0 | 0.781 |
| 0.0 | 0.781 |
| 0.0 | 0.781 |
| 0.0 | 0.781 |
| 0.0 | 0.781 |
| 0.0 | 0.782 |
| 0.0 | 0.782 |
| 0.0 | 0.782 |
| 0.0 | 0.782 |
| 0.0 | 0.782 |
| 0.0 | 0.782 |
| 0.0 | 0.782 |
| 0.0 | 0.782 |
| 0.0 | 0.782 |
| 0.0 | 0.782 |
| 0.0 | 0.783 |
| 0.0 | 0.783 |
| 0.0 | 0.783 |
| 0.0 | 0.783 |
| 0.0 | 0.783 |
| 0.0 | 0.783 |
| 0.0 | 0.783 |
| 0.0 | 0.783 |
| 0.0 | 0.783 |
| 0.0 | 0.783 |
| 0.0 | 0.784 |
| 0.0 | 0.784 |
| 0.0 | 0.784 |
| 0.0 | 0.784 |
| 0.0 | 0.784 |
| 0.0 | 0.784 |
| 0.0 | 0.784 |
| 0.0 | 0.784 |
| 0.0 | 0.784 |
| 0.0 | 0.784 |
| 0.0 | 0.785 |
| 0.0 | 0.785 |
| 0.0 | 0.785 |
| 0.0 | 0.785 |
| 0.0 | 0.785 |
| 0.0 | 0.785 |
| 0.0 | 0.785 |
| 0.0 | 0.785 |
| 0.0 | 0.785 |
| 0.0 | 0.785 |
| 0.0 | 0.786 |
| 0.0 | 0.786 |
| 0.0 | 0.786 |
| 0.0 | 0.786 |
| 0.0 | 0.786 |
| 0.0 | 0.786 |
| 0.0 | 0.786 |
| 0.0 | 0.786 |
| 0.0 | 0.786 |
| 0.0 | 0.786 |
| 0.0 | 0.787 |
| 0.0 | 0.787 |
| 0.0 | 0.787 |
| 0.0 | 0.787 |
| 0.0 | 0.787 |
| 0.0 | 0.787 |
| 0.0 | 0.787 |
| 0.0 | 0.787 |
| 0.0 | 0.787 |
| 0.0 | 0.787 |
| 0.0 | 0.788 |
| 0.0 | 0.788 |
| 0.0 | 0.788 |
| 0.0 | 0.788 |
| 0.0 | 0.788 |
| 0.0 | 0.788 |
| 0.0 | 0.788 |
| 0.0 | 0.788 |
| 0.0 | 0.788 |
| 0.0 | 0.788 |
| 0.0 | 0.789 |
| 0.0 | 0.789 |
| 0.0 | 0.789 |
| 0.0 | 0.789 |
| 0.0 | 0.789 |
| 0.0 | 0.789 |
| 0.0 | 0.789 |
| 0.0 | 0.789 |
| 0.0 | 0.789 |
| 0.0 | 0.789 |
| 0.0 | 0.79 |
| 0.0 | 0.79 |
| 0.0 | 0.79 |
| 0.0 | 0.79 |
| 0.0 | 0.79 |
| 0.0 | 0.79 |
| 0.0 | 0.79 |
| 0.0 | 0.79 |
| 0.0 | 0.79 |
| 0.0 | 0.79 |
| 0.0 | 0.791 |
| 0.0 | 0.791 |
| 0.0 | 0.791 |
| 0.0 | 0.791 |
| 0.0 | 0.791 |
| 0.0 | 0.791 |
| 0.0 | 0.791 |
| 0.0 | 0.791 |
| 0.0 | 0.791 |
| 0.0 | 0.791 |
| 0.0 | 0.792 |
| 0.0 | 0.792 |
| 0.0 | 0.792 |
| 0.0 | 0.792 |
| 0.0 | 0.792 |
| 0.0 | 0.792 |
| 0.0 | 0.792 |
| 0.0 | 0.792 |
| 0.0 | 0.792 |
| 0.0 | 0.792 |
| 0.0 | 0.793 |
| 0.0 | 0.793 |
| 0.0 | 0.793 |
| 0.0 | 0.793 |
| 0.0 | 0.793 |
| 0.0 | 0.793 |
| 0.0 | 0.793 |
| 0.0 | 0.793 |
| 0.0 | 0.793 |
| 0.0 | 0.793 |
| 0.0 | 0.794 |
| 0.0 | 0.794 |
| 0.0 | 0.794 |
| 0.0 | 0.794 |
| 0.0 | 0.794 |
| 0.0 | 0.794 |
| 0.0 | 0.794 |
| 0.0 | 0.794 |
| 0.0 | 0.794 |
| 0.0 | 0.794 |
| 0.0 | 0.795 |
| 0.0 | 0.795 |
| 0.0 | 0.795 |
| 0.0 | 0.795 |
| 0.0 | 0.795 |
| 0.0 | 0.795 |
| 0.0 | 0.795 |
| 0.0 | 0.795 |
| 0.0 | 0.795 |
| 0.0 | 0.795 |
| 0.0 | 0.796 |
| 0.0 | 0.796 |
| 0.0 | 0.796 |
| 0.0 | 0.796 |
| 0.0 | 0.796 |
| 0.0 | 0.796 |
| 0.0 | 0.796 |
| 0.0 | 0.796 |
| 0.0 | 0.796 |
| 0.0 | 0.796 |
| 0.0 | 0.797 |
| 0.0 | 0.797 |
| 0.0 | 0.797 |
| 0.0 | 0.797 |
| 0.0 | 0.797 |
| 0.0 | 0.797 |
| 0.0 | 0.797 |
| 0.0 | 0.797 |
| 0.0 | 0.797 |
| 0.0 | 0.797 |
| 0.0 | 0.798 |
| 0.0 | 0.798 |
| 0.0 | 0.798 |
| 0.0 | 0.798 |
| 0.0 | 0.798 |
| 0.0 | 0.798 |
| 0.0 | 0.798 |
| 0.0 | 0.798 |
| 0.0 | 0.798 |
| 0.0 | 0.798 |
| 0.0 | 0.799 |
| 0.0 | 0.799 |
| 0.0 | 0.799 |
| 0.0 | 0.799 |
| 0.0 | 0.799 |
| 0.0 | 0.799 |
| 0.0 | 0.799 |
| 0.0 | 0.799 |
| 0.0 | 0.799 |
| 0.0 | 0.799 |
| 0.0 | 0.8 |
| 0.0 | 0.8 |
| 0.0 | 0.8 |
| 0.0 | 0.8 |
| 0.0 | 0.8 |
| 0.0 | 0.8 |
| 0.0 | 0.8 |
| 0.0 | 0.8 |
| 0.0 | 0.8 |
| 0.0 | 0.8 |
| 0.0 | 0.801 |
| 0.0 | 0.801 |
| 0.0 | 0.801 |
| 0.0 | 0.801 |
| 0.0 | 0.801 |
| 0.0 | 0.801 |
| 0.0 | 0.801 |
| 0.0 | 0.801 |
| 0.0 | 0.801 |
| 0.0 | 0.801 |
| 0.0 | 0.802 |
| 0.0 | 0.802 |
| 0.0 | 0.802 |
| 0.0 | 0.802 |
| 0.0 | 0.802 |
| 0.0 | 0.802 |
| 0.0 | 0.802 |
| 0.0 | 0.802 |
| 0.0 | 0.802 |
| 0.0 | 0.802 |
| 0.0 | 0.803 |
| 0.0 | 0.803 |
| 0.0 | 0.803 |
| 0.0 | 0.803 |
| 0.0 | 0.803 |
| 0.0 | 0.803 |
| 0.0 | 0.803 |
| 0.0 | 0.803 |
| 0.0 | 0.803 |
| 0.0 | 0.803 |
| 0.0 | 0.804 |
| 0.0 | 0.804 |
| 0.0 | 0.804 |
| 0.0 | 0.804 |
| 0.0 | 0.804 |
| 0.0 | 0.804 |
| 0.0 | 0.804 |
| 0.0 | 0.804 |
| 0.0 | 0.804 |
| 0.0 | 0.804 |
| 0.0 | 0.805 |
| 0.0 | 0.805 |
| 0.0 | 0.805 |
| 0.0 | 0.805 |
| 0.0 | 0.805 |
| 0.0 | 0.805 |
| 0.0 | 0.805 |
| 0.0 | 0.805 |
| 0.0 | 0.805 |
| 0.0 | 0.805 |
| 0.0 | 0.806 |
| 0.0 | 0.806 |
| 0.0 | 0.806 |
| 0.0 | 0.806 |
| 0.0 | 0.806 |
| 0.0 | 0.806 |
| 0.0 | 0.806 |
| 0.0 | 0.806 |
| 0.0 | 0.806 |
| 0.0 | 0.806 |
| 0.0 | 0.807 |
| 0.0 | 0.807 |
| 0.0 | 0.807 |
| 0.0 | 0.807 |
| 0.0 | 0.807 |
| 0.0 | 0.807 |
| 0.0 | 0.807 |
| 0.0 | 0.807 |
| 0.0 | 0.807 |
| 0.0 | 0.807 |
| 0.0 | 0.808 |
| 0.0 | 0.808 |
| 0.0 | 0.808 |
| 0.0 | 0.808 |
| 0.0 | 0.808 |
| 0.0 | 0.808 |
| 0.0 | 0.808 |
| 0.0 | 0.808 |
| 0.0 | 0.808 |
| 0.0 | 0.808 |
| 0.0 | 0.809 |
| 0.0 | 0.809 |
| 0.0 | 0.809 |
| 0.0 | 0.809 |
| 0.0 | 0.809 |
| 0.0 | 0.809 |
| 0.0 | 0.809 |
| 0.0 | 0.809 |
| 0.0 | 0.809 |
| 0.0 | 0.809 |
| 0.0 | 0.81 |
| 0.0 | 0.81 |
| 0.0 | 0.81 |
| 0.0 | 0.81 |
| 0.0 | 0.81 |
| 0.0 | 0.81 |
| 0.0 | 0.81 |
| 0.0 | 0.81 |
| 0.0 | 0.81 |
| 0.0 | 0.81 |
| 0.0 | 0.811 |
| 0.0 | 0.811 |
| 0.0 | 0.811 |
| 0.0 | 0.811 |
| 0.0 | 0.811 |
| 0.0 | 0.811 |
| 0.0 | 0.811 |
| 0.0 | 0.811 |
| 0.0 | 0.811 |
| 0.0 | 0.811 |
| 0.0 | 0.812 |
| 0.0 | 0.812 |
| 0.0 | 0.812 |
| 0.0 | 0.812 |
| 0.0 | 0.812 |
| 0.0 | 0.812 |
| 0.0 | 0.812 |
| 0.0 | 0.812 |
| 0.0 | 0.812 |
| 0.0 | 0.812 |
| 0.0 | 0.813 |
| 0.0 | 0.813 |
| 0.0 | 0.813 |
| 0.0 | 0.813 |
| 0.0 | 0.813 |
| 0.0 | 0.813 |
| 0.0 | 0.813 |
| 0.0 | 0.813 |
| 0.0 | 0.813 |
| 0.0 | 0.813 |
| 0.0 | 0.814 |
| 0.0 | 0.814 |
| 0.0 | 0.814 |
| 0.0 | 0.814 |
| 0.0 | 0.814 |
| 0.0 | 0.814 |
| 0.0 | 0.814 |
| 0.0 | 0.814 |
| 0.0 | 0.814 |
| 0.0 | 0.814 |
| 0.0 | 0.815 |
| 0.0 | 0.815 |
| 0.0 | 0.815 |
| 0.0 | 0.815 |
| 0.0 | 0.815 |
| 0.0 | 0.815 |
| 0.0 | 0.815 |
| 0.0 | 0.815 |
| 0.0 | 0.815 |
| 0.0 | 0.815 |
| 0.0 | 0.816 |
| 0.0 | 0.816 |
| 0.0 | 0.816 |
| 0.0 | 0.816 |
| 0.0 | 0.816 |
| 0.0 | 0.816 |
| 0.0 | 0.816 |
| 0.0 | 0.816 |
| 0.0 | 0.816 |
| 0.0 | 0.816 |
| 0.0 | 0.817 |
| 0.0 | 0.817 |
| 0.0 | 0.817 |
| 0.0 | 0.817 |
| 0.0 | 0.817 |
| 0.0 | 0.817 |
| 0.0 | 0.817 |
| 0.0 | 0.817 |
| 0.0 | 0.817 |
| 0.0 | 0.817 |
| 0.0 | 0.818 |
| 0.0 | 0.818 |
| 0.0 | 0.818 |
| 0.0 | 0.818 |
| 0.0 | 0.818 |
| 0.0 | 0.818 |
| 0.0 | 0.818 |
| 0.0 | 0.818 |
| 0.0 | 0.818 |
| 0.0 | 0.818 |
| 0.0 | 0.819 |
| 0.0 | 0.819 |
| 0.0 | 0.819 |
| 0.0 | 0.819 |
| 0.0 | 0.819 |
| 0.0 | 0.819 |
| 0.0 | 0.819 |
| 0.0 | 0.819 |
| 0.0 | 0.819 |
| 0.0 | 0.819 |
| 0.0 | 0.82 |
| 0.0 | 0.82 |
| 0.0 | 0.82 |
| 0.0 | 0.82 |
| 0.0 | 0.82 |
| 0.0 | 0.82 |
| 0.0 | 0.82 |
| 0.0 | 0.82 |
| 0.0 | 0.82 |
| 0.0 | 0.82 |
| 0.0 | 0.821 |
| 0.0 | 0.821 |
| 0.0 | 0.821 |
| 0.0 | 0.821 |
| 0.0 | 0.821 |
| 0.0 | 0.821 |
| 0.0 | 0.821 |
| 0.0 | 0.821 |
| 0.0 | 0.821 |
| 0.0 | 0.821 |
| 0.0 | 0.822 |
| 0.0 | 0.822 |
| 0.0 | 0.822 |
| 0.0 | 0.822 |
| 0.0 | 0.822 |
| 0.0 | 0.822 |
| 0.0 | 0.822 |
| 0.0 | 0.822 |
| 0.0 | 0.822 |
| 0.0 | 0.822 |
| 0.0 | 0.823 |
| 0.0 | 0.823 |
| 0.0 | 0.823 |
| 0.0 | 0.823 |
| 0.0 | 0.823 |
| 0.0 | 0.823 |
| 0.0 | 0.823 |
| 0.0 | 0.823 |
| 0.0 | 0.823 |
| 0.0 | 0.823 |
| 0.0 | 0.824 |
| 0.0 | 0.824 |
| 0.0 | 0.824 |
| 0.0 | 0.824 |
| 0.0 | 0.824 |
| 0.0 | 0.824 |
| 0.0 | 0.824 |
| 0.0 | 0.824 |
| 0.0 | 0.824 |
| 0.0 | 0.824 |
| 0.0 | 0.825 |
| 0.0 | 0.825 |
| 0.0 | 0.825 |
| 0.0 | 0.825 |
| 0.0 | 0.825 |
| 0.0 | 0.825 |
| 0.0 | 0.825 |
| 0.0 | 0.825 |
| 0.0 | 0.825 |
| 0.0 | 0.825 |
| 0.0 | 0.826 |
| 0.0 | 0.826 |
| 0.0 | 0.826 |
| 0.0 | 0.826 |
| 0.0 | 0.826 |
| 0.0 | 0.826 |
| 0.0 | 0.826 |
| 0.0 | 0.826 |
| 0.0 | 0.826 |
| 0.0 | 0.826 |
| 0.0 | 0.827 |
| 0.0 | 0.827 |
| 0.0 | 0.827 |
| 0.0 | 0.827 |
| 0.0 | 0.827 |
| 0.0 | 0.827 |
| 0.0 | 0.827 |
| 0.0 | 0.827 |
| 0.0 | 0.827 |
| 0.0 | 0.827 |
| 0.0 | 0.828 |
| 0.0 | 0.828 |
| 0.0 | 0.828 |
| 0.0 | 0.828 |
| 0.0 | 0.828 |
| 0.0 | 0.828 |
| 0.0 | 0.828 |
| 0.0 | 0.828 |
| 0.0 | 0.828 |
| 0.0 | 0.828 |
| 0.0 | 0.829 |
| 0.0 | 0.829 |
| 0.0 | 0.829 |
| 0.0 | 0.829 |
| 0.0 | 0.829 |
| 0.0 | 0.829 |
| 0.0 | 0.829 |
| 0.0 | 0.829 |
| 0.0 | 0.829 |
| 0.0 | 0.829 |
| 0.0 | 0.83 |
| 0.0 | 0.83 |
| 0.0 | 0.83 |
| 0.0 | 0.83 |
| 0.0 | 0.83 |
| 0.0 | 0.83 |
| 0.0 | 0.83 |
| 0.0 | 0.83 |
| 0.0 | 0.83 |
| 0.0 | 0.83 |
| 0.0 | 0.831 |
| 0.0 | 0.831 |
| 0.0 | 0.831 |
| 0.0 | 0.831 |
| 0.0 | 0.831 |
| 0.0 | 0.831 |
| 0.0 | 0.831 |
| 0.0 | 0.831 |
| 0.0 | 0.831 |
| 0.0 | 0.831 |
| 0.0 | 0.832 |
| 0.0 | 0.832 |
| 0.0 | 0.832 |
| 0.0 | 0.832 |
| 0.0 | 0.832 |
| 0.0 | 0.832 |
| 0.0 | 0.832 |
| 0.0 | 0.832 |
| 0.0 | 0.832 |
| 0.0 | 0.832 |
| 0.0 | 0.833 |
| 0.0 | 0.833 |
| 0.0 | 0.833 |
| 0.0 | 0.833 |
| 0.0 | 0.833 |
| 0.0 | 0.833 |
| 0.0 | 0.833 |
| 0.0 | 0.833 |
| 0.0 | 0.833 |
| 0.0 | 0.833 |
| 0.0 | 0.834 |
| 0.0 | 0.834 |
| 0.0 | 0.834 |
| 0.0 | 0.834 |
| 0.0 | 0.834 |
| 0.0 | 0.834 |
| 0.0 | 0.834 |
| 0.0 | 0.834 |
| 0.0 | 0.834 |
| 0.0 | 0.834 |
| 0.0 | 0.835 |
| 0.0 | 0.835 |
| 0.0 | 0.835 |
| 0.0 | 0.835 |
| 0.0 | 0.835 |
| 0.0 | 0.835 |
| 0.0 | 0.835 |
| 0.0 | 0.835 |
| 0.0 | 0.835 |
| 0.0 | 0.835 |
| 0.0 | 0.836 |
| 0.0 | 0.836 |
| 0.0 | 0.836 |
| 0.0 | 0.836 |
| 0.0 | 0.836 |
| 0.0 | 0.836 |
| 0.0 | 0.836 |
| 0.0 | 0.836 |
| 0.0 | 0.836 |
| 0.0 | 0.836 |
| 0.0 | 0.837 |
| 0.0 | 0.837 |
| 0.0 | 0.837 |
| 0.0 | 0.837 |
| 0.0 | 0.837 |
| 0.0 | 0.837 |
| 0.0 | 0.837 |
| 0.0 | 0.837 |
| 0.0 | 0.837 |
| 0.0 | 0.837 |
| 0.0 | 0.838 |
| 0.0 | 0.838 |
| 0.0 | 0.838 |
| 0.0 | 0.838 |
| 0.0 | 0.838 |
| 0.0 | 0.838 |
| 0.0 | 0.838 |
| 0.0 | 0.838 |
| 0.0 | 0.838 |
| 0.0 | 0.838 |
| 0.0 | 0.839 |
| 0.0 | 0.839 |
| 0.0 | 0.839 |
| 0.0 | 0.839 |
| 0.0 | 0.839 |
| 0.0 | 0.839 |
| 0.0 | 0.839 |
| 0.0 | 0.839 |
| 0.0 | 0.839 |
| 0.0 | 0.839 |
| 0.0 | 0.84 |
| 0.0 | 0.84 |
| 0.0 | 0.84 |
| 0.0 | 0.84 |
| 0.0 | 0.84 |
| 0.0 | 0.84 |
| 0.0 | 0.84 |
| 0.0 | 0.84 |
| 0.0 | 0.84 |
| 0.0 | 0.84 |
| 0.0 | 0.841 |
| 0.0 | 0.841 |
| 0.0 | 0.841 |
| 0.0 | 0.841 |
| 0.0 | 0.841 |
| 0.0 | 0.841 |
| 0.0 | 0.841 |
| 0.0 | 0.841 |
| 0.0 | 0.841 |
| 0.0 | 0.841 |
| 0.0 | 0.842 |
| 0.0 | 0.842 |
| 0.0 | 0.842 |
| 0.0 | 0.842 |
| 0.0 | 0.842 |
| 0.0 | 0.842 |
| 0.0 | 0.842 |
| 0.0 | 0.842 |
| 0.0 | 0.842 |
| 0.0 | 0.842 |
| 0.0 | 0.843 |
| 0.0 | 0.843 |
| 0.0 | 0.843 |
| 0.0 | 0.843 |
| 0.0 | 0.843 |
| 0.0 | 0.843 |
| 0.0 | 0.843 |
| 0.0 | 0.843 |
| 0.0 | 0.843 |
| 0.0 | 0.843 |
| 0.0 | 0.844 |
| 0.0 | 0.844 |
| 0.0 | 0.844 |
| 0.0 | 0.844 |
| 0.0 | 0.844 |
| 0.0 | 0.844 |
| 0.0 | 0.844 |
| 0.0 | 0.844 |
| 0.0 | 0.844 |
| 0.0 | 0.844 |
| 0.0 | 0.845 |
| 0.0 | 0.845 |
| 0.0 | 0.845 |
| 0.0 | 0.845 |
| 0.0 | 0.845 |
| 0.0 | 0.845 |
| 0.0 | 0.845 |
| 0.0 | 0.845 |
| 0.0 | 0.845 |
| 0.0 | 0.845 |
| 0.0 | 0.846 |
| 0.0 | 0.846 |
| 0.0 | 0.846 |
| 0.0 | 0.846 |
| 0.0 | 0.846 |
| 0.0 | 0.846 |
| 0.0 | 0.846 |
| 0.0 | 0.846 |
| 0.0 | 0.846 |
| 0.0 | 0.846 |
| 0.0 | 0.847 |
| 0.0 | 0.847 |
| 0.0 | 0.847 |
| 0.0 | 0.847 |
| 0.0 | 0.847 |
| 0.0 | 0.847 |
| 0.0 | 0.847 |
| 0.0 | 0.847 |
| 0.0 | 0.847 |
| 0.0 | 0.847 |
| 0.0 | 0.848 |
| 0.0 | 0.848 |
| 0.0 | 0.848 |
| 0.0 | 0.848 |
| 0.0 | 0.848 |
| 0.0 | 0.848 |
| 0.0 | 0.848 |
| 0.0 | 0.848 |
| 0.0 | 0.848 |
| 0.0 | 0.848 |
| 0.0 | 0.849 |
| 0.0 | 0.849 |
| 0.0 | 0.849 |
| 0.0 | 0.849 |
| 0.0 | 0.849 |
| 0.0 | 0.849 |
| 0.0 | 0.849 |
| 0.0 | 0.849 |
| 0.0 | 0.849 |
| 0.0 | 0.849 |
| 0.0 | 0.85 |
| 0.0 | 0.85 |
| 0.0 | 0.85 |
| 0.0 | 0.85 |
| 0.0 | 0.85 |
| 0.0 | 0.85 |
| 0.0 | 0.85 |
| 0.0 | 0.85 |
| 0.0 | 0.85 |
| 0.0 | 0.85 |
| 0.0 | 0.851 |
| 0.0 | 0.851 |
| 0.0 | 0.851 |
| 0.0 | 0.851 |
| 0.0 | 0.851 |
| 0.0 | 0.851 |
| 0.0 | 0.851 |
| 0.0 | 0.851 |
| 0.0 | 0.851 |
| 0.0 | 0.851 |
| 0.0 | 0.852 |
| 0.0 | 0.852 |
| 0.0 | 0.852 |
| 0.0 | 0.852 |
| 0.0 | 0.852 |
| 0.0 | 0.852 |
| 0.0 | 0.852 |
| 0.0 | 0.852 |
| 0.0 | 0.852 |
| 0.0 | 0.852 |
| 0.0 | 0.853 |
| 0.0 | 0.853 |
| 0.0 | 0.853 |
| 0.0 | 0.853 |
| 0.0 | 0.853 |
| 0.0 | 0.853 |
| 0.0 | 0.853 |
| 0.0 | 0.853 |
| 0.0 | 0.853 |
| 0.0 | 0.853 |
| 0.0 | 0.854 |
| 0.0 | 0.854 |
| 0.0 | 0.854 |
| 0.0 | 0.854 |
| 0.0 | 0.854 |
| 0.0 | 0.854 |
| 0.0 | 0.854 |
| 0.0 | 0.854 |
| 0.0 | 0.854 |
| 0.0 | 0.854 |
| 0.0 | 0.855 |
| 0.0 | 0.855 |
| 0.0 | 0.855 |
| 0.0 | 0.855 |
| 0.0 | 0.855 |
| 0.0 | 0.855 |
| 0.0 | 0.855 |
| 0.0 | 0.855 |
| 0.0 | 0.855 |
| 0.0 | 0.855 |
| 0.0 | 0.856 |
| 0.0 | 0.856 |
| 0.0 | 0.856 |
| 0.0 | 0.856 |
| 0.0 | 0.856 |
| 0.0 | 0.856 |
| 0.0 | 0.856 |
| 0.0 | 0.856 |
| 0.0 | 0.856 |
| 0.0 | 0.856 |
| 0.0 | 0.857 |
| 0.0 | 0.857 |
| 0.0 | 0.857 |
| 0.0 | 0.857 |
| 0.0 | 0.857 |
| 0.0 | 0.857 |
| 0.0 | 0.857 |
| 0.0 | 0.857 |
| 0.0 | 0.857 |
| 0.0 | 0.857 |
| 0.0 | 0.858 |
| 0.0 | 0.858 |
| 0.0 | 0.858 |
| 0.0 | 0.858 |
| 0.0 | 0.858 |
| 0.0 | 0.858 |
| 0.0 | 0.858 |
| 0.0 | 0.858 |
| 0.0 | 0.858 |
| 0.0 | 0.858 |
| 0.0 | 0.859 |
| 0.0 | 0.859 |
| 0.0 | 0.859 |
| 0.0 | 0.859 |
| 0.0 | 0.859 |
| 0.0 | 0.859 |
| 0.0 | 0.859 |
| 0.0 | 0.859 |
| 0.0 | 0.859 |
| 0.0 | 0.859 |
| 0.0 | 0.86 |
| 0.0 | 0.86 |
| 0.0 | 0.86 |
| 0.0 | 0.86 |
| 0.0 | 0.86 |
| 0.0 | 0.86 |
| 0.0 | 0.86 |
| 0.0 | 0.86 |
| 0.0 | 0.86 |
| 0.0 | 0.86 |
| 0.0 | 0.861 |
| 0.0 | 0.861 |
| 0.0 | 0.861 |
| 0.0 | 0.861 |
| 0.0 | 0.861 |
| 0.0 | 0.861 |
| 0.0 | 0.861 |
| 0.0 | 0.861 |
| 0.0 | 0.861 |
| 0.0 | 0.861 |
| 0.0 | 0.862 |
| 0.0 | 0.862 |
| 0.0 | 0.862 |
| 0.0 | 0.862 |
| 0.0 | 0.862 |
| 0.0 | 0.862 |
| 0.0 | 0.862 |
| 0.0 | 0.862 |
| 0.0 | 0.862 |
| 0.0 | 0.862 |
| 0.0 | 0.863 |
| 0.0 | 0.863 |
| 0.0 | 0.863 |
| 0.0 | 0.863 |
| 0.0 | 0.863 |
| 0.0 | 0.863 |
| 0.0 | 0.863 |
| 0.0 | 0.863 |
| 0.0 | 0.863 |
| 0.0 | 0.863 |
| 0.0 | 0.864 |
| 0.0 | 0.864 |
| 0.0 | 0.864 |
| 0.0 | 0.864 |
| 0.0 | 0.864 |
| 0.0 | 0.864 |
| 0.0 | 0.864 |
| 0.0 | 0.864 |
| 0.0 | 0.864 |
| 0.0 | 0.864 |
| 0.0 | 0.865 |
| 0.0 | 0.865 |
| 0.0 | 0.865 |
| 0.0 | 0.865 |
| 0.0 | 0.865 |
| 0.0 | 0.865 |
| 0.0 | 0.865 |
| 0.0 | 0.865 |
| 0.0 | 0.865 |
| 0.0 | 0.865 |
| 0.0 | 0.866 |
| 0.0 | 0.866 |
| 0.0 | 0.866 |
| 0.0 | 0.866 |
| 0.0 | 0.866 |
| 0.0 | 0.866 |
| 0.0 | 0.866 |
| 0.0 | 0.866 |
| 0.0 | 0.866 |
| 0.0 | 0.866 |
| 0.0 | 0.867 |
| 0.0 | 0.867 |
| 0.0 | 0.867 |
| 0.0 | 0.867 |
| 0.0 | 0.867 |
| 0.0 | 0.867 |
| 0.0 | 0.867 |
| 0.0 | 0.867 |
| 0.0 | 0.867 |
| 0.0 | 0.867 |
| 0.0 | 0.868 |
| 0.0 | 0.868 |
| 0.0 | 0.868 |
| 0.0 | 0.868 |
| 0.0 | 0.868 |
| 0.0 | 0.868 |
| 0.0 | 0.868 |
| 0.0 | 0.868 |
| 0.0 | 0.868 |
| 0.0 | 0.868 |
| 0.0 | 0.869 |
| 0.0 | 0.869 |
| 0.0 | 0.869 |
| 0.0 | 0.869 |
| 0.0 | 0.869 |
| 0.0 | 0.869 |
| 0.0 | 0.869 |
| 0.0 | 0.869 |
| 0.0 | 0.869 |
| 0.0 | 0.869 |
| 0.0 | 0.87 |
| 0.0 | 0.87 |
| 0.0 | 0.87 |
| 0.0 | 0.87 |
| 0.0 | 0.87 |
| 0.0 | 0.87 |
| 0.0 | 0.87 |
| 0.0 | 0.87 |
| 0.0 | 0.87 |
| 0.0 | 0.87 |
| 0.0 | 0.871 |
| 0.0 | 0.871 |
| 0.0 | 0.871 |
| 0.0 | 0.871 |
| 0.0 | 0.871 |
| 0.0 | 0.871 |
| 0.0 | 0.871 |
| 0.0 | 0.871 |
| 0.0 | 0.871 |
| 0.0 | 0.871 |
| 0.0 | 0.872 |
| 0.0 | 0.872 |
| 0.0 | 0.872 |
| 0.0 | 0.872 |
| 0.0 | 0.872 |
| 0.0 | 0.872 |
| 0.0 | 0.872 |
| 0.0 | 0.872 |
| 0.0 | 0.872 |
| 0.0 | 0.872 |
| 0.0 | 0.873 |
| 0.0 | 0.873 |
| 0.0 | 0.873 |
| 0.0 | 0.873 |
| 0.0 | 0.873 |
| 0.0 | 0.873 |
| 0.0 | 0.873 |
| 0.0 | 0.873 |
| 0.0 | 0.873 |
| 0.0 | 0.873 |
| 0.0 | 0.874 |
| 0.0 | 0.874 |
| 0.0 | 0.874 |
| 0.0 | 0.874 |
| 0.0 | 0.874 |
| 0.0 | 0.874 |
| 0.0 | 0.874 |
| 0.0 | 0.874 |
| 0.0 | 0.874 |
| 0.0 | 0.874 |
| 0.0 | 0.875 |
| 0.0 | 0.875 |
| 0.0 | 0.875 |
| 0.0 | 0.875 |
| 0.0 | 0.875 |
| 0.0 | 0.875 |
| 0.0 | 0.875 |
| 0.0 | 0.875 |
| 0.0 | 0.875 |
| 0.0 | 0.875 |
| 0.0 | 0.876 |
| 0.0 | 0.876 |
| 0.0 | 0.876 |
| 0.0 | 0.876 |
| 0.0 | 0.876 |
| 0.0 | 0.876 |
| 0.0 | 0.876 |
| 0.0 | 0.876 |
| 0.0 | 0.876 |
| 0.0 | 0.876 |
| 0.0 | 0.877 |
| 0.0 | 0.877 |
| 0.0 | 0.877 |
| 0.0 | 0.877 |
| 0.0 | 0.877 |
| 0.0 | 0.877 |
| 0.0 | 0.877 |
| 0.0 | 0.877 |
| 0.0 | 0.877 |
| 0.0 | 0.877 |
| 0.0 | 0.878 |
| 0.0 | 0.878 |
| 0.0 | 0.878 |
| 0.0 | 0.878 |
| 0.0 | 0.878 |
| 0.0 | 0.878 |
| 0.0 | 0.878 |
| 0.0 | 0.878 |
| 0.0 | 0.878 |
| 0.0 | 0.878 |
| 0.0 | 0.879 |
| 0.0 | 0.879 |
| 0.0 | 0.879 |
| 0.0 | 0.879 |
| 0.0 | 0.879 |
| 0.0 | 0.879 |
| 0.0 | 0.879 |
| 0.0 | 0.879 |
| 0.0 | 0.879 |
| 0.0 | 0.879 |
| 0.0 | 0.88 |
| 0.0 | 0.88 |
| 0.0 | 0.88 |
| 0.0 | 0.88 |
| 0.0 | 0.88 |
| 0.0 | 0.88 |
| 0.0 | 0.88 |
| 0.0 | 0.88 |
| 0.0 | 0.88 |
| 0.0 | 0.88 |
| 0.0 | 0.881 |
| 0.0 | 0.881 |
| 0.0 | 0.881 |
| 0.0 | 0.881 |
| 0.0 | 0.881 |
| 0.0 | 0.881 |
| 0.0 | 0.881 |
| 0.0 | 0.881 |
| 0.0 | 0.881 |
| 0.0 | 0.881 |
| 0.0 | 0.882 |
| 0.0 | 0.882 |
| 0.0 | 0.882 |
| 0.0 | 0.882 |
| 0.0 | 0.882 |
| 0.0 | 0.882 |
| 0.0 | 0.882 |
| 1.0 | 0.882 |
| 1.0 | 0.882 |
| 1.0 | 0.882 |
| 1.0 | 0.883 |
| 1.0 | 0.883 |
| 1.0 | 0.883 |
| 1.0 | 0.883 |
| 1.0 | 0.883 |
| 1.0 | 0.883 |
| 1.0 | 0.883 |
| 1.0 | 0.883 |
| 1.0 | 0.883 |
| 1.0 | 0.883 |
| 1.0 | 0.884 |
| 1.0 | 0.884 |
| 1.0 | 0.884 |
| 1.0 | 0.884 |
| 1.0 | 0.884 |
| 1.0 | 0.884 |
| 1.0 | 0.884 |
| 1.0 | 0.884 |
| 1.0 | 0.884 |
| 1.0 | 0.884 |
| 1.0 | 0.885 |
| 1.0 | 0.885 |
| 1.0 | 0.885 |
| 1.0 | 0.885 |
| 1.0 | 0.885 |
| 1.0 | 0.885 |
| 1.0 | 0.885 |
| 1.0 | 0.885 |
| 1.0 | 0.885 |
| 1.0 | 0.885 |
| 1.0 | 0.886 |
| 1.0 | 0.886 |
| 1.0 | 0.886 |
| 1.0 | 0.886 |
| 1.0 | 0.886 |
| 1.0 | 0.886 |
| 1.0 | 0.886 |
| 1.0 | 0.886 |
| 1.0 | 0.886 |
| 1.0 | 0.886 |
| 1.0 | 0.887 |
| 1.0 | 0.887 |
| 1.0 | 0.887 |
| 1.0 | 0.887 |
| 1.0 | 0.887 |
| 1.0 | 0.887 |
| 1.0 | 0.887 |
| 1.0 | 0.887 |
| 1.0 | 0.887 |
| 1.0 | 0.887 |
| 1.0 | 0.888 |
| 1.0 | 0.888 |
| 1.0 | 0.888 |
| 1.0 | 0.888 |
| 1.0 | 0.888 |
| 1.0 | 0.888 |
| 1.0 | 0.888 |
| 1.0 | 0.888 |
| 1.0 | 0.888 |
| 1.0 | 0.888 |
| 1.0 | 0.889 |
| 1.0 | 0.889 |
| 1.0 | 0.889 |
| 1.0 | 0.889 |
| 1.0 | 0.889 |
| 1.0 | 0.889 |
| 1.0 | 0.889 |
| 1.0 | 0.889 |
| 1.0 | 0.889 |
| 1.0 | 0.889 |
| 1.0 | 0.89 |
| 1.0 | 0.89 |
| 1.0 | 0.89 |
| 1.0 | 0.89 |
| 1.0 | 0.89 |
| 1.0 | 0.89 |
| 1.0 | 0.89 |
| 1.0 | 0.89 |
| 1.0 | 0.89 |
| 1.0 | 0.89 |
| 1.0 | 0.891 |
| 1.0 | 0.891 |
| 1.0 | 0.891 |
| 1.0 | 0.891 |
| 1.0 | 0.891 |
| 1.0 | 0.891 |
| 1.0 | 0.891 |
| 1.0 | 0.891 |
| 1.0 | 0.891 |
| 1.0 | 0.891 |
| 1.0 | 0.892 |
| 1.0 | 0.892 |
| 1.0 | 0.892 |
| 1.0 | 0.892 |
| 1.0 | 0.892 |
| 1.0 | 0.892 |
| 1.0 | 0.892 |
| 1.0 | 0.892 |
| 1.0 | 0.892 |
| 1.0 | 0.892 |
| 1.0 | 0.893 |
| 1.0 | 0.893 |
| 1.0 | 0.893 |
| 1.0 | 0.893 |
| 1.0 | 0.893 |
| 1.0 | 0.893 |
| 1.0 | 0.893 |
| 1.0 | 0.893 |
| 1.0 | 0.893 |
| 1.0 | 0.893 |
| 1.0 | 0.894 |
| 1.0 | 0.894 |
| 1.0 | 0.894 |
| 1.0 | 0.894 |
| 1.0 | 0.894 |
| 1.0 | 0.894 |
| 1.0 | 0.894 |
| 1.0 | 0.894 |
| 1.0 | 0.894 |
| 1.0 | 0.894 |
| 1.0 | 0.895 |
| 1.0 | 0.895 |
| 1.0 | 0.895 |
| 1.0 | 0.895 |
| 1.0 | 0.895 |
| 1.0 | 0.895 |
| 1.0 | 0.895 |
| 1.0 | 0.895 |
| 1.0 | 0.895 |
| 1.0 | 0.895 |
| 1.0 | 0.896 |
| 1.0 | 0.896 |
| 1.0 | 0.896 |
| 1.0 | 0.896 |
| 1.0 | 0.896 |
| 1.0 | 0.896 |
| 1.0 | 0.896 |
| 1.0 | 0.896 |
| 1.0 | 0.896 |
| 1.0 | 0.896 |
| 1.0 | 0.897 |
| 1.0 | 0.897 |
| 1.0 | 0.897 |
| 1.0 | 0.897 |
| 1.0 | 0.897 |
| 1.0 | 0.897 |
| 1.0 | 0.897 |
| 1.0 | 0.897 |
| 1.0 | 0.897 |
| 1.0 | 0.897 |
| 1.0 | 0.898 |
| 1.0 | 0.898 |
| 1.0 | 0.898 |
| 1.0 | 0.898 |
| 1.0 | 0.898 |
| 1.0 | 0.898 |
| 1.0 | 0.898 |
| 1.0 | 0.898 |
| 1.0 | 0.898 |
| 1.0 | 0.898 |
| 1.0 | 0.899 |
| 1.0 | 0.899 |
| 1.0 | 0.899 |
| 1.0 | 0.899 |
| 1.0 | 0.899 |
| 1.0 | 0.899 |
| 1.0 | 0.899 |
| 1.0 | 0.899 |
| 1.0 | 0.899 |
| 1.0 | 0.899 |
| 1.0 | 0.9 |
| 1.0 | 0.9 |
| 1.0 | 0.9 |
| 1.0 | 0.9 |
| 1.0 | 0.9 |
| 1.0 | 0.9 |
| 1.0 | 0.9 |
| 1.0 | 0.9 |
| 1.0 | 0.9 |
| 1.0 | 0.9 |
| 1.0 | 0.901 |
| 1.0 | 0.901 |
| 1.0 | 0.901 |
| 1.0 | 0.901 |
| 1.0 | 0.901 |
| 1.0 | 0.901 |
| 1.0 | 0.901 |
| 1.0 | 0.901 |
| 1.0 | 0.901 |
| 1.0 | 0.901 |
| 1.0 | 0.902 |
| 1.0 | 0.902 |
| 1.0 | 0.902 |
| 1.0 | 0.902 |
| 1.0 | 0.902 |
| 1.0 | 0.902 |
| 1.0 | 0.902 |
| 1.0 | 0.902 |
| 1.0 | 0.902 |
| 1.0 | 0.902 |
| 1.0 | 0.903 |
| 1.0 | 0.903 |
| 1.0 | 0.903 |
| 1.0 | 0.903 |
| 1.0 | 0.903 |
| 1.0 | 0.903 |
| 1.0 | 0.903 |
| 1.0 | 0.903 |
| 1.0 | 0.903 |
| 1.0 | 0.903 |
| 1.0 | 0.904 |
| 1.0 | 0.904 |
| 1.0 | 0.904 |
| 1.0 | 0.904 |
| 1.0 | 0.904 |
| 1.0 | 0.904 |
| 1.0 | 0.904 |
| 1.0 | 0.904 |
| 1.0 | 0.904 |
| 1.0 | 0.904 |
| 1.0 | 0.905 |
| 1.0 | 0.905 |
| 1.0 | 0.905 |
| 1.0 | 0.905 |
| 1.0 | 0.905 |
| 1.0 | 0.905 |
| 1.0 | 0.905 |
| 1.0 | 0.905 |
| 1.0 | 0.905 |
| 1.0 | 0.905 |
| 1.0 | 0.906 |
| 1.0 | 0.906 |
| 1.0 | 0.906 |
| 1.0 | 0.906 |
| 1.0 | 0.906 |
| 1.0 | 0.906 |
| 1.0 | 0.906 |
| 1.0 | 0.906 |
| 1.0 | 0.906 |
| 1.0 | 0.906 |
| 1.0 | 0.907 |
| 1.0 | 0.907 |
| 1.0 | 0.907 |
| 1.0 | 0.907 |
| 1.0 | 0.907 |
| 1.0 | 0.907 |
| 1.0 | 0.907 |
| 1.0 | 0.907 |
| 1.0 | 0.907 |
| 1.0 | 0.907 |
| 1.0 | 0.908 |
| 1.0 | 0.908 |
| 1.0 | 0.908 |
| 1.0 | 0.908 |
| 1.0 | 0.908 |
| 1.0 | 0.908 |
| 1.0 | 0.908 |
| 1.0 | 0.908 |
| 1.0 | 0.908 |
| 1.0 | 0.908 |
| 1.0 | 0.909 |
| 1.0 | 0.909 |
| 1.0 | 0.909 |
| 1.0 | 0.909 |
| 1.0 | 0.909 |
| 1.0 | 0.909 |
| 1.0 | 0.909 |
| 1.0 | 0.909 |
| 1.0 | 0.909 |
| 1.0 | 0.909 |
| 1.0 | 0.91 |
| 1.0 | 0.91 |
| 1.0 | 0.91 |
| 1.0 | 0.91 |
| 1.0 | 0.91 |
| 1.0 | 0.91 |
| 1.0 | 0.91 |
| 1.0 | 0.91 |
| 1.0 | 0.91 |
| 1.0 | 0.91 |
| 1.0 | 0.911 |
| 1.0 | 0.911 |
| 1.0 | 0.911 |
| 1.0 | 0.911 |
| 1.0 | 0.911 |
| 1.0 | 0.911 |
| 1.0 | 0.911 |
| 1.0 | 0.911 |
| 1.0 | 0.911 |
| 1.0 | 0.911 |
| 1.0 | 0.912 |
| 1.0 | 0.912 |
| 1.0 | 0.912 |
| 1.0 | 0.912 |
| 1.0 | 0.912 |
| 1.0 | 0.912 |
| 1.0 | 0.912 |
| 1.0 | 0.912 |
| 1.0 | 0.912 |
| 1.0 | 0.912 |
| 1.0 | 0.913 |
| 1.0 | 0.913 |
| 1.0 | 0.913 |
| 1.0 | 0.913 |
| 1.0 | 0.913 |
| 1.0 | 0.913 |
| 1.0 | 0.913 |
| 1.0 | 0.913 |
| 1.0 | 0.913 |
| 1.0 | 0.913 |
| 1.0 | 0.914 |
| 1.0 | 0.914 |
| 1.0 | 0.914 |
| 1.0 | 0.914 |
| 1.0 | 0.914 |
| 1.0 | 0.914 |
| 1.0 | 0.914 |
| 1.0 | 0.914 |
| 1.0 | 0.914 |
| 1.0 | 0.914 |
| 1.0 | 0.915 |
| 1.0 | 0.915 |
| 1.0 | 0.915 |
| 1.0 | 0.915 |
| 1.0 | 0.915 |
| 1.0 | 0.915 |
| 1.0 | 0.915 |
| 1.0 | 0.915 |
| 1.0 | 0.915 |
| 1.0 | 0.915 |
| 1.0 | 0.916 |
| 1.0 | 0.916 |
| 1.0 | 0.916 |
| 1.0 | 0.916 |
| 1.0 | 0.916 |
| 1.0 | 0.916 |
| 1.0 | 0.916 |
| 1.0 | 0.916 |
| 1.0 | 0.916 |
| 1.0 | 0.916 |
| 1.0 | 0.917 |
| 1.0 | 0.917 |
| 1.0 | 0.917 |
| 1.0 | 0.917 |
| 1.0 | 0.917 |
| 1.0 | 0.917 |
| 1.0 | 0.917 |
| 1.0 | 0.917 |
| 1.0 | 0.917 |
| 1.0 | 0.917 |
| 1.0 | 0.918 |
| 1.0 | 0.918 |
| 1.0 | 0.918 |
| 1.0 | 0.918 |
| 1.0 | 0.918 |
| 1.0 | 0.918 |
| 1.0 | 0.918 |
| 1.0 | 0.918 |
| 1.0 | 0.918 |
| 1.0 | 0.918 |
| 1.0 | 0.919 |
| 1.0 | 0.919 |
| 1.0 | 0.919 |
| 1.0 | 0.919 |
| 1.0 | 0.919 |
| 1.0 | 0.919 |
| 1.0 | 0.919 |
| 1.0 | 0.919 |
| 1.0 | 0.919 |
| 1.0 | 0.919 |
| 1.0 | 0.92 |
| 1.0 | 0.92 |
| 1.0 | 0.92 |
| 1.0 | 0.92 |
| 1.0 | 0.92 |
| 1.0 | 0.92 |
| 1.0 | 0.92 |
| 1.0 | 0.92 |
| 1.0 | 0.92 |
| 1.0 | 0.92 |
| 1.0 | 0.921 |
| 1.0 | 0.921 |
| 1.0 | 0.921 |
| 1.0 | 0.921 |
| 1.0 | 0.921 |
| 1.0 | 0.921 |
| 1.0 | 0.921 |
| 1.0 | 0.921 |
| 1.0 | 0.921 |
| 1.0 | 0.921 |
| 1.0 | 0.922 |
| 1.0 | 0.922 |
| 1.0 | 0.922 |
| 1.0 | 0.922 |
| 1.0 | 0.922 |
| 1.0 | 0.922 |
| 1.0 | 0.922 |
| 1.0 | 0.922 |
| 1.0 | 0.922 |
| 1.0 | 0.922 |
| 1.0 | 0.923 |
| 1.0 | 0.923 |
| 1.0 | 0.923 |
| 1.0 | 0.923 |
| 1.0 | 0.923 |
| 1.0 | 0.923 |
| 1.0 | 0.923 |
| 1.0 | 0.923 |
| 1.0 | 0.923 |
| 1.0 | 0.923 |
| 1.0 | 0.924 |
| 1.0 | 0.924 |
| 1.0 | 0.924 |
| 1.0 | 0.924 |
| 1.0 | 0.924 |
| 1.0 | 0.924 |
| 1.0 | 0.924 |
| 1.0 | 0.924 |
| 1.0 | 0.924 |
| 1.0 | 0.924 |
| 1.0 | 0.925 |
| 1.0 | 0.925 |
| 1.0 | 0.925 |
| 1.0 | 0.925 |
| 1.0 | 0.925 |
| 1.0 | 0.925 |
| 1.0 | 0.925 |
| 1.0 | 0.925 |
| 1.0 | 0.925 |
| 1.0 | 0.925 |
| 1.0 | 0.926 |
| 1.0 | 0.926 |
| 1.0 | 0.926 |
| 1.0 | 0.926 |
| 1.0 | 0.926 |
| 1.0 | 0.926 |
| 1.0 | 0.926 |
| 1.0 | 0.926 |
| 1.0 | 0.926 |
| 1.0 | 0.926 |
| 1.0 | 0.927 |
| 1.0 | 0.927 |
| 1.0 | 0.927 |
| 1.0 | 0.927 |
| 1.0 | 0.927 |
| 1.0 | 0.927 |
| 1.0 | 0.927 |
| 1.0 | 0.927 |
| 1.0 | 0.927 |
| 1.0 | 0.927 |
| 1.0 | 0.928 |
| 1.0 | 0.928 |
| 1.0 | 0.928 |
| 1.0 | 0.928 |
| 1.0 | 0.928 |
| 1.0 | 0.928 |
| 1.0 | 0.928 |
| 1.0 | 0.928 |
| 1.0 | 0.928 |
| 1.0 | 0.928 |
| 1.0 | 0.929 |
| 1.0 | 0.929 |
| 1.0 | 0.929 |
| 1.0 | 0.929 |
| 1.0 | 0.929 |
| 1.0 | 0.929 |
| 1.0 | 0.929 |
| 1.0 | 0.929 |
| 1.0 | 0.929 |
| 1.0 | 0.929 |
| 1.0 | 0.93 |
| 1.0 | 0.93 |
| 1.0 | 0.93 |
| 1.0 | 0.93 |
| 1.0 | 0.93 |
| 1.0 | 0.93 |
| 1.0 | 0.93 |
| 1.0 | 0.93 |
| 1.0 | 0.93 |
| 1.0 | 0.93 |
| 1.0 | 0.931 |
| 1.0 | 0.931 |
| 1.0 | 0.931 |
| 1.0 | 0.931 |
| 1.0 | 0.931 |
| 1.0 | 0.931 |
| 1.0 | 0.931 |
| 1.0 | 0.931 |
| 1.0 | 0.931 |
| 1.0 | 0.931 |
| 1.0 | 0.932 |
| 1.0 | 0.932 |
| 1.0 | 0.932 |
| 1.0 | 0.932 |
| 1.0 | 0.932 |
| 1.0 | 0.932 |
| 1.0 | 0.932 |
| 1.0 | 0.932 |
| 1.0 | 0.932 |
| 1.0 | 0.932 |
| 1.0 | 0.933 |
| 1.0 | 0.933 |
| 1.0 | 0.933 |
| 1.0 | 0.933 |
| 1.0 | 0.933 |
| 1.0 | 0.933 |
| 1.0 | 0.933 |
| 1.0 | 0.933 |
| 1.0 | 0.933 |
| 1.0 | 0.933 |
| 1.0 | 0.934 |
| 1.0 | 0.934 |
| 1.0 | 0.934 |
| 1.0 | 0.934 |
| 1.0 | 0.934 |
| 1.0 | 0.934 |
| 1.0 | 0.934 |
| 1.0 | 0.934 |
| 1.0 | 0.934 |
| 1.0 | 0.934 |
| 1.0 | 0.935 |
| 1.0 | 0.935 |
| 1.0 | 0.935 |
| 1.0 | 0.935 |
| 1.0 | 0.935 |
| 1.0 | 0.935 |
| 1.0 | 0.935 |
| 1.0 | 0.935 |
| 1.0 | 0.935 |
| 1.0 | 0.935 |
| 1.0 | 0.936 |
| 1.0 | 0.936 |
| 1.0 | 0.936 |
| 1.0 | 0.936 |
| 1.0 | 0.936 |
| 1.0 | 0.936 |
| 1.0 | 0.936 |
| 1.0 | 0.936 |
| 1.0 | 0.936 |
| 1.0 | 0.936 |
| 1.0 | 0.937 |
| 1.0 | 0.937 |
| 1.0 | 0.937 |
| 1.0 | 0.937 |
| 1.0 | 0.937 |
| 1.0 | 0.937 |
| 1.0 | 0.937 |
| 1.0 | 0.937 |
| 1.0 | 0.937 |
| 1.0 | 0.937 |
| 1.0 | 0.938 |
| 1.0 | 0.938 |
| 1.0 | 0.938 |
| 1.0 | 0.938 |
| 1.0 | 0.938 |
| 1.0 | 0.938 |
| 1.0 | 0.938 |
| 1.0 | 0.938 |
| 1.0 | 0.938 |
| 1.0 | 0.938 |
| 1.0 | 0.939 |
| 1.0 | 0.939 |
| 1.0 | 0.939 |
| 1.0 | 0.939 |
| 1.0 | 0.939 |
| 1.0 | 0.939 |
| 1.0 | 0.939 |
| 1.0 | 0.939 |
| 1.0 | 0.939 |
| 1.0 | 0.939 |
| 1.0 | 0.94 |
| 1.0 | 0.94 |
| 1.0 | 0.94 |
| 1.0 | 0.94 |
| 1.0 | 0.94 |
| 1.0 | 0.94 |
| 1.0 | 0.94 |
| 1.0 | 0.94 |
| 1.0 | 0.94 |
| 1.0 | 0.94 |
| 1.0 | 0.941 |
| 1.0 | 0.941 |
| 1.0 | 0.941 |
| 1.0 | 0.941 |
| 1.0 | 0.941 |
| 1.0 | 0.941 |
| 1.0 | 0.941 |
| 1.0 | 0.941 |
| 1.0 | 0.941 |
| 1.0 | 0.941 |
| 1.0 | 0.942 |
| 1.0 | 0.942 |
| 1.0 | 0.942 |
| 1.0 | 0.942 |
| 1.0 | 0.942 |
| 1.0 | 0.942 |
| 1.0 | 0.942 |
| 1.0 | 0.942 |
| 1.0 | 0.942 |
| 1.0 | 0.942 |
| 1.0 | 0.943 |
| 1.0 | 0.943 |
| 1.0 | 0.943 |
| 1.0 | 0.943 |
| 1.0 | 0.943 |
| 1.0 | 0.943 |
| 1.0 | 0.943 |
| 1.0 | 0.943 |
| 1.0 | 0.943 |
| 1.0 | 0.943 |
| 1.0 | 0.944 |
| 1.0 | 0.944 |
| 1.0 | 0.944 |
| 1.0 | 0.944 |
| 1.0 | 0.944 |
| 1.0 | 0.944 |
| 1.0 | 0.944 |
| 1.0 | 0.944 |
| 1.0 | 0.944 |
| 1.0 | 0.944 |
| 1.0 | 0.945 |
| 1.0 | 0.945 |
| 1.0 | 0.945 |
| 1.0 | 0.945 |
| 1.0 | 0.945 |
| 1.0 | 0.945 |
| 1.0 | 0.945 |
| 1.0 | 0.945 |
| 1.0 | 0.945 |
| 1.0 | 0.945 |
| 1.0 | 0.946 |
| 1.0 | 0.946 |
| 1.0 | 0.946 |
| 1.0 | 0.946 |
| 1.0 | 0.946 |
| 1.0 | 0.946 |
| 1.0 | 0.946 |
| 1.0 | 0.946 |
| 1.0 | 0.946 |
| 1.0 | 0.946 |
| 1.0 | 0.947 |
| 1.0 | 0.947 |
| 1.0 | 0.947 |
| 1.0 | 0.947 |
| 1.0 | 0.947 |
| 1.0 | 0.947 |
| 1.0 | 0.947 |
| 1.0 | 0.947 |
| 1.0 | 0.947 |
| 1.0 | 0.947 |
| 1.0 | 0.948 |
| 1.0 | 0.948 |
| 1.0 | 0.948 |
| 1.0 | 0.948 |
| 1.0 | 0.948 |
| 1.0 | 0.948 |
| 1.0 | 0.948 |
| 1.0 | 0.948 |
| 1.0 | 0.948 |
| 1.0 | 0.948 |
| 1.0 | 0.949 |
| 1.0 | 0.949 |
| 1.0 | 0.949 |
| 1.0 | 0.949 |
| 1.0 | 0.949 |
| 1.0 | 0.949 |
| 1.0 | 0.949 |
| 1.0 | 0.949 |
| 1.0 | 0.949 |
| 1.0 | 0.949 |
| 1.0 | 0.95 |
| 1.0 | 0.95 |
| 1.0 | 0.95 |
| 1.0 | 0.95 |
| 1.0 | 0.95 |
| 1.0 | 0.95 |
| 1.0 | 0.95 |
| 1.0 | 0.95 |
| 1.0 | 0.95 |
| 1.0 | 0.95 |
| 1.0 | 0.951 |
| 1.0 | 0.951 |
| 1.0 | 0.951 |
| 1.0 | 0.951 |
| 1.0 | 0.951 |
| 1.0 | 0.951 |
| 1.0 | 0.951 |
| 1.0 | 0.951 |
| 1.0 | 0.951 |
| 1.0 | 0.951 |
| 1.0 | 0.952 |
| 1.0 | 0.952 |
| 1.0 | 0.952 |
| 1.0 | 0.952 |
| 1.0 | 0.952 |
| 1.0 | 0.952 |
| 1.0 | 0.952 |
| 1.0 | 0.952 |
| 1.0 | 0.952 |
| 1.0 | 0.952 |
| 1.0 | 0.953 |
| 1.0 | 0.953 |
| 1.0 | 0.953 |
| 1.0 | 0.953 |
| 1.0 | 0.953 |
| 1.0 | 0.953 |
| 1.0 | 0.953 |
| 1.0 | 0.953 |
| 1.0 | 0.953 |
| 1.0 | 0.953 |
| 1.0 | 0.954 |
| 1.0 | 0.954 |
| 1.0 | 0.954 |
| 1.0 | 0.954 |
| 1.0 | 0.954 |
| 1.0 | 0.954 |
| 1.0 | 0.954 |
| 1.0 | 0.954 |
| 1.0 | 0.954 |
| 1.0 | 0.954 |
| 1.0 | 0.955 |
| 1.0 | 0.955 |
| 1.0 | 0.955 |
| 1.0 | 0.955 |
| 1.0 | 0.955 |
| 1.0 | 0.955 |
| 1.0 | 0.955 |
| 1.0 | 0.955 |
| 1.0 | 0.955 |
| 1.0 | 0.955 |
| 1.0 | 0.956 |
| 1.0 | 0.956 |
| 1.0 | 0.956 |
| 1.0 | 0.956 |
| 1.0 | 0.956 |
| 1.0 | 0.956 |
| 1.0 | 0.956 |
| 1.0 | 0.956 |
| 1.0 | 0.956 |
| 1.0 | 0.956 |
| 1.0 | 0.957 |
| 1.0 | 0.957 |
| 1.0 | 0.957 |
| 1.0 | 0.957 |
| 1.0 | 0.957 |
| 1.0 | 0.957 |
| 1.0 | 0.957 |
| 1.0 | 0.957 |
| 1.0 | 0.957 |
| 1.0 | 0.957 |
| 1.0 | 0.958 |
| 1.0 | 0.958 |
| 1.0 | 0.958 |
| 1.0 | 0.958 |
| 1.0 | 0.958 |
| 1.0 | 0.958 |
| 1.0 | 0.958 |
| 1.0 | 0.958 |
| 1.0 | 0.958 |
| 1.0 | 0.958 |
| 1.0 | 0.959 |
| 1.0 | 0.959 |
| 1.0 | 0.959 |
| 1.0 | 0.959 |
| 1.0 | 0.959 |
| 1.0 | 0.959 |
| 1.0 | 0.959 |
| 1.0 | 0.959 |
| 1.0 | 0.959 |
| 1.0 | 0.959 |
| 1.0 | 0.96 |
| 1.0 | 0.96 |
| 1.0 | 0.96 |
| 1.0 | 0.96 |
| 1.0 | 0.96 |
| 1.0 | 0.96 |
| 1.0 | 0.96 |
| 1.0 | 0.96 |
| 1.0 | 0.96 |
| 1.0 | 0.96 |
| 1.0 | 0.961 |
| 1.0 | 0.961 |
| 1.0 | 0.961 |
| 1.0 | 0.961 |
| 1.0 | 0.961 |
| 1.0 | 0.961 |
| 1.0 | 0.961 |
| 1.0 | 0.961 |
| 1.0 | 0.961 |
| 1.0 | 0.961 |
| 1.0 | 0.962 |
| 1.0 | 0.962 |
| 1.0 | 0.962 |
| 1.0 | 0.962 |
| 1.0 | 0.962 |
| 1.0 | 0.962 |
| 1.0 | 0.962 |
| 1.0 | 0.962 |
| 1.0 | 0.962 |
| 1.0 | 0.962 |
| 1.0 | 0.963 |
| 1.0 | 0.963 |
| 1.0 | 0.963 |
| 1.0 | 0.963 |
| 1.0 | 0.963 |
| 1.0 | 0.963 |
| 1.0 | 0.963 |
| 1.0 | 0.963 |
| 1.0 | 0.963 |
| 1.0 | 0.963 |
| 1.0 | 0.964 |
| 1.0 | 0.964 |
| 1.0 | 0.964 |
| 1.0 | 0.964 |
| 1.0 | 0.964 |
| 1.0 | 0.964 |
| 1.0 | 0.964 |
| 1.0 | 0.964 |
| 1.0 | 0.964 |
| 1.0 | 0.964 |
| 1.0 | 0.965 |
| 1.0 | 0.965 |
| 1.0 | 0.965 |
| 1.0 | 0.965 |
| 1.0 | 0.965 |
| 1.0 | 0.965 |
| 1.0 | 0.965 |
| 1.0 | 0.965 |
| 1.0 | 0.965 |
| 1.0 | 0.965 |
| 1.0 | 0.966 |
| 1.0 | 0.966 |
| 1.0 | 0.966 |
| 1.0 | 0.966 |
| 1.0 | 0.966 |
| 1.0 | 0.966 |
| 1.0 | 0.966 |
| 1.0 | 0.966 |
| 1.0 | 0.966 |
| 1.0 | 0.966 |
| 1.0 | 0.967 |
| 1.0 | 0.967 |
| 1.0 | 0.967 |
| 1.0 | 0.967 |
| 1.0 | 0.967 |
| 1.0 | 0.967 |
| 1.0 | 0.967 |
| 1.0 | 0.967 |
| 1.0 | 0.967 |
| 1.0 | 0.967 |
| 1.0 | 0.968 |
| 1.0 | 0.968 |
| 1.0 | 0.968 |
| 1.0 | 0.968 |
| 1.0 | 0.968 |
| 1.0 | 0.968 |
| 1.0 | 0.968 |
| 1.0 | 0.968 |
| 1.0 | 0.968 |
| 1.0 | 0.968 |
| 1.0 | 0.969 |
| 1.0 | 0.969 |
| 1.0 | 0.969 |
| 1.0 | 0.969 |
| 1.0 | 0.969 |
| 1.0 | 0.969 |
| 1.0 | 0.969 |
| 1.0 | 0.969 |
| 1.0 | 0.969 |
| 1.0 | 0.969 |
| 1.0 | 0.97 |
| 1.0 | 0.97 |
| 1.0 | 0.97 |
| 1.0 | 0.97 |
| 1.0 | 0.97 |
| 1.0 | 0.97 |
| 1.0 | 0.97 |
| 1.0 | 0.97 |
| 1.0 | 0.97 |
| 1.0 | 0.97 |
| 1.0 | 0.971 |
| 1.0 | 0.971 |
| 1.0 | 0.971 |
| 1.0 | 0.971 |
| 1.0 | 0.971 |
| 1.0 | 0.971 |
| 1.0 | 0.971 |
| 1.0 | 0.971 |
| 1.0 | 0.971 |
| 1.0 | 0.971 |
| 1.0 | 0.972 |
| 1.0 | 0.972 |
| 1.0 | 0.972 |
| 1.0 | 0.972 |
| 1.0 | 0.972 |
| 1.0 | 0.972 |
| 1.0 | 0.972 |
| 1.0 | 0.972 |
| 1.0 | 0.972 |
| 1.0 | 0.972 |
| 1.0 | 0.973 |
| 1.0 | 0.973 |
| 1.0 | 0.973 |
| 1.0 | 0.973 |
| 1.0 | 0.973 |
| 1.0 | 0.973 |
| 1.0 | 0.973 |
| 1.0 | 0.973 |
| 1.0 | 0.973 |
| 1.0 | 0.973 |
| 1.0 | 0.974 |
| 1.0 | 0.974 |
| 1.0 | 0.974 |
| 1.0 | 0.974 |
| 1.0 | 0.974 |
| 1.0 | 0.974 |
| 1.0 | 0.974 |
| 1.0 | 0.974 |
| 1.0 | 0.974 |
| 1.0 | 0.974 |
| 1.0 | 0.975 |
| 1.0 | 0.975 |
| 1.0 | 0.975 |
| 1.0 | 0.975 |
| 1.0 | 0.975 |
| 1.0 | 0.975 |
| 1.0 | 0.975 |
| 1.0 | 0.975 |
| 1.0 | 0.975 |
| 1.0 | 0.975 |
| 1.0 | 0.976 |
| 1.0 | 0.976 |
| 1.0 | 0.976 |
| 1.0 | 0.976 |
| 1.0 | 0.976 |
| 1.0 | 0.976 |
| 1.0 | 0.976 |
| 1.0 | 0.976 |
| 1.0 | 0.976 |
| 1.0 | 0.976 |
| 1.0 | 0.977 |
| 1.0 | 0.977 |
| 1.0 | 0.977 |
| 1.0 | 0.977 |
| 1.0 | 0.977 |
| 1.0 | 0.977 |
| 1.0 | 0.977 |
| 1.0 | 0.977 |
| 1.0 | 0.977 |
| 1.0 | 0.977 |
| 1.0 | 0.978 |
| 1.0 | 0.978 |
| 1.0 | 0.978 |
| 1.0 | 0.978 |
| 1.0 | 0.978 |
| 1.0 | 0.978 |
| 1.0 | 0.978 |
| 1.0 | 0.978 |
| 1.0 | 0.978 |
| 1.0 | 0.978 |
| 1.0 | 0.979 |
| 1.0 | 0.979 |
| 1.0 | 0.979 |
| 1.0 | 0.979 |
| 1.0 | 0.979 |
| 1.0 | 0.979 |
| 1.0 | 0.979 |
| 1.0 | 0.979 |
| 1.0 | 0.979 |
| 1.0 | 0.979 |
| 1.0 | 0.98 |
| 1.0 | 0.98 |
| 1.0 | 0.98 |
| 1.0 | 0.98 |
| 1.0 | 0.98 |
| 1.0 | 0.98 |
| 1.0 | 0.98 |
| 1.0 | 0.98 |
| 1.0 | 0.98 |
| 1.0 | 0.98 |
| 1.0 | 0.981 |
| 1.0 | 0.981 |
| 1.0 | 0.981 |
| 1.0 | 0.981 |
| 1.0 | 0.981 |
| 1.0 | 0.981 |
| 1.0 | 0.981 |
| 1.0 | 0.981 |
| 1.0 | 0.981 |
| 1.0 | 0.981 |
| 1.0 | 0.982 |
| 1.0 | 0.982 |
| 1.0 | 0.982 |
| 1.0 | 0.982 |
| 1.0 | 0.982 |
| 1.0 | 0.982 |
| 1.0 | 0.982 |
| 1.0 | 0.982 |
| 1.0 | 0.982 |
| 1.0 | 0.982 |
| 1.0 | 0.983 |
| 1.0 | 0.983 |
| 1.0 | 0.983 |
| 1.0 | 0.983 |
| 1.0 | 0.983 |
| 1.0 | 0.983 |
| 1.0 | 0.983 |
| 1.0 | 0.983 |
| 1.0 | 0.983 |
| 1.0 | 0.983 |
| 1.0 | 0.984 |
| 1.0 | 0.984 |
| 1.0 | 0.984 |
| 1.0 | 0.984 |
| 1.0 | 0.984 |
| 1.0 | 0.984 |
| 1.0 | 0.984 |
| 1.0 | 0.984 |
| 1.0 | 0.984 |
| 1.0 | 0.984 |
| 1.0 | 0.985 |
| 1.0 | 0.985 |
| 1.0 | 0.985 |
| 1.0 | 0.985 |
| 1.0 | 0.985 |
| 1.0 | 0.985 |
| 1.0 | 0.985 |
| 1.0 | 0.985 |
| 1.0 | 0.985 |
| 1.0 | 0.985 |
| 1.0 | 0.986 |
| 1.0 | 0.986 |
| 1.0 | 0.986 |
| 1.0 | 0.986 |
| 1.0 | 0.986 |
| 1.0 | 0.986 |
| 1.0 | 0.986 |
| 1.0 | 0.986 |
| 1.0 | 0.986 |
| 1.0 | 0.986 |
| 1.0 | 0.987 |
| 1.0 | 0.987 |
| 1.0 | 0.987 |
| 1.0 | 0.987 |
| 1.0 | 0.987 |
| 1.0 | 0.987 |
| 1.0 | 0.987 |
| 1.0 | 0.987 |
| 1.0 | 0.987 |
| 1.0 | 0.987 |
| 1.0 | 0.988 |
| 1.0 | 0.988 |
| 1.0 | 0.988 |
| 1.0 | 0.988 |
| 1.0 | 0.988 |
| 1.0 | 0.988 |
| 1.0 | 0.988 |
| 1.0 | 0.988 |
| 1.0 | 0.988 |
| 1.0 | 0.988 |
| 1.0 | 0.989 |
| 1.0 | 0.989 |
| 1.0 | 0.989 |
| 1.0 | 0.989 |
| 1.0 | 0.989 |
| 1.0 | 0.989 |
| 1.0 | 0.989 |
| 1.0 | 0.989 |
| 1.0 | 0.989 |
| 1.0 | 0.989 |
| 1.0 | 0.99 |
| 1.0 | 0.99 |
| 1.0 | 0.99 |
| 1.0 | 0.99 |
| 1.0 | 0.99 |
| 1.0 | 0.99 |
| 1.0 | 0.99 |
| 1.0 | 0.99 |
| 1.0 | 0.99 |
| 1.0 | 0.99 |
| 1.0 | 0.991 |
| 1.0 | 0.991 |
| 1.0 | 0.991 |
| 1.0 | 0.991 |
| 1.0 | 0.991 |
| 1.0 | 0.991 |
| 1.0 | 0.991 |
| 1.0 | 0.991 |
| 1.0 | 0.991 |
| 1.0 | 0.991 |
| 1.0 | 0.992 |
| 1.0 | 0.992 |
| 1.0 | 0.992 |
| 1.0 | 0.992 |
| 1.0 | 0.992 |
| 1.0 | 0.992 |
| 1.0 | 0.992 |
| 1.0 | 0.992 |
| 1.0 | 0.992 |
| 1.0 | 0.992 |
| 1.0 | 0.993 |
| 1.0 | 0.993 |
| 1.0 | 0.993 |
| 1.0 | 0.993 |
| 1.0 | 0.993 |
| 1.0 | 0.993 |
| 1.0 | 0.993 |
| 1.0 | 0.993 |
| 1.0 | 0.993 |
| 1.0 | 0.993 |
| 1.0 | 0.994 |
| 1.0 | 0.994 |
| 1.0 | 0.994 |
| 1.0 | 0.994 |
| 1.0 | 0.994 |
| 1.0 | 0.994 |
| 1.0 | 0.994 |
| 1.0 | 0.994 |
| 1.0 | 0.994 |
| 1.0 | 0.994 |
| 1.0 | 0.995 |
| 1.0 | 0.995 |
| 1.0 | 0.995 |
| 1.0 | 0.995 |
| 1.0 | 0.995 |
| 1.0 | 0.995 |
| 1.0 | 0.995 |
| 1.0 | 0.995 |
| 1.0 | 0.995 |
| 1.0 | 0.995 |
| 1.0 | 0.996 |
| 1.0 | 0.996 |
| 1.0 | 0.996 |
| 1.0 | 0.996 |
| 1.0 | 0.996 |
| 1.0 | 0.996 |
| 1.0 | 0.996 |
| 1.0 | 0.996 |
| 1.0 | 0.996 |
| 1.0 | 0.996 |
| 1.0 | 0.997 |
| 1.0 | 0.997 |
| 1.0 | 0.997 |
| 1.0 | 0.997 |
| 1.0 | 0.997 |
| 1.0 | 0.997 |
| 1.0 | 0.997 |
| 1.0 | 0.997 |
| 1.0 | 0.997 |
| 1.0 | 0.997 |
| 1.0 | 0.998 |
| 1.0 | 0.998 |
| 1.0 | 0.998 |
| 1.0 | 0.998 |
| 1.0 | 0.998 |
| 1.0 | 0.998 |
| 1.0 | 0.998 |
| 1.0 | 0.998 |
| 1.0 | 0.998 |
| 1.0 | 0.998 |
| 1.0 | 0.999 |
| 1.0 | 0.999 |
| 1.0 | 0.999 |
| 1.0 | 0.999 |
| 1.0 | 0.999 |
| 1.0 | 0.999 |
| 1.0 | 0.999 |
| 1.0 | 0.999 |
| 1.0 | 0.999 |
| 1.0 | 0.999 |
| 1.0 | 1 |
| 1.0 | 1 |
| 1.0 | 1 |
| 1.0 | 1 |
| 1.0 | 1 |